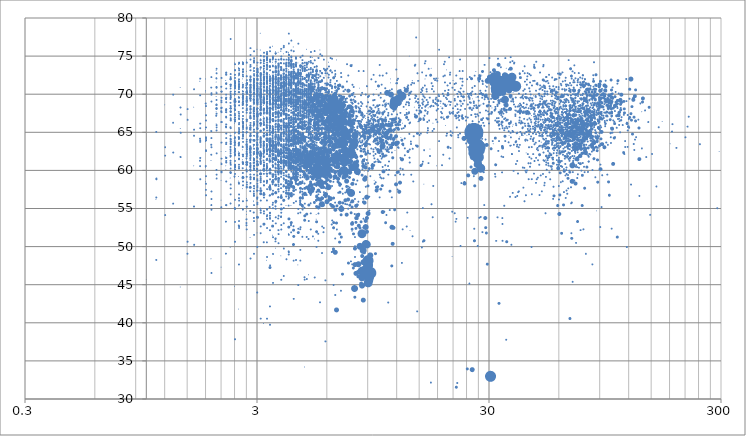
| Category | Series 0 |
|---|---|
| 32.8 | 71.7 |
| 34.4 | 70.9 |
| 37.3 | 71.2 |
| 32.4 | 70.5 |
| 38.9 | 71.1 |
| 34.9 | 71.7 |
| 36.9 | 71.7 |
| 31.8 | 71.5 |
| 35.6 | 71 |
| 34.1 | 71.4 |
| 36.6 | 71.7 |
| 32.5 | 71.6 |
| 31.3 | 71.7 |
| 31.3 | 72.2 |
| 35.1 | 72 |
| 37.5 | 72.3 |
| 34.3 | 70.3 |
| 31.7 | 70.8 |
| 35.1 | 69.3 |
| 37.8 | 71.3 |
| 36.3 | 71.3 |
| 35.1 | 71.8 |
| 38.5 | 71.3 |
| 32.3 | 71.9 |
| 35.2 | 72 |
| 31.8 | 69.8 |
| 32.5 | 71.5 |
| 35.6 | 72.2 |
| 36.0 | 71 |
| 37.6 | 71.1 |
| 35.6 | 72 |
| 32.8 | 71.4 |
| 37.9 | 71.5 |
| 36.7 | 70.9 |
| 38.2 | 71.1 |
| 31.2 | 71.5 |
| 35.8 | 71.8 |
| 35.6 | 72.1 |
| 33.5 | 71.8 |
| 32.3 | 71.7 |
| 35.1 | 72.5 |
| 31.3 | 72.5 |
| 36.6 | 70.5 |
| 31.4 | 71.5 |
| 35.9 | 71.5 |
| 32.5 | 72.2 |
| 29.5 | 71.8 |
| 32.6 | 72.7 |
| 31.4 | 70.5 |
| 32.1 | 71.6 |
| 36.0 | 71.7 |
| 35.5 | 71 |
| 31.4 | 71.6 |
| 34.3 | 71.5 |
| 35.5 | 68.6 |
| 36.9 | 71.2 |
| 31.7 | 72.4 |
| 35.8 | 71.4 |
| 30.0 | 72.3 |
| 36.8 | 71.4 |
| 33.2 | 70.8 |
| 37.3 | 71.1 |
| 37.1 | 69.8 |
| 34.1 | 71.7 |
| 33.7 | 67.7 |
| 30.8 | 72.4 |
| 32.9 | 73.9 |
| 31.4 | 73.2 |
| 32.8 | 71.8 |
| 37.1 | 73.4 |
| 27.1 | 72.1 |
| 34.0 | 72.1 |
| 34.1 | 71 |
| 33.2 | 71.9 |
| 23.2 | 69.7 |
| 28.1 | 70 |
| 27.2 | 72.5 |
| 25.1 | 72.1 |
| 46.9 | 73.5 |
| 26.0 | 71.1 |
| 27.7 | 70.2 |
| 23.4 | 69.2 |
| 49.1 | 68.4 |
| 32.9 | 67.7 |
| 45.2 | 66.7 |
| 47.2 | 66 |
| 37.9 | 65.8 |
| 5.6 | 58.4 |
| 5.8 | 61.5 |
| 5.8 | 59.6 |
| 6.0 | 60.7 |
| 5.7 | 61.2 |
| 6.1 | 57.8 |
| 5.8 | 59.9 |
| 5.3 | 61.4 |
| 5.9 | 60.5 |
| 6.0 | 61.5 |
| 5.4 | 60.5 |
| 5.2 | 60.2 |
| 6.9 | 55 |
| 7.3 | 58.6 |
| 6.0 | 59.7 |
| 5.5 | 59.2 |
| 5.1 | 62.3 |
| 5.5 | 61.1 |
| 5.7 | 57.9 |
| 5.5 | 61.8 |
| 6.0 | 55.9 |
| 6.0 | 60.4 |
| 4.4 | 59 |
| 8.9 | 56.5 |
| 5.2 | 57.6 |
| 5.5 | 59.5 |
| 6.2 | 61.4 |
| 5.4 | 61.4 |
| 6.0 | 60.3 |
| 6.2 | 60.2 |
| 5.8 | 61.6 |
| 6.5 | 59.2 |
| 5.4 | 59.8 |
| 5.8 | 62.5 |
| 5.6 | 62.3 |
| 9.0 | 54.4 |
| 4.9 | 61.3 |
| 5.7 | 60 |
| 6.1 | 59.5 |
| 5.1 | 58.1 |
| 8.7 | 58.9 |
| 5.2 | 61.6 |
| 4.1 | 61.8 |
| 5.5 | 60.9 |
| 5.9 | 56.9 |
| 7.9 | 47.7 |
| 5.8 | 60.8 |
| 5.8 | 61.7 |
| 5.2 | 59.8 |
| 12.4 | 58.4 |
| 5.9 | 58.4 |
| 5.0 | 57.6 |
| 5.2 | 62 |
| 12.3 | 57.2 |
| 5.9 | 59.4 |
| 5.5 | 61.6 |
| 5.7 | 60.3 |
| 6.1 | 61.1 |
| 4.8 | 62.9 |
| 4.8 | 62.5 |
| 5.5 | 59.5 |
| 5.8 | 60.2 |
| 5.8 | 60.9 |
| 6.5 | 59.8 |
| 5.8 | 59.3 |
| 5.2 | 60.2 |
| 5.4 | 61 |
| 5.1 | 57.2 |
| 5.6 | 61.3 |
| 4.8 | 59.5 |
| 5.3 | 61.3 |
| 5.5 | 56.3 |
| 5.5 | 60 |
| 11.9 | 58.2 |
| 10.5 | 59.9 |
| 4.9 | 62.5 |
| 5.1 | 61.8 |
| 4.5 | 62.7 |
| 6.1 | 59.8 |
| 8.8 | 53.4 |
| 5.2 | 62.1 |
| 6.2 | 62.4 |
| 6.2 | 59.3 |
| 5.4 | 62.2 |
| 5.3 | 60 |
| 5.6 | 62.9 |
| 5.6 | 60.5 |
| 6.2 | 59.2 |
| 5.5 | 59.1 |
| 5.5 | 60.2 |
| 8.7 | 55.8 |
| 9.8 | 57.4 |
| 5.4 | 60.8 |
| 5.7 | 61.8 |
| 4.5 | 62.2 |
| 5.1 | 60.8 |
| 6.0 | 58.8 |
| 5.5 | 57.4 |
| 8.9 | 53.8 |
| 5.6 | 56.2 |
| 5.1 | 61.9 |
| 5.0 | 60.8 |
| 5.9 | 61.2 |
| 5.5 | 62.1 |
| 5.3 | 59.5 |
| 5.4 | 62.2 |
| 5.7 | 56.4 |
| 5.8 | 62.3 |
| 6.0 | 61.7 |
| 5.3 | 60.7 |
| 4.3 | 61.2 |
| 5.6 | 59.3 |
| 4.5 | 62.2 |
| 7.7 | 56 |
| 5.8 | 60.9 |
| 4.8 | 60.7 |
| 4.9 | 61.8 |
| 7.9 | 49.8 |
| 5.4 | 61.9 |
| 9.4 | 60.7 |
| 6.1 | 62.7 |
| 5.4 | 62 |
| 5.4 | 62 |
| 5.2 | 61.9 |
| 5.6 | 59.7 |
| 5.2 | 59.9 |
| 5.2 | 63.1 |
| 4.7 | 64.5 |
| 4.6 | 61.9 |
| 4.6 | 62.2 |
| 6.0 | 62.1 |
| 8.1 | 54.1 |
| 7.2 | 60.9 |
| 4.8 | 57 |
| 8.2 | 52.8 |
| 8.1 | 54.2 |
| 5.1 | 61.3 |
| 4.4 | 61.3 |
| 6.4 | 62.1 |
| 7.0 | 62 |
| 5.5 | 55.2 |
| 5.1 | 61.7 |
| 10.4 | 54.6 |
| 4.6 | 61.9 |
| 5.0 | 60.5 |
| 6.2 | 59.2 |
| 10.4 | 58 |
| 5.8 | 61.3 |
| 12.2 | 59.8 |
| 5.7 | 59.4 |
| 5.1 | 57.2 |
| 8.0 | 53.7 |
| 5.7 | 58.6 |
| 5.2 | 62.3 |
| 5.4 | 61.4 |
| 5.0 | 60 |
| 4.9 | 60.5 |
| 5.3 | 55.8 |
| 5.2 | 62.5 |
| 4.6 | 61.4 |
| 4.7 | 61.8 |
| 5.9 | 59.5 |
| 4.0 | 58.7 |
| 5.9 | 60.8 |
| 5.6 | 61.7 |
| 4.4 | 61.6 |
| 5.4 | 58.1 |
| 5.0 | 61.1 |
| 5.0 | 57.8 |
| 6.7 | 58.5 |
| 5.1 | 61.3 |
| 5.7 | 61.5 |
| 4.9 | 57.8 |
| 8.0 | 53.2 |
| 5.7 | 62.5 |
| 5.2 | 59.5 |
| 4.4 | 61.7 |
| 4.7 | 60.6 |
| 5.3 | 58.2 |
| 5.0 | 61.8 |
| 4.9 | 60.4 |
| 4.6 | 60.3 |
| 5.4 | 56.1 |
| 4.5 | 60.2 |
| 5.1 | 59.2 |
| 5.7 | 61.6 |
| 5.1 | 59.7 |
| 4.9 | 61.8 |
| 4.9 | 61.3 |
| 9.8 | 57.8 |
| 4.6 | 56.4 |
| 4.9 | 61.2 |
| 7.7 | 52.3 |
| 4.5 | 61.4 |
| 8.1 | 55.5 |
| 5.3 | 61.4 |
| 4.5 | 63.8 |
| 4.8 | 60.5 |
| 3.2 | 60.1 |
| 4.5 | 61.1 |
| 5.6 | 61.2 |
| 5.5 | 61.3 |
| 5.2 | 60.1 |
| 5.0 | 62.1 |
| 5.2 | 61.2 |
| 5.9 | 63.7 |
| 5.2 | 57.5 |
| 5.1 | 59.8 |
| 4.3 | 50.3 |
| 5.1 | 60.1 |
| 2.8 | 57.8 |
| 5.5 | 61.9 |
| 4.8 | 59.5 |
| 11.2 | 57.3 |
| 5.0 | 60.8 |
| 7.8 | 51.7 |
| 5.8 | 59.4 |
| 5.5 | 61.5 |
| 6.2 | 58.6 |
| 5.4 | 58.8 |
| 5.0 | 60.8 |
| 4.5 | 61.8 |
| 5.1 | 62 |
| 6.8 | 59.3 |
| 5.8 | 57.8 |
| 5.2 | 60.3 |
| 4.3 | 61.2 |
| 5.2 | 59.2 |
| 4.5 | 58.2 |
| 5.5 | 60.3 |
| 6.4 | 60.7 |
| 4.2 | 62.2 |
| 4.3 | 61.9 |
| 9.0 | 58 |
| 5.0 | 60.9 |
| 5.3 | 61.2 |
| 4.9 | 61.2 |
| 4.9 | 62 |
| 4.8 | 60.4 |
| 4.8 | 61.1 |
| 5.8 | 61.2 |
| 5.1 | 60 |
| 5.7 | 59.7 |
| 5.8 | 62.1 |
| 4.3 | 52.2 |
| 4.7 | 61 |
| 3.9 | 62.4 |
| 6.2 | 62.7 |
| 5.9 | 60.5 |
| 3.9 | 56.1 |
| 4.6 | 60.9 |
| 8.6 | 55.9 |
| 4.5 | 64.2 |
| 6.1 | 61.9 |
| 3.5 | 58.5 |
| 5.2 | 59.8 |
| 5.1 | 63.1 |
| 5.7 | 63 |
| 7.7 | 53.2 |
| 6.4 | 55.3 |
| 5.2 | 61.6 |
| 5.1 | 57.5 |
| 5.6 | 55.6 |
| 7.4 | 62.8 |
| 5.2 | 61.1 |
| 4.4 | 62.1 |
| 5.4 | 55.3 |
| 6.0 | 60.1 |
| 4.8 | 61.7 |
| 4.7 | 62.3 |
| 5.0 | 55.5 |
| 5.7 | 61.7 |
| 2.6 | 59.1 |
| 6.4 | 53.2 |
| 4.8 | 60.5 |
| 6.5 | 61.2 |
| 5.9 | 61.4 |
| 4.2 | 53.2 |
| 4.0 | 63 |
| 9.9 | 57.9 |
| 5.9 | 59.1 |
| 4.8 | 61.3 |
| 4.6 | 60 |
| 3.7 | 62 |
| 3.4 | 60.1 |
| 4.2 | 62.3 |
| 4.2 | 56.7 |
| 4.5 | 62.4 |
| 4.7 | 59.9 |
| 4.1 | 61.6 |
| 4.9 | 61.2 |
| 3.6 | 61.7 |
| 6.0 | 61.8 |
| 4.7 | 62.1 |
| 4.9 | 61.8 |
| 4.4 | 62.3 |
| 4.3 | 61.8 |
| 6.5 | 60.5 |
| 5.4 | 62.1 |
| 5.1 | 61.2 |
| 4.9 | 60.8 |
| 5.5 | 62.4 |
| 4.6 | 57.7 |
| 4.8 | 62.7 |
| 4.3 | 60.2 |
| 4.7 | 61.1 |
| 5.3 | 59.2 |
| 3.5 | 61.6 |
| 4.6 | 60.1 |
| 6.0 | 60.9 |
| 6.1 | 61.5 |
| 3.6 | 56 |
| 5.3 | 60.5 |
| 4.1 | 61.1 |
| 3.2 | 53 |
| 5.0 | 61.3 |
| 4.6 | 60 |
| 4.8 | 54.1 |
| 8.3 | 52.5 |
| 3.2 | 56.9 |
| 5.9 | 63.7 |
| 6.6 | 55.4 |
| 4.1 | 60.8 |
| 6.2 | 60.8 |
| 4.5 | 51.9 |
| 5.4 | 62.2 |
| 4.0 | 57.9 |
| 4.4 | 60 |
| 5.5 | 64.1 |
| 10.2 | 57.6 |
| 3.7 | 60.3 |
| 5.1 | 61.3 |
| 4.7 | 61.4 |
| 9.1 | 60.3 |
| 3.5 | 59.5 |
| 5.2 | 61.5 |
| 4.1 | 61.6 |
| 5.7 | 60.2 |
| 5.5 | 59.4 |
| 5.5 | 61.8 |
| 6.2 | 60.1 |
| 4.1 | 53.7 |
| 5.2 | 63.3 |
| 11.7 | 54.9 |
| 7.0 | 55.8 |
| 4.3 | 51.4 |
| 5.6 | 60.1 |
| 3.8 | 62.4 |
| 7.2 | 62.9 |
| 5.0 | 61.3 |
| 4.7 | 57.2 |
| 5.1 | 62.1 |
| 5.0 | 61.4 |
| 4.8 | 61.5 |
| 4.6 | 57.1 |
| 4.7 | 61.2 |
| 4.1 | 61.4 |
| 5.0 | 58.9 |
| 4.9 | 61.7 |
| 5.2 | 58.1 |
| 9.6 | 60.7 |
| 3.6 | 51 |
| 5.6 | 59.8 |
| 3.6 | 60.9 |
| 6.4 | 58.5 |
| 6.5 | 61 |
| 5.0 | 58 |
| 4.3 | 57.9 |
| 4.0 | 59.9 |
| 3.7 | 53.7 |
| 4.6 | 55.8 |
| 16.7 | 61.9 |
| 3.3 | 60.2 |
| 2.7 | 53.1 |
| 6.1 | 62.5 |
| 11.2 | 54.8 |
| 5.0 | 59.1 |
| 5.0 | 51 |
| 4.8 | 60.7 |
| 5.1 | 62.4 |
| 4.3 | 59.6 |
| 3.9 | 60.2 |
| 3.6 | 59.9 |
| 4.7 | 62.5 |
| 6.0 | 60.2 |
| 8.2 | 55.9 |
| 7.5 | 59.7 |
| 7.2 | 57.1 |
| 6.7 | 59 |
| 3.6 | 55.3 |
| 7.2 | 55.6 |
| 3.7 | 61.1 |
| 4.9 | 59 |
| 3.7 | 62.4 |
| 5.3 | 60.2 |
| 2.6 | 61.1 |
| 4.3 | 59.3 |
| 5.1 | 60.9 |
| 3.5 | 58.2 |
| 8.6 | 52.5 |
| 4.7 | 55.3 |
| 4.8 | 58.3 |
| 18.8 | 60.7 |
| 3.5 | 55.5 |
| 4.6 | 52.3 |
| 3.6 | 50.7 |
| 4.6 | 60.8 |
| 5.0 | 61.4 |
| 4.5 | 61.6 |
| 7.6 | 55.8 |
| 5.6 | 60.2 |
| 5.1 | 55.7 |
| 4.8 | 62.1 |
| 7.4 | 57.9 |
| 2.8 | 54.7 |
| 2.7 | 53.6 |
| 5.5 | 61.6 |
| 4.0 | 61.2 |
| 4.2 | 62 |
| 4.6 | 59.9 |
| 5.7 | 57.9 |
| 4.9 | 59.9 |
| 4.8 | 46 |
| 5.0 | 61.6 |
| 4.3 | 59.1 |
| 6.9 | 58.2 |
| 2.5 | 52.8 |
| 2.8 | 57.3 |
| 3.8 | 58.2 |
| 9.6 | 61.1 |
| 3.0 | 62.6 |
| 3.0 | 56.3 |
| 2.2 | 53.3 |
| 4.8 | 61.9 |
| 4.8 | 61.1 |
| 3.7 | 63.4 |
| 4.7 | 58.6 |
| 6.1 | 56.2 |
| 5.7 | 59.9 |
| 7.9 | 54.3 |
| 4.0 | 60.8 |
| 3.5 | 61.7 |
| 3.6 | 51.1 |
| 3.9 | 60.5 |
| 8.6 | 56.3 |
| 5.5 | 50.8 |
| 7.7 | 47.7 |
| 4.2 | 53 |
| 4.1 | 59.2 |
| 11.1 | 60.1 |
| 4.6 | 49.6 |
| 6.7 | 57.1 |
| 12.7 | 52.3 |
| 4.9 | 51.3 |
| 3.7 | 58.2 |
| 3.6 | 55.8 |
| 3.9 | 58.1 |
| 4.7 | 62.3 |
| 4.5 | 54.4 |
| 4.9 | 57.8 |
| 2.9 | 57.3 |
| 17.2 | 58 |
| 3.8 | 56.6 |
| 4.4 | 59.4 |
| 3.5 | 53.4 |
| 8.1 | 58.7 |
| 5.1 | 54.4 |
| 2.6 | 59.2 |
| 4.0 | 57 |
| 1.9 | 62.1 |
| 4.1 | 57.4 |
| 5.4 | 50 |
| 3.3 | 58.4 |
| 4.3 | 59.8 |
| 4.5 | 59.5 |
| 3.0 | 56.5 |
| 3.0 | 60.2 |
| 6.1 | 56 |
| 4.2 | 60.5 |
| 8.6 | 53.7 |
| 3.3 | 50.6 |
| 3.8 | 54 |
| 11.4 | 56.5 |
| 4.5 | 61.7 |
| 3.7 | 52.2 |
| 3.3 | 56.1 |
| 2.9 | 53.8 |
| 2.7 | 52.3 |
| 3.0 | 50 |
| 4.6 | 59.4 |
| 12.7 | 60.2 |
| 17.1 | 53.9 |
| 4.6 | 56.5 |
| 16.9 | 55.6 |
| 3.4 | 60.2 |
| 10.1 | 56.5 |
| 5.0 | 53.4 |
| 2.5 | 47.7 |
| 2.6 | 56 |
| 4.7 | 54.9 |
| 16.4 | 61 |
| 3.6 | 57.2 |
| 5.1 | 52.3 |
| 2.8 | 59.5 |
| 5.5 | 56.9 |
| 3.4 | 52.2 |
| 15.7 | 62.7 |
| 3.7 | 58.5 |
| 3.2 | 58.6 |
| 3.1 | 58.8 |
| 5.5 | 54.4 |
| 5.7 | 49.2 |
| 3.3 | 58.7 |
| 10.8 | 54.2 |
| 8.8 | 47.1 |
| 3.3 | 55 |
| 2.6 | 54.9 |
| 2.8 | 60.2 |
| 7.9 | 56.3 |
| 4.1 | 49.3 |
| 2.3 | 56.9 |
| 8.8 | 57.9 |
| 3.4 | 61.2 |
| 9.1 | 56.6 |
| 3.6 | 60.3 |
| 5.9 | 57.7 |
| 7.9 | 51.3 |
| 2.3 | 58.2 |
| 6.6 | 52.3 |
| 3.2 | 58.6 |
| 2.9 | 55.5 |
| 9.9 | 57.6 |
| 4.4 | 62.7 |
| 4.5 | 52.4 |
| 2.4 | 55 |
| 3.2 | 56.5 |
| 2.4 | 53.3 |
| 2.2 | 55.5 |
| 3.3 | 53.7 |
| 1.9 | 57.3 |
| 2.5 | 55.5 |
| 9.1 | 54.8 |
| 5.5 | 58.8 |
| 3.8 | 48.8 |
| 6.9 | 59.1 |
| 2.7 | 56.3 |
| 7.6 | 62.1 |
| 7.6 | 57.1 |
| 7.7 | 60.5 |
| 8.1 | 59.9 |
| 7.3 | 62.2 |
| 7.2 | 62 |
| 7.2 | 62.8 |
| 6.3 | 61.5 |
| 6.6 | 61.2 |
| 7.2 | 62.5 |
| 6.9 | 61.6 |
| 7.0 | 60.2 |
| 7.3 | 61.5 |
| 7.6 | 61.2 |
| 7.4 | 59.9 |
| 6.2 | 56.3 |
| 7.1 | 62.8 |
| 7.7 | 61.9 |
| 7.5 | 61.1 |
| 7.2 | 60.2 |
| 6.9 | 60 |
| 7.1 | 61.1 |
| 7.1 | 62.5 |
| 6.8 | 59.6 |
| 68.3 | 58.6 |
| 7.8 | 62 |
| 7.4 | 57.3 |
| 7.1 | 60.8 |
| 7.1 | 59.2 |
| 6.9 | 61.5 |
| 4.2 | 60.5 |
| 6.5 | 49.3 |
| 7.5 | 59.8 |
| 7.2 | 61 |
| 77.8 | 62.4 |
| 7.2 | 59.6 |
| 8.0 | 60.5 |
| 7.2 | 61.1 |
| 7.2 | 61.2 |
| 7.0 | 61.6 |
| 83.5 | 63.1 |
| 6.0 | 59.5 |
| 7.0 | 59.9 |
| 5.0 | 60.6 |
| 8.8 | 59.1 |
| 7.4 | 61.3 |
| 7.9 | 60.8 |
| 40.8 | 67.8 |
| 5.9 | 63.5 |
| 6.5 | 61.6 |
| 6.4 | 61.2 |
| 7.4 | 62.2 |
| 7.2 | 59.8 |
| 7.3 | 59.3 |
| 6.7 | 60.9 |
| 6.6 | 64 |
| 6.7 | 58.9 |
| 5.7 | 59.7 |
| 7.0 | 61.6 |
| 7.7 | 60.2 |
| 8.6 | 60.6 |
| 7.1 | 59.6 |
| 133.2 | 61.5 |
| 5.8 | 62 |
| 60.2 | 54.3 |
| 4.9 | 61.1 |
| 7.2 | 62.4 |
| 70.7 | 58.3 |
| 7.2 | 56.1 |
| 8.8 | 60.4 |
| 7.4 | 56.2 |
| 7.2 | 59.5 |
| 7.6 | 61.8 |
| 4.2 | 58.4 |
| 4.4 | 60.4 |
| 59.5 | 60.3 |
| 7.0 | 60.9 |
| 7.4 | 60 |
| 7.0 | 60.1 |
| 6.4 | 62.8 |
| 6.8 | 55.8 |
| 8.1 | 60.7 |
| 7.7 | 62.5 |
| 6.0 | 59.8 |
| 6.8 | 61.9 |
| 6.6 | 60.5 |
| 4.1 | 62.7 |
| 6.9 | 61.4 |
| 4.6 | 58.4 |
| 8.1 | 59.7 |
| 6.9 | 61.4 |
| 102.5 | 60.9 |
| 7.5 | 57.4 |
| 4.2 | 61.7 |
| 5.1 | 60.4 |
| 28.8 | 53.8 |
| 4.9 | 59.3 |
| 8.0 | 60.8 |
| 28.9 | 69.8 |
| 4.4 | 62.8 |
| 6.7 | 61.5 |
| 5.3 | 59.9 |
| 6.7 | 60.5 |
| 6.0 | 62.7 |
| 7.9 | 63.3 |
| 137.6 | 69.5 |
| 4.4 | 59.6 |
| 7.9 | 61.1 |
| 8.0 | 61.8 |
| 4.1 | 58.2 |
| 60.0 | 61.2 |
| 5.2 | 59 |
| 7.4 | 61.1 |
| 5.1 | 61.4 |
| 6.3 | 55.4 |
| 6.5 | 54.9 |
| 6.6 | 61.3 |
| 7.4 | 64.3 |
| 7.7 | 58.3 |
| 3.5 | 65 |
| 5.0 | 61.5 |
| 7.3 | 61.7 |
| 5.3 | 67.2 |
| 4.2 | 60.2 |
| 29.5 | 47.7 |
| 5.3 | 63.3 |
| 6.7 | 60.7 |
| 6.1 | 61.4 |
| 4.7 | 55.4 |
| 3.5 | 56.9 |
| 7.0 | 67.5 |
| 7.3 | 57.9 |
| 4.3 | 59 |
| 4.2 | 61 |
| 5.1 | 57 |
| 3.6 | 61.4 |
| 5.1 | 62.5 |
| 7.4 | 62.4 |
| 6.5 | 61.9 |
| 75.6 | 55.4 |
| 6.2 | 69.3 |
| 72.2 | 53.3 |
| 6.5 | 64.4 |
| 4.3 | 62.8 |
| 98.2 | 58.5 |
| 6.8 | 62.6 |
| 3.5 | 52.7 |
| 5.2 | 72.2 |
| 7.7 | 55.2 |
| 6.8 | 58.3 |
| 4.0 | 61.2 |
| 6.7 | 64.5 |
| 8.0 | 62 |
| 6.9 | 60.9 |
| 4.6 | 60.5 |
| 8.1 | 60.8 |
| 29.0 | 52.5 |
| 6.0 | 68.1 |
| 6.8 | 50.6 |
| 6.6 | 65 |
| 7.7 | 66.5 |
| 6.4 | 49.7 |
| 4.5 | 60.1 |
| 5.1 | 58.5 |
| 67.9 | 72.4 |
| 29.2 | 51.8 |
| 28.1 | 73 |
| 3.8 | 59.9 |
| 5.8 | 59.3 |
| 7.0 | 46.4 |
| 5.1 | 60.9 |
| 5.5 | 70.8 |
| 6.2 | 69.4 |
| 6.8 | 61.7 |
| 4.0 | 67.4 |
| 74.2 | 60.9 |
| 6.4 | 49.4 |
| 4.4 | 61 |
| 146.8 | 68.3 |
| 65.9 | 63.9 |
| 68.1 | 51.1 |
| 7.8 | 64 |
| 5.3 | 62.8 |
| 5.2 | 69.2 |
| 5.1 | 62.3 |
| 6.7 | 61.7 |
| 8.1 | 61.3 |
| 89.3 | 65.5 |
| 5.1 | 66.5 |
| 8.1 | 46.7 |
| 35.1 | 64.5 |
| 7.5 | 59.1 |
| 3.7 | 59.8 |
| 60.5 | 56.8 |
| 4.1 | 69.4 |
| 4.5 | 65.1 |
| 6.4 | 63.2 |
| 7.7 | 63.9 |
| 6.5 | 68.7 |
| 8.5 | 59.4 |
| 4.4 | 62 |
| 4.2 | 58.5 |
| 51.3 | 71.9 |
| 63.2 | 59.9 |
| 4.7 | 66.4 |
| 4.6 | 62.1 |
| 6.7 | 67.1 |
| 6.0 | 60.3 |
| 6.1 | 61 |
| 137.4 | 69 |
| 87.9 | 61.4 |
| 7.4 | 64.9 |
| 4.5 | 60.7 |
| 15.7 | 50.8 |
| 60.7 | 59.7 |
| 6.2 | 60.3 |
| 4.7 | 61.5 |
| 59.2 | 55.4 |
| 9.4 | 67.7 |
| 3.4 | 62.8 |
| 6.2 | 63.4 |
| 6.4 | 56.4 |
| 6.9 | 54.2 |
| 4.7 | 65.5 |
| 3.7 | 62.2 |
| 4.4 | 65.2 |
| 4.3 | 67.6 |
| 4.3 | 57.9 |
| 6.8 | 62.3 |
| 6.7 | 62.1 |
| 6.7 | 68.7 |
| 4.5 | 71.6 |
| 3.8 | 64.2 |
| 4.4 | 60 |
| 4.0 | 67.3 |
| 7.8 | 58.8 |
| 62.7 | 55.5 |
| 3.6 | 58.1 |
| 4.1 | 64.4 |
| 7.3 | 63.8 |
| 3.4 | 61.9 |
| 6.6 | 69.6 |
| 4.7 | 56.4 |
| 6.5 | 63.4 |
| 4.4 | 61.4 |
| 6.9 | 63.4 |
| 5.1 | 64.3 |
| 6.8 | 64.2 |
| 26.5 | 65.8 |
| 5.6 | 67.5 |
| 25.9 | 50.8 |
| 3.5 | 58.6 |
| 4.1 | 57 |
| 5.7 | 69.1 |
| 7.8 | 62.1 |
| 4.9 | 63.4 |
| 4.2 | 58.9 |
| 4.0 | 58.4 |
| 4.4 | 67.3 |
| 4.7 | 71.4 |
| 3.9 | 61.3 |
| 4.5 | 64.8 |
| 3.6 | 58.9 |
| 6.2 | 71.2 |
| 5.5 | 69.2 |
| 100.5 | 71.9 |
| 4.3 | 64.3 |
| 4.6 | 70.2 |
| 8.4 | 61.9 |
| 95.5 | 71.1 |
| 4.9 | 54.3 |
| 3.7 | 63.6 |
| 5.4 | 66.2 |
| 5.2 | 57.3 |
| 5.3 | 62.5 |
| 4.1 | 62.2 |
| 53.6 | 61.7 |
| 7.9 | 43.4 |
| 4.0 | 61 |
| 77.3 | 57.7 |
| 7.5 | 64.3 |
| 4.0 | 70.4 |
| 6.9 | 67.9 |
| 3.3 | 64.7 |
| 66.8 | 40.6 |
| 5.2 | 69.2 |
| 7.5 | 69.8 |
| 5.2 | 70.6 |
| 4.1 | 56.9 |
| 6.1 | 56.6 |
| 3.1 | 62 |
| 3.5 | 66.7 |
| 4.5 | 63.9 |
| 6.9 | 62.5 |
| 7.6 | 60.3 |
| 8.0 | 64.3 |
| 3.6 | 62.5 |
| 4.2 | 74.4 |
| 6.6 | 60.8 |
| 6.2 | 62.8 |
| 6.0 | 59.1 |
| 3.9 | 63.1 |
| 4.1 | 64 |
| 4.1 | 62.3 |
| 4.3 | 64.1 |
| 5.3 | 66 |
| 5.3 | 63 |
| 5.0 | 68.8 |
| 5.4 | 71.9 |
| 26.7 | 65.8 |
| 7.0 | 61.1 |
| 4.8 | 53.5 |
| 7.7 | 70 |
| 5.5 | 68.9 |
| 6.7 | 60.6 |
| 57.0 | 56.7 |
| 8.4 | 62.6 |
| 4.3 | 62.2 |
| 6.8 | 51.7 |
| 4.9 | 61.6 |
| 4.8 | 68 |
| 4.1 | 60.6 |
| 5.4 | 63 |
| 5.1 | 69.7 |
| 6.0 | 71.4 |
| 4.8 | 61 |
| 3.7 | 65.4 |
| 4.5 | 61.4 |
| 6.4 | 61 |
| 3.8 | 63.4 |
| 65.5 | 59 |
| 5.7 | 69 |
| 4.8 | 60.7 |
| 6.3 | 59.9 |
| 5.1 | 69.4 |
| 8.1 | 59.9 |
| 4.4 | 69.1 |
| 4.7 | 68.2 |
| 6.4 | 72.2 |
| 2.8 | 62.9 |
| 82.0 | 67.2 |
| 49.4 | 62.1 |
| 4.1 | 52.6 |
| 3.5 | 62.6 |
| 88.0 | 58.5 |
| 6.1 | 63.3 |
| 8.6 | 61.4 |
| 4.9 | 60.2 |
| 4.3 | 70.6 |
| 6.7 | 60.7 |
| 6.8 | 66 |
| 4.2 | 61.6 |
| 4.4 | 69.8 |
| 4.8 | 68.8 |
| 4.6 | 64.3 |
| 7.9 | 62.3 |
| 5.0 | 68.7 |
| 3.8 | 68.6 |
| 5.3 | 64.3 |
| 7.5 | 61.3 |
| 5.4 | 73.1 |
| 4.6 | 72.8 |
| 6.7 | 63.1 |
| 3.4 | 61.3 |
| 3.6 | 62.9 |
| 5.1 | 70.2 |
| 6.3 | 62 |
| 5.2 | 63.8 |
| 4.4 | 58.7 |
| 4.0 | 69.2 |
| 3.6 | 61.6 |
| 3.7 | 67.6 |
| 5.5 | 62.9 |
| 6.5 | 69.4 |
| 3.5 | 63.3 |
| 5.1 | 70.4 |
| 3.4 | 64.1 |
| 3.7 | 62.6 |
| 5.4 | 59.3 |
| 6.8 | 61.9 |
| 5.4 | 61.1 |
| 4.2 | 64 |
| 7.6 | 62.1 |
| 103.6 | 64.3 |
| 7.0 | 71 |
| 4.6 | 61.5 |
| 10.0 | 61.2 |
| 4.7 | 64.7 |
| 6.3 | 65.6 |
| 4.7 | 64.7 |
| 5.9 | 56.6 |
| 6.8 | 64.3 |
| 4.4 | 63.6 |
| 5.9 | 62.8 |
| 4.2 | 63.4 |
| 79.9 | 70.6 |
| 5.2 | 70.5 |
| 3.8 | 61.1 |
| 6.9 | 55.3 |
| 5.6 | 71.7 |
| 75.6 | 71.2 |
| 4.3 | 57.4 |
| 5.8 | 63.1 |
| 3.6 | 57.1 |
| 81.3 | 69.9 |
| 120.8 | 70.7 |
| 4.3 | 62.6 |
| 89.1 | 68.2 |
| 6.1 | 59.5 |
| 4.5 | 62.5 |
| 5.1 | 61.9 |
| 4.2 | 61.5 |
| 4.3 | 64.6 |
| 4.9 | 62.6 |
| 3.6 | 69.2 |
| 4.1 | 64.6 |
| 5.8 | 70.8 |
| 3.6 | 63 |
| 4.1 | 57.8 |
| 106.8 | 51.3 |
| 4.3 | 63.5 |
| 3.4 | 47.3 |
| 75.5 | 59.4 |
| 4.7 | 63 |
| 125.3 | 69.5 |
| 4.2 | 56.8 |
| 5.1 | 57.1 |
| 3.4 | 64.2 |
| 4.8 | 62 |
| 6.5 | 61.5 |
| 3.4 | 62.7 |
| 3.9 | 69 |
| 3.3 | 64.2 |
| 5.0 | 59.7 |
| 4.8 | 62.4 |
| 75.9 | 68.8 |
| 4.2 | 73.9 |
| 3.9 | 61.8 |
| 5.6 | 67.2 |
| 4.3 | 61.2 |
| 5.4 | 70.1 |
| 4.0 | 62.9 |
| 4.1 | 57.7 |
| 25.3 | 64.3 |
| 3.4 | 70.1 |
| 6.0 | 69.3 |
| 5.0 | 72.5 |
| 5.9 | 73.2 |
| 4.8 | 69 |
| 3.5 | 72.1 |
| 3.7 | 68.3 |
| 6.5 | 61.4 |
| 3.3 | 70.5 |
| 6.1 | 68.6 |
| 5.1 | 59.9 |
| 5.6 | 69.1 |
| 5.0 | 69.6 |
| 4.8 | 70.1 |
| 3.6 | 69.3 |
| 4.6 | 63.9 |
| 3.7 | 69.7 |
| 6.0 | 59.5 |
| 5.4 | 62.9 |
| 3.4 | 68.2 |
| 6.1 | 59.8 |
| 3.0 | 62.9 |
| 3.4 | 63.7 |
| 4.2 | 69.1 |
| 33.3 | 71.1 |
| 3.3 | 67.6 |
| 3.1 | 59.6 |
| 5.4 | 61.6 |
| 6.7 | 68.3 |
| 6.5 | 71 |
| 5.8 | 61.3 |
| 4.4 | 64.3 |
| 6.0 | 68.2 |
| 7.6 | 73.8 |
| 2.7 | 61.1 |
| 4.8 | 63.1 |
| 5.2 | 62.8 |
| 6.2 | 61.4 |
| 4.8 | 59.6 |
| 4.3 | 59.6 |
| 7.1 | 59.8 |
| 4.4 | 58.8 |
| 7.1 | 68.7 |
| 5.3 | 59.3 |
| 8.0 | 64 |
| 4.3 | 57.8 |
| 4.3 | 59.2 |
| 4.3 | 72.2 |
| 6.9 | 51.3 |
| 5.8 | 62.4 |
| 3.7 | 62.4 |
| 4.3 | 64 |
| 4.3 | 63.7 |
| 4.9 | 61.7 |
| 4.1 | 62.8 |
| 4.4 | 72.2 |
| 5.1 | 61.8 |
| 3.8 | 71 |
| 4.4 | 63.6 |
| 95.3 | 71 |
| 4.3 | 72.4 |
| 3.9 | 71.5 |
| 4.2 | 57 |
| 3.7 | 65.8 |
| 6.7 | 71.2 |
| 4.8 | 57.7 |
| 4.8 | 62 |
| 4.3 | 70 |
| 6.5 | 63.5 |
| 4.2 | 69.4 |
| 82.9 | 69.8 |
| 34.0 | 66.4 |
| 2.4 | 69.1 |
| 5.3 | 67.8 |
| 5.6 | 69.2 |
| 5.7 | 63.9 |
| 4.4 | 65.3 |
| 3.8 | 56.5 |
| 4.1 | 61.8 |
| 75.9 | 71.6 |
| 3.5 | 68.8 |
| 4.8 | 66 |
| 3.1 | 62.2 |
| 4.1 | 60.4 |
| 3.9 | 61.1 |
| 3.7 | 63.7 |
| 71.7 | 62.8 |
| 3.0 | 53.9 |
| 80.2 | 70.7 |
| 3.9 | 61.9 |
| 5.1 | 57.2 |
| 4.1 | 69 |
| 4.2 | 58 |
| 5.2 | 70.8 |
| 3.8 | 62.4 |
| 5.3 | 70 |
| 67.1 | 73.4 |
| 3.4 | 59.7 |
| 59.3 | 69.6 |
| 86.1 | 70.7 |
| 5.6 | 70 |
| 4.6 | 61.3 |
| 4.3 | 66.8 |
| 7.5 | 63.2 |
| 61.4 | 51.8 |
| 3.7 | 64.2 |
| 5.1 | 67.9 |
| 3.0 | 62.4 |
| 5.4 | 67.1 |
| 5.1 | 63.5 |
| 5.1 | 61.6 |
| 98.6 | 56.8 |
| 4.6 | 55.6 |
| 7.5 | 55.5 |
| 4.3 | 65.3 |
| 91.7 | 66.8 |
| 3.1 | 57.4 |
| 4.5 | 69.5 |
| 4.4 | 64.4 |
| 3.5 | 62.2 |
| 6.2 | 55.6 |
| 34.1 | 63.2 |
| 5.4 | 56.7 |
| 6.6 | 60.5 |
| 4.4 | 62.6 |
| 35.6 | 50.7 |
| 4.2 | 63.4 |
| 19.9 | 63.1 |
| 5.6 | 66.6 |
| 3.7 | 61.2 |
| 3.7 | 59 |
| 4.1 | 58.2 |
| 5.0 | 71 |
| 6.8 | 69.2 |
| 4.5 | 63.7 |
| 4.3 | 61.9 |
| 4.9 | 65.6 |
| 3.6 | 63.3 |
| 6.9 | 61.2 |
| 3.9 | 65 |
| 4.3 | 73 |
| 56.5 | 61 |
| 4.6 | 73.8 |
| 5.8 | 62.3 |
| 5.0 | 69.4 |
| 5.4 | 62.1 |
| 7.2 | 67.5 |
| 6.8 | 69.3 |
| 5.6 | 62.9 |
| 3.9 | 67.9 |
| 5.7 | 67.8 |
| 4.0 | 57.1 |
| 4.1 | 64.1 |
| 4.5 | 69.2 |
| 6.7 | 70.8 |
| 4.6 | 61.6 |
| 5.4 | 64.3 |
| 74.7 | 66.9 |
| 3.1 | 57 |
| 3.4 | 63.4 |
| 5.0 | 68 |
| 4.1 | 70.3 |
| 4.4 | 58.8 |
| 4.1 | 62.3 |
| 4.1 | 59.2 |
| 3.0 | 60.8 |
| 3.1 | 69.7 |
| 4.5 | 67.6 |
| 4.1 | 65.2 |
| 3.1 | 66.2 |
| 3.8 | 55 |
| 3.4 | 57.6 |
| 5.9 | 69.8 |
| 4.5 | 69.4 |
| 4.3 | 70 |
| 5.0 | 68.9 |
| 6.8 | 57.2 |
| 3.9 | 71.1 |
| 4.3 | 64.9 |
| 10.7 | 68.7 |
| 4.4 | 68.7 |
| 3.6 | 73 |
| 5.8 | 59.5 |
| 2.9 | 64 |
| 5.3 | 72.5 |
| 6.6 | 61.1 |
| 4.8 | 64.4 |
| 31.9 | 60.8 |
| 4.4 | 71.2 |
| 4.6 | 62.1 |
| 8.6 | 61.3 |
| 5.6 | 64.5 |
| 9.5 | 69.2 |
| 3.7 | 57.5 |
| 6.9 | 44.2 |
| 5.1 | 63.9 |
| 72.0 | 59 |
| 4.8 | 68.7 |
| 4.7 | 71.4 |
| 6.4 | 70 |
| 3.8 | 74.1 |
| 2.9 | 64 |
| 4.0 | 61.7 |
| 7.3 | 66.4 |
| 4.3 | 60.5 |
| 5.9 | 71.4 |
| 3.5 | 62.5 |
| 184.5 | 65.1 |
| 3.4 | 62.8 |
| 4.1 | 58.6 |
| 2.7 | 70.3 |
| 4.4 | 63.2 |
| 3.0 | 60.2 |
| 4.0 | 69 |
| 4.4 | 67.9 |
| 4.9 | 60.7 |
| 3.8 | 69.2 |
| 4.2 | 66.6 |
| 39.0 | 56.5 |
| 7.4 | 61.5 |
| 65.7 | 59.4 |
| 5.1 | 64.1 |
| 3.9 | 67.7 |
| 4.5 | 68.3 |
| 3.7 | 67.6 |
| 4.6 | 62.3 |
| 6.1 | 67 |
| 86.2 | 59.1 |
| 4.2 | 60.8 |
| 3.9 | 68.7 |
| 4.0 | 68.1 |
| 3.6 | 69.5 |
| 3.9 | 64.8 |
| 4.2 | 58.6 |
| 4.7 | 64.3 |
| 5.6 | 70.1 |
| 4.9 | 61 |
| 5.0 | 69.6 |
| 6.8 | 54.9 |
| 6.3 | 52.9 |
| 83.9 | 68.9 |
| 5.4 | 69.4 |
| 4.8 | 59.8 |
| 5.6 | 67.8 |
| 100.6 | 63.6 |
| 3.5 | 70.5 |
| 3.2 | 68.9 |
| 3.9 | 68.7 |
| 5.3 | 69.9 |
| 3.1 | 62.5 |
| 5.9 | 66.5 |
| 6.3 | 64.6 |
| 3.8 | 64.7 |
| 4.5 | 59.2 |
| 4.0 | 69.3 |
| 7.2 | 70.6 |
| 11.9 | 69.3 |
| 4.3 | 63.8 |
| 4.8 | 69.9 |
| 3.8 | 69 |
| 84.5 | 72 |
| 39.1 | 63.7 |
| 3.2 | 62.2 |
| 3.4 | 67.4 |
| 105.4 | 70.3 |
| 7.1 | 62.3 |
| 5.0 | 70.3 |
| 5.0 | 69.9 |
| 4.0 | 70.5 |
| 6.7 | 68.3 |
| 4.2 | 52.8 |
| 2.4 | 59.2 |
| 34.9 | 70 |
| 4.7 | 62.3 |
| 4.3 | 62 |
| 4.8 | 62.8 |
| 5.3 | 69.6 |
| 5.4 | 59.1 |
| 5.5 | 70.1 |
| 5.4 | 69.6 |
| 4.0 | 67.3 |
| 28.1 | 51.9 |
| 70.2 | 67.2 |
| 4.9 | 70 |
| 2.8 | 60.5 |
| 7.3 | 61.3 |
| 5.2 | 70.6 |
| 76.5 | 65.2 |
| 4.5 | 68.7 |
| 4.0 | 71.8 |
| 3.5 | 63.4 |
| 3.4 | 70.8 |
| 3.5 | 68.1 |
| 4.6 | 67.2 |
| 4.8 | 66.2 |
| 2.8 | 65.4 |
| 60.4 | 72.6 |
| 3.2 | 69.2 |
| 4.5 | 69.3 |
| 6.2 | 65.4 |
| 4.4 | 59.3 |
| 5.0 | 71.8 |
| 3.8 | 62.8 |
| 4.4 | 68.3 |
| 3.1 | 61.5 |
| 5.2 | 62.2 |
| 3.4 | 66.7 |
| 5.2 | 60.9 |
| 4.5 | 65.7 |
| 3.5 | 64.6 |
| 3.4 | 65.3 |
| 4.7 | 64.2 |
| 52.4 | 70.8 |
| 6.1 | 67.9 |
| 5.1 | 65.6 |
| 2.7 | 63.4 |
| 7.0 | 61.7 |
| 14.7 | 41.5 |
| 4.2 | 62.6 |
| 3.6 | 63.3 |
| 5.3 | 62.4 |
| 3.4 | 56.7 |
| 4.8 | 64.1 |
| 3.5 | 69.4 |
| 4.2 | 58.2 |
| 40.0 | 59.6 |
| 68.7 | 73 |
| 3.1 | 59.5 |
| 3.7 | 67.3 |
| 4.8 | 67.5 |
| 4.6 | 71.5 |
| 4.9 | 71.8 |
| 3.5 | 62.8 |
| 4.3 | 73.6 |
| 4.6 | 72.6 |
| 4.3 | 68.4 |
| 4.8 | 68.7 |
| 3.3 | 59.6 |
| 3.6 | 70.5 |
| 3.3 | 70.4 |
| 4.3 | 61.3 |
| 32.3 | 71.3 |
| 102.2 | 70.9 |
| 3.4 | 61.9 |
| 5.1 | 59.7 |
| 5.1 | 58.3 |
| 4.6 | 64.9 |
| 4.7 | 73.4 |
| 3.9 | 63 |
| 4.0 | 61.6 |
| 2.7 | 52.8 |
| 14.0 | 71.5 |
| 10.6 | 66.7 |
| 4.0 | 69.4 |
| 2.7 | 60.1 |
| 37.0 | 74.2 |
| 73.6 | 70.5 |
| 3.5 | 61.2 |
| 3.7 | 66.4 |
| 4.9 | 68.8 |
| 5.7 | 62.8 |
| 4.0 | 69.9 |
| 3.5 | 63.9 |
| 3.9 | 62.3 |
| 4.3 | 66.7 |
| 5.2 | 72.5 |
| 4.0 | 69.2 |
| 4.0 | 63.4 |
| 3.5 | 62.2 |
| 84.4 | 72.5 |
| 6.8 | 58.1 |
| 5.0 | 69.7 |
| 5.7 | 61.2 |
| 2.5 | 63.5 |
| 96.5 | 69 |
| 8.5 | 67.6 |
| 5.4 | 65.3 |
| 117.1 | 72 |
| 3.6 | 64.3 |
| 76.2 | 72.5 |
| 6.8 | 65.7 |
| 5.5 | 64.4 |
| 3.8 | 60.5 |
| 4.8 | 61.7 |
| 5.2 | 67 |
| 102.3 | 70.1 |
| 82.2 | 71.1 |
| 3.9 | 62.6 |
| 6.1 | 72.2 |
| 3.1 | 70.8 |
| 3.9 | 71.1 |
| 6.1 | 70.2 |
| 6.4 | 67.7 |
| 6.4 | 66.7 |
| 5.9 | 61 |
| 88.8 | 67.4 |
| 4.5 | 72.5 |
| 3.9 | 67.8 |
| 7.1 | 70.4 |
| 4.0 | 61.1 |
| 117.3 | 69.1 |
| 3.6 | 70.5 |
| 8.9 | 68.4 |
| 3.1 | 60 |
| 43.7 | 60 |
| 6.2 | 61.3 |
| 4.8 | 67.5 |
| 4.8 | 55.1 |
| 4.7 | 71 |
| 92.0 | 70.7 |
| 5.6 | 70.1 |
| 27.6 | 53.9 |
| 6.1 | 67.7 |
| 5.2 | 63.8 |
| 4.1 | 69.1 |
| 4.0 | 70.1 |
| 3.6 | 63.8 |
| 51.9 | 70.9 |
| 5.0 | 69.1 |
| 85.0 | 74.2 |
| 3.6 | 63.7 |
| 4.1 | 64 |
| 157.9 | 57.9 |
| 3.4 | 55.2 |
| 3.6 | 62.7 |
| 6.0 | 71.2 |
| 97.2 | 68.6 |
| 5.4 | 56.5 |
| 69.6 | 65.6 |
| 4.9 | 71.8 |
| 3.4 | 61.5 |
| 3.7 | 60.3 |
| 3.4 | 67.8 |
| 5.4 | 62.1 |
| 56.1 | 72.2 |
| 5.4 | 60.4 |
| 3.2 | 61.3 |
| 3.7 | 70.2 |
| 6.0 | 69.5 |
| 90.2 | 65.3 |
| 6.1 | 64.6 |
| 3.7 | 68.2 |
| 33.0 | 65.9 |
| 4.2 | 70.2 |
| 4.9 | 70.7 |
| 4.1 | 63.1 |
| 4.5 | 59.7 |
| 74.0 | 71.3 |
| 2.6 | 60.3 |
| 68.2 | 55.8 |
| 3.9 | 69.5 |
| 3.9 | 73.1 |
| 4.5 | 72.1 |
| 81.9 | 67.5 |
| 88.6 | 67.9 |
| 4.2 | 68.4 |
| 64.2 | 56.4 |
| 4.1 | 72 |
| 4.9 | 68.1 |
| 15.4 | 49.9 |
| 5.4 | 72.2 |
| 2.9 | 67.8 |
| 2.9 | 65.9 |
| 4.0 | 71.1 |
| 68.5 | 69 |
| 4.3 | 62.6 |
| 13.0 | 62.9 |
| 84.6 | 71 |
| 3.3 | 64 |
| 4.7 | 70.6 |
| 3.3 | 61.4 |
| 74.1 | 72.2 |
| 5.8 | 64.4 |
| 6.7 | 70.8 |
| 5.7 | 70.7 |
| 2.0 | 67.2 |
| 3.0 | 61.8 |
| 3.9 | 57.9 |
| 4.2 | 65.7 |
| 3.0 | 68 |
| 71.1 | 50.5 |
| 4.9 | 63.6 |
| 3.9 | 57.2 |
| 4.2 | 70.1 |
| 12.1 | 57.5 |
| 399.4 | 67.2 |
| 67.4 | 64.8 |
| 7.4 | 65.1 |
| 44.7 | 70.8 |
| 91.6 | 55.2 |
| 6.1 | 69.3 |
| 5.4 | 61.1 |
| 4.6 | 59.9 |
| 4.1 | 70.7 |
| 4.2 | 61.3 |
| 5.4 | 70.5 |
| 4.5 | 64.4 |
| 42.9 | 64 |
| 4.8 | 61.9 |
| 6.4 | 62 |
| 30.6 | 69.4 |
| 106.9 | 68.4 |
| 83.6 | 68.2 |
| 79.2 | 67.6 |
| 4.9 | 65.6 |
| 2.7 | 71.2 |
| 3.8 | 69.7 |
| 4.3 | 63.4 |
| 4.7 | 68.4 |
| 4.3 | 68.8 |
| 5.3 | 72.4 |
| 71.9 | 65.3 |
| 5.8 | 69.7 |
| 85.1 | 70.6 |
| 5.4 | 60.7 |
| 80.5 | 71.4 |
| 56.0 | 66.3 |
| 64.5 | 70.6 |
| 4.4 | 68.1 |
| 70.7 | 72.1 |
| 4.3 | 62.3 |
| 4.1 | 60.7 |
| 32.7 | 72.5 |
| 6.3 | 70.3 |
| 3.2 | 63.5 |
| 4.7 | 65.8 |
| 26.6 | 62.7 |
| 3.6 | 62 |
| 4.5 | 70.1 |
| 78.2 | 70.2 |
| 4.0 | 64.8 |
| 36.0 | 72 |
| 5.2 | 61.8 |
| 4.3 | 60.4 |
| 5.9 | 63.3 |
| 3.7 | 63.9 |
| 4.1 | 56.3 |
| 4.4 | 72.2 |
| 4.6 | 56.1 |
| 3.6 | 64.4 |
| 3.3 | 72.3 |
| 3.7 | 65.7 |
| 69.0 | 66.1 |
| 3.4 | 73.7 |
| 2.5 | 64.4 |
| 107.2 | 71.4 |
| 5.2 | 68.4 |
| 3.6 | 61.5 |
| 5.7 | 68.7 |
| 5.3 | 70 |
| 3.8 | 69.1 |
| 3.9 | 62.7 |
| 134.6 | 68.8 |
| 5.4 | 65 |
| 4.8 | 72 |
| 4.3 | 64.5 |
| 4.4 | 64 |
| 4.9 | 65.1 |
| 10.0 | 66.3 |
| 4.7 | 61.8 |
| 4.8 | 67.9 |
| 3.7 | 64.7 |
| 4.5 | 64 |
| 5.4 | 62.8 |
| 3.9 | 64 |
| 5.0 | 68.5 |
| 4.9 | 68.9 |
| 67.6 | 57.8 |
| 4.9 | 70.4 |
| 3.7 | 70.1 |
| 3.1 | 69.9 |
| 5.6 | 42.7 |
| 3.1 | 59.6 |
| 7.0 | 66.4 |
| 5.2 | 63.4 |
| 69.7 | 68.7 |
| 3.8 | 72 |
| 3.4 | 68.8 |
| 69.9 | 73.8 |
| 3.6 | 65.4 |
| 3.4 | 62.1 |
| 5.3 | 62.5 |
| 6.1 | 71.3 |
| 4.9 | 68.3 |
| 5.7 | 72.8 |
| 4.8 | 69.7 |
| 83.4 | 67.8 |
| 2.7 | 65 |
| 3.4 | 63.7 |
| 3.1 | 67.4 |
| 71.6 | 66.4 |
| 4.5 | 72.3 |
| 2.9 | 61 |
| 4.0 | 70.1 |
| 3.6 | 60.4 |
| 30.4 | 72.9 |
| 3.3 | 65.7 |
| 92.5 | 68.4 |
| 5.1 | 70.7 |
| 4.7 | 70 |
| 70.1 | 72.8 |
| 60.0 | 56.2 |
| 4.8 | 68.7 |
| 26.8 | 50.1 |
| 6.5 | 61.1 |
| 3.0 | 68 |
| 82.6 | 69.4 |
| 72.9 | 70.2 |
| 67.6 | 66.4 |
| 3.4 | 66.3 |
| 5.8 | 69.5 |
| 3.9 | 71.5 |
| 5.8 | 69.8 |
| 74.4 | 66.1 |
| 5.2 | 62.9 |
| 5.7 | 68 |
| 4.4 | 62.1 |
| 2.6 | 68.7 |
| 7.1 | 66.4 |
| 5.7 | 62.1 |
| 22.6 | 50.1 |
| 3.8 | 67.2 |
| 4.7 | 69.2 |
| 3.8 | 72 |
| 4.7 | 51.3 |
| 89.5 | 69.5 |
| 6.7 | 60.5 |
| 4.8 | 61.8 |
| 5.1 | 71.7 |
| 3.4 | 63.9 |
| 14.2 | 64.5 |
| 4.6 | 68.6 |
| 4.6 | 60.9 |
| 2.7 | 70.8 |
| 6.8 | 71.3 |
| 79.1 | 67.9 |
| 4.5 | 62.7 |
| 74.5 | 69.9 |
| 4.2 | 61.9 |
| 4.0 | 60.7 |
| 4.2 | 72.3 |
| 3.4 | 65.9 |
| 3.7 | 61.4 |
| 5.6 | 67.7 |
| 5.9 | 69.9 |
| 5.1 | 61.9 |
| 84.8 | 67.7 |
| 3.8 | 53.9 |
| 5.9 | 69.6 |
| 5.4 | 64.4 |
| 4.6 | 69.2 |
| 4.2 | 58.2 |
| 4.3 | 66.1 |
| 5.5 | 51.7 |
| 6.2 | 59.1 |
| 5.5 | 70.1 |
| 81.7 | 70.7 |
| 4.2 | 66.2 |
| 5.5 | 66.6 |
| 2.8 | 63.9 |
| 3.1 | 66.6 |
| 3.6 | 69.6 |
| 4.1 | 65.6 |
| 10.6 | 64.4 |
| 84.9 | 68 |
| 3.7 | 67.1 |
| 4.4 | 61 |
| 4.0 | 62.6 |
| 4.8 | 68.7 |
| 3.3 | 72.7 |
| 3.8 | 70.9 |
| 2.6 | 64.2 |
| 2.4 | 68.6 |
| 4.7 | 71.4 |
| 4.1 | 71.2 |
| 3.9 | 70.9 |
| 4.2 | 71.1 |
| 4.1 | 64.1 |
| 4.8 | 59.7 |
| 3.1 | 70.2 |
| 3.4 | 63.8 |
| 3.5 | 65.7 |
| 4.8 | 60.3 |
| 5.7 | 68 |
| 3.6 | 63.3 |
| 4.6 | 62.7 |
| 45.0 | 60.5 |
| 3.7 | 70 |
| 3.4 | 70.3 |
| 76.8 | 69.1 |
| 3.8 | 72.4 |
| 4.5 | 72 |
| 4.3 | 72.7 |
| 6.2 | 69.7 |
| 89.7 | 69.1 |
| 4.2 | 70.3 |
| 5.9 | 61.8 |
| 6.1 | 68 |
| 6.6 | 69.2 |
| 31.9 | 59.2 |
| 4.5 | 70.5 |
| 4.1 | 69.8 |
| 58.7 | 62.3 |
| 3.0 | 65.6 |
| 3.8 | 67.4 |
| 4.4 | 69.2 |
| 58.7 | 66.9 |
| 54.2 | 66 |
| 5.4 | 70.2 |
| 4.5 | 68.7 |
| 74.5 | 67.8 |
| 3.7 | 62.2 |
| 4.0 | 66.8 |
| 5.1 | 67.7 |
| 4.0 | 71.1 |
| 3.7 | 62.8 |
| 70.0 | 71.6 |
| 7.2 | 69.4 |
| 72.6 | 72 |
| 3.5 | 67.4 |
| 5.9 | 69.8 |
| 2.5 | 67.7 |
| 4.1 | 60.2 |
| 77.1 | 69.2 |
| 5.6 | 66.4 |
| 111.7 | 67 |
| 4.4 | 64.1 |
| 4.3 | 73 |
| 3.1 | 62.3 |
| 3.0 | 61.2 |
| 5.5 | 70.4 |
| 5.0 | 57.6 |
| 2.4 | 70 |
| 8.3 | 68.1 |
| 4.2 | 71.3 |
| 5.2 | 68 |
| 3.1 | 67.5 |
| 13.5 | 67.5 |
| 3.5 | 63.9 |
| 61.1 | 69.2 |
| 3.2 | 63.1 |
| 3.5 | 63.6 |
| 4.9 | 62.5 |
| 4.3 | 69.7 |
| 5.9 | 68.2 |
| 3.5 | 59.2 |
| 4.4 | 71.1 |
| 3.7 | 61.1 |
| 4.4 | 62 |
| 3.7 | 71.4 |
| 4.1 | 63.7 |
| 56.5 | 61.7 |
| 4.6 | 70.1 |
| 3.7 | 68.6 |
| 4.6 | 70.4 |
| 3.4 | 70.5 |
| 13.6 | 66.2 |
| 3.7 | 69.1 |
| 6.1 | 67 |
| 4.0 | 61.2 |
| 4.1 | 55.4 |
| 4.8 | 68.9 |
| 3.0 | 63.4 |
| 5.0 | 66.3 |
| 4.3 | 68.1 |
| 6.8 | 64.1 |
| 4.5 | 72.8 |
| 4.1 | 56.6 |
| 76.9 | 71.7 |
| 6.1 | 63 |
| 5.4 | 63.3 |
| 101.4 | 69.1 |
| 4.2 | 70.9 |
| 25.0 | 68.9 |
| 2.9 | 69.3 |
| 62.7 | 65.2 |
| 2.9 | 68 |
| 3.7 | 70.4 |
| 10.7 | 70.8 |
| 7.0 | 61.4 |
| 69.6 | 66.2 |
| 2.8 | 63.2 |
| 5.1 | 64.4 |
| 52.5 | 54.4 |
| 5.7 | 60.2 |
| 8.0 | 58.2 |
| 5.3 | 68.3 |
| 5.2 | 69.5 |
| 87.3 | 71.1 |
| 4.0 | 60.9 |
| 3.4 | 63.7 |
| 3.7 | 65.1 |
| 5.1 | 74.9 |
| 6.9 | 72.8 |
| 76.2 | 68.1 |
| 81.9 | 70.8 |
| 5.0 | 65.7 |
| 4.1 | 68.9 |
| 3.9 | 72.7 |
| 2.7 | 70.9 |
| 4.3 | 65.1 |
| 3.6 | 66.5 |
| 7.3 | 66 |
| 4.2 | 71.5 |
| 3.9 | 71.9 |
| 4.3 | 59.8 |
| 4.1 | 49.4 |
| 3.7 | 64.3 |
| 8.3 | 68.1 |
| 8.5 | 61.9 |
| 4.0 | 56.6 |
| 3.4 | 62.9 |
| 8.5 | 70.2 |
| 4.3 | 66.4 |
| 3.7 | 72.5 |
| 7.3 | 66.6 |
| 3.9 | 71 |
| 4.0 | 71.5 |
| 1.8 | 68.8 |
| 4.0 | 65.1 |
| 5.4 | 69 |
| 4.2 | 71.8 |
| 4.6 | 71.6 |
| 65.2 | 65.7 |
| 2.8 | 62.3 |
| 3.8 | 72.5 |
| 5.0 | 64.6 |
| 4.4 | 68.9 |
| 5.1 | 68.1 |
| 3.1 | 66.2 |
| 3.7 | 67.5 |
| 5.2 | 62.3 |
| 4.8 | 67 |
| 5.8 | 66.8 |
| 9.2 | 68.3 |
| 4.2 | 69.2 |
| 4.7 | 66 |
| 3.5 | 71.8 |
| 4.2 | 62.3 |
| 55.3 | 70.3 |
| 2.7 | 70.9 |
| 83.6 | 63.5 |
| 5.5 | 64.3 |
| 3.0 | 63.7 |
| 68.7 | 45.4 |
| 6.6 | 66.3 |
| 5.7 | 68.1 |
| 4.7 | 61.7 |
| 69.4 | 69.4 |
| 5.2 | 72.4 |
| 4.5 | 62.3 |
| 5.6 | 70 |
| 4.9 | 74.1 |
| 60.3 | 68.1 |
| 5.4 | 67.3 |
| 4.0 | 72.2 |
| 4.1 | 58.6 |
| 4.1 | 61.3 |
| 78.1 | 69.5 |
| 3.8 | 61.6 |
| 2.9 | 69.3 |
| 3.6 | 64.1 |
| 4.4 | 70.2 |
| 4.6 | 72.7 |
| 7.2 | 68 |
| 75.7 | 69.9 |
| 28.0 | 71.8 |
| 4.4 | 61.7 |
| 3.0 | 69.2 |
| 3.6 | 65.7 |
| 3.5 | 63.8 |
| 5.1 | 56.8 |
| 5.5 | 68.8 |
| 4.4 | 58.4 |
| 5.1 | 64.3 |
| 4.3 | 74 |
| 4.6 | 56 |
| 78.0 | 67.9 |
| 5.9 | 66.2 |
| 4.1 | 70.9 |
| 2.8 | 60.1 |
| 41.5 | 69.6 |
| 3.6 | 59.8 |
| 4.1 | 69.1 |
| 5.7 | 68.6 |
| 6.0 | 69.2 |
| 3.9 | 71.1 |
| 78.3 | 67.4 |
| 3.5 | 68.6 |
| 4.6 | 62.5 |
| 5.6 | 68.6 |
| 5.0 | 69.9 |
| 4.4 | 71.4 |
| 2.8 | 63.7 |
| 3.2 | 64.6 |
| 3.1 | 70.6 |
| 5.3 | 70 |
| 5.0 | 69.2 |
| 2.7 | 69.1 |
| 24.1 | 72 |
| 2.8 | 69.9 |
| 4.3 | 61.8 |
| 2.9 | 54.5 |
| 3.0 | 71.2 |
| 5.1 | 62.4 |
| 37.8 | 65.2 |
| 2.5 | 64.9 |
| 5.3 | 69.4 |
| 4.4 | 70.1 |
| 74.1 | 68.6 |
| 3.1 | 64.1 |
| 3.5 | 61.1 |
| 3.6 | 68.5 |
| 46.8 | 59.6 |
| 64.0 | 68.4 |
| 7.8 | 69.3 |
| 3.0 | 44 |
| 5.3 | 68.4 |
| 3.2 | 69 |
| 5.1 | 68.9 |
| 6.6 | 69.7 |
| 3.0 | 69.8 |
| 57.5 | 68.8 |
| 3.0 | 72 |
| 4.1 | 58.6 |
| 4.3 | 61.8 |
| 2.8 | 71.9 |
| 5.0 | 65.6 |
| 13.0 | 67.3 |
| 3.8 | 65.6 |
| 4.3 | 61.4 |
| 57.9 | 72 |
| 5.0 | 60.8 |
| 6.2 | 71.6 |
| 7.0 | 69.3 |
| 4.3 | 52.7 |
| 5.0 | 68.3 |
| 3.7 | 64.1 |
| 6.5 | 55.8 |
| 2.5 | 70.3 |
| 63.4 | 66.9 |
| 3.0 | 62.8 |
| 7.9 | 69.7 |
| 4.1 | 63.8 |
| 4.3 | 66.9 |
| 4.9 | 68.3 |
| 5.4 | 72.7 |
| 5.1 | 67.1 |
| 58.4 | 69.7 |
| 4.2 | 62.4 |
| 2.2 | 49.1 |
| 3.4 | 69.8 |
| 6.3 | 70.8 |
| 4.3 | 63.2 |
| 5.0 | 71 |
| 71.8 | 71.2 |
| 4.3 | 69 |
| 4.0 | 72.6 |
| 4.4 | 66.8 |
| 9.0 | 62.6 |
| 3.3 | 66 |
| 77.5 | 70.4 |
| 62.3 | 71.7 |
| 3.9 | 68 |
| 5.1 | 65.8 |
| 4.9 | 72.4 |
| 3.0 | 57.4 |
| 4.3 | 74 |
| 3.4 | 68.1 |
| 41.9 | 60.4 |
| 4.8 | 71.3 |
| 6.5 | 73.1 |
| 3.8 | 69.4 |
| 4.6 | 71.4 |
| 3.7 | 56.5 |
| 3.5 | 64.2 |
| 14.8 | 68.9 |
| 13.4 | 70.8 |
| 65.0 | 65.9 |
| 77.9 | 66.6 |
| 3.1 | 69.5 |
| 3.8 | 64.4 |
| 6.0 | 67.8 |
| 4.0 | 71.3 |
| 4.5 | 69 |
| 6.4 | 68.2 |
| 3.1 | 70.8 |
| 4.6 | 68.5 |
| 4.6 | 67.8 |
| 6.2 | 73.1 |
| 5.0 | 72 |
| 6.4 | 66.8 |
| 3.9 | 71.5 |
| 2.6 | 69.6 |
| 4.0 | 64.4 |
| 3.6 | 70.3 |
| 2.8 | 64 |
| 2.8 | 62.7 |
| 4.6 | 68.5 |
| 92.1 | 70 |
| 3.2 | 62.9 |
| 5.3 | 66.7 |
| 3.8 | 64.8 |
| 5.0 | 68.7 |
| 2.6 | 70.9 |
| 40.3 | 70.1 |
| 4.4 | 61.4 |
| 4.7 | 63.6 |
| 4.5 | 72.5 |
| 5.1 | 70.3 |
| 61.4 | 71.2 |
| 21.5 | 53.3 |
| 3.2 | 61.9 |
| 5.1 | 68.2 |
| 5.4 | 73 |
| 4.2 | 72.5 |
| 3.7 | 70.3 |
| 58.7 | 66.8 |
| 69.0 | 68.6 |
| 83.3 | 70.6 |
| 3.9 | 67.5 |
| 8.5 | 66.7 |
| 2.6 | 68.9 |
| 3.7 | 60.6 |
| 5.1 | 71.3 |
| 76.8 | 69.6 |
| 3.6 | 67.6 |
| 3.2 | 69 |
| 4.0 | 63.5 |
| 79.0 | 69.4 |
| 67.7 | 55.7 |
| 2.4 | 63.7 |
| 3.0 | 70.6 |
| 65.0 | 61.7 |
| 4.0 | 57.7 |
| 5.4 | 58.4 |
| 3.5 | 71.3 |
| 95.3 | 71.8 |
| 4.4 | 70.7 |
| 4.0 | 68.4 |
| 4.4 | 70.3 |
| 3.6 | 67.6 |
| 3.8 | 68.3 |
| 4.7 | 66.1 |
| 3.7 | 60.8 |
| 5.3 | 68.4 |
| 3.9 | 69.2 |
| 3.9 | 62.7 |
| 4.0 | 68.1 |
| 3.7 | 56.5 |
| 6.5 | 71.4 |
| 55.9 | 68.7 |
| 6.1 | 64.2 |
| 60.9 | 63.2 |
| 4.1 | 74.5 |
| 4.3 | 69.3 |
| 10.1 | 68.6 |
| 6.0 | 71.4 |
| 3.3 | 65.9 |
| 16.3 | 67.7 |
| 6.3 | 62.7 |
| 4.6 | 62.1 |
| 3.1 | 69.8 |
| 4.7 | 66.3 |
| 3.1 | 71.4 |
| 3.9 | 69.5 |
| 4.1 | 71.3 |
| 4.6 | 68.3 |
| 3.3 | 62.7 |
| 20.5 | 69 |
| 4.4 | 72.5 |
| 5.1 | 66.6 |
| 40.4 | 66.3 |
| 2.5 | 62.2 |
| 5.0 | 70.6 |
| 3.6 | 65.1 |
| 5.4 | 58 |
| 8.1 | 65.6 |
| 5.1 | 65.7 |
| 5.1 | 71.1 |
| 5.2 | 69 |
| 3.9 | 72.7 |
| 3.5 | 65.2 |
| 5.0 | 69.2 |
| 3.7 | 69.7 |
| 4.8 | 62.1 |
| 46.5 | 68.8 |
| 66.0 | 71.2 |
| 3.4 | 71.8 |
| 3.4 | 73.6 |
| 4.9 | 65.3 |
| 103.8 | 66.4 |
| 3.4 | 69.8 |
| 63.5 | 70 |
| 3.9 | 62.9 |
| 5.7 | 71.7 |
| 38.0 | 69.3 |
| 5.1 | 65.1 |
| 4.7 | 65.9 |
| 3.2 | 63.8 |
| 5.3 | 61.5 |
| 52.4 | 63.5 |
| 2.6 | 68.6 |
| 2.7 | 60.8 |
| 2.6 | 63.1 |
| 45.3 | 72.5 |
| 2.8 | 65.6 |
| 3.0 | 59.9 |
| 3.8 | 61.6 |
| 3.1 | 65.2 |
| 3.8 | 69.2 |
| 5.2 | 63.7 |
| 4.0 | 62.3 |
| 3.5 | 63.8 |
| 73.0 | 72.8 |
| 3.7 | 71.9 |
| 6.0 | 59.4 |
| 4.6 | 62.8 |
| 3.9 | 71.1 |
| 4.3 | 70 |
| 140.9 | 67.9 |
| 3.5 | 65.5 |
| 7.5 | 64.8 |
| 57.2 | 64.6 |
| 4.4 | 60.3 |
| 6.3 | 68 |
| 3.8 | 64.1 |
| 3.4 | 70.1 |
| 72.6 | 66.3 |
| 97.2 | 68.3 |
| 4.7 | 74.5 |
| 45.0 | 65.1 |
| 3.4 | 62.8 |
| 73.2 | 70.4 |
| 4.4 | 68.5 |
| 3.1 | 55 |
| 76.0 | 66.6 |
| 3.1 | 63.7 |
| 5.6 | 64.8 |
| 3.9 | 64.1 |
| 7.4 | 55 |
| 3.2 | 68.1 |
| 70.1 | 67.7 |
| 3.7 | 65.5 |
| 2.5 | 58.4 |
| 6.5 | 72.4 |
| 3.5 | 71 |
| 4.9 | 64.4 |
| 29.3 | 71 |
| 6.0 | 70.3 |
| 4.5 | 71.6 |
| 98.8 | 69 |
| 7.8 | 70.2 |
| 1.7 | 61.3 |
| 3.9 | 59 |
| 4.6 | 64.9 |
| 3.9 | 72.2 |
| 27.1 | 68.5 |
| 4.3 | 66.3 |
| 4.7 | 72.3 |
| 54.8 | 66.5 |
| 4.1 | 61.1 |
| 70.2 | 63.7 |
| 5.6 | 65.9 |
| 5.6 | 67.6 |
| 5.8 | 55.4 |
| 5.7 | 66.4 |
| 2.5 | 69.6 |
| 2.9 | 67.5 |
| 4.2 | 51.9 |
| 52.9 | 72.3 |
| 44.9 | 70.4 |
| 66.0 | 74.5 |
| 70.9 | 68.4 |
| 3.9 | 70.7 |
| 62.2 | 58.6 |
| 4.2 | 68.8 |
| 45.8 | 56.9 |
| 7.2 | 60.8 |
| 4.3 | 66 |
| 3.6 | 59.5 |
| 5.4 | 66.9 |
| 4.3 | 68.9 |
| 3.8 | 69.5 |
| 24.2 | 53.8 |
| 4.5 | 68.9 |
| 6.0 | 70.3 |
| 3.3 | 63 |
| 8.3 | 64.2 |
| 61.1 | 72.7 |
| 3.8 | 73.6 |
| 34.2 | 53 |
| 69.4 | 70.9 |
| 4.0 | 69.8 |
| 4.2 | 71.5 |
| 5.6 | 62.2 |
| 59.4 | 69.7 |
| 61.8 | 67.7 |
| 3.7 | 71.9 |
| 6.5 | 69.9 |
| 4.7 | 66.1 |
| 2.7 | 67.9 |
| 4.7 | 56.9 |
| 3.6 | 70.4 |
| 3.5 | 65.8 |
| 37.3 | 69.1 |
| 6.6 | 70.3 |
| 3.3 | 68.9 |
| 2.6 | 66.4 |
| 5.4 | 59 |
| 3.3 | 66.6 |
| 4.9 | 63.5 |
| 64.7 | 67.5 |
| 3.1 | 61.9 |
| 3.7 | 59.9 |
| 5.3 | 70.3 |
| 4.2 | 70.3 |
| 83.1 | 62.5 |
| 3.4 | 69.1 |
| 2.3 | 68.9 |
| 5.0 | 57.2 |
| 2.3 | 65.7 |
| 88.8 | 67.6 |
| 64.3 | 71.3 |
| 3.9 | 67.8 |
| 3.8 | 61.8 |
| 4.7 | 66.7 |
| 6.0 | 67.6 |
| 4.5 | 70.1 |
| 3.9 | 69.3 |
| 3.6 | 63.8 |
| 3.8 | 65.9 |
| 4.7 | 70.2 |
| 4.4 | 70.8 |
| 3.1 | 61.1 |
| 72.2 | 71.6 |
| 184.9 | 66.1 |
| 57.9 | 67.6 |
| 6.1 | 63.4 |
| 2.6 | 61 |
| 3.4 | 69.4 |
| 3.8 | 67.4 |
| 4.7 | 66.4 |
| 3.5 | 74.6 |
| 4.1 | 70 |
| 4.4 | 69.2 |
| 8.5 | 61 |
| 85.3 | 68 |
| 3.5 | 70.6 |
| 3.4 | 65.7 |
| 4.9 | 60.3 |
| 2.9 | 62.3 |
| 3.5 | 69.6 |
| 2.4 | 69.2 |
| 8.4 | 69 |
| 3.9 | 65.4 |
| 5.4 | 67 |
| 5.7 | 70.9 |
| 75.6 | 72.1 |
| 3.7 | 60.7 |
| 3.2 | 71.4 |
| 4.8 | 66.5 |
| 4.7 | 64.7 |
| 17.7 | 66.7 |
| 4.1 | 67.8 |
| 5.0 | 67.4 |
| 5.6 | 61.2 |
| 5.9 | 73.2 |
| 3.4 | 69.1 |
| 3.3 | 61.4 |
| 3.0 | 64.8 |
| 4.9 | 62.9 |
| 77.1 | 68.1 |
| 3.4 | 69.6 |
| 10.0 | 67.9 |
| 4.1 | 62.4 |
| 2.9 | 68.2 |
| 54.5 | 66.4 |
| 2.9 | 70.1 |
| 4.0 | 67 |
| 2.3 | 61 |
| 4.9 | 63.4 |
| 3.3 | 62.8 |
| 9.1 | 67.8 |
| 3.5 | 71.8 |
| 5.4 | 72.2 |
| 5.3 | 69.1 |
| 5.5 | 69.8 |
| 4.8 | 68.5 |
| 4.3 | 72.4 |
| 52.7 | 71.7 |
| 4.1 | 61 |
| 67.7 | 71.2 |
| 4.1 | 59.5 |
| 6.3 | 69.8 |
| 2.3 | 61.3 |
| 5.5 | 69.7 |
| 69.1 | 71.6 |
| 3.6 | 71.7 |
| 4.9 | 71.2 |
| 70.3 | 66.7 |
| 4.1 | 71.3 |
| 4.0 | 62.3 |
| 2.3 | 69.4 |
| 4.0 | 73.4 |
| 25.1 | 67.3 |
| 4.0 | 74 |
| 4.6 | 64.7 |
| 3.8 | 69.4 |
| 9.9 | 67 |
| 4.6 | 71.6 |
| 5.5 | 62 |
| 66.9 | 71.5 |
| 3.6 | 68.8 |
| 78.2 | 64.3 |
| 4.7 | 70.1 |
| 2.2 | 65.8 |
| 76.4 | 52.3 |
| 66.4 | 60 |
| 8.0 | 65 |
| 6.1 | 68.3 |
| 6.4 | 67 |
| 6.9 | 66.9 |
| 62.3 | 68 |
| 2.9 | 70 |
| 3.7 | 71.3 |
| 2.3 | 62.8 |
| 4.3 | 65.6 |
| 3.2 | 63.3 |
| 4.2 | 71.3 |
| 13.8 | 63.5 |
| 4.7 | 70.9 |
| 4.3 | 71.4 |
| 4.1 | 66.5 |
| 2.1 | 71 |
| 3.8 | 71.4 |
| 17.2 | 69 |
| 3.9 | 71.2 |
| 4.5 | 73 |
| 3.2 | 69.1 |
| 6.1 | 67.1 |
| 6.7 | 65.9 |
| 4.6 | 69.5 |
| 3.9 | 71.2 |
| 2.8 | 70.5 |
| 45.3 | 70 |
| 4.7 | 68.7 |
| 4.5 | 62.3 |
| 1.7 | 64.2 |
| 3.0 | 69.4 |
| 4.0 | 70.4 |
| 63.3 | 69.3 |
| 5.0 | 62.1 |
| 4.8 | 70.6 |
| 3.9 | 66.1 |
| 60.6 | 66.1 |
| 2.4 | 68.1 |
| 62.0 | 66.3 |
| 4.7 | 68.7 |
| 4.5 | 70.6 |
| 45.8 | 68.7 |
| 4.2 | 64.9 |
| 5.3 | 60.8 |
| 3.8 | 67.2 |
| 4.0 | 57.4 |
| 4.2 | 63.5 |
| 2.7 | 69.5 |
| 6.1 | 64.3 |
| 5.1 | 63.1 |
| 2.9 | 71.2 |
| 118.6 | 67.3 |
| 3.9 | 64.5 |
| 102.7 | 66.6 |
| 5.6 | 69 |
| 5.3 | 69.3 |
| 3.1 | 63.9 |
| 2.6 | 59.7 |
| 4.6 | 70 |
| 4.9 | 69.7 |
| 13.3 | 54.5 |
| 4.9 | 56.8 |
| 68.2 | 66.4 |
| 117.7 | 66.3 |
| 85.7 | 66.8 |
| 2.4 | 62.4 |
| 5.1 | 74.4 |
| 4.2 | 73.7 |
| 21.3 | 69.2 |
| 4.7 | 65.5 |
| 4.7 | 68.4 |
| 4.0 | 70.2 |
| 64.9 | 70 |
| 61.0 | 60.6 |
| 3.3 | 63.9 |
| 3.6 | 71 |
| 3.5 | 62.9 |
| 4.2 | 63.5 |
| 4.1 | 61.2 |
| 148.1 | 54.2 |
| 4.4 | 64.6 |
| 2.3 | 63.1 |
| 3.7 | 64.3 |
| 80.2 | 66.9 |
| 3.7 | 68.7 |
| 3.7 | 69.1 |
| 10.6 | 69.2 |
| 2.9 | 63.4 |
| 69.8 | 68.5 |
| 4.9 | 67 |
| 6.7 | 68 |
| 64.5 | 71.1 |
| 4.6 | 69.5 |
| 4.9 | 71.7 |
| 47.8 | 67 |
| 5.5 | 70 |
| 3.4 | 64.7 |
| 64.9 | 66.2 |
| 3.7 | 60.8 |
| 78.3 | 70.4 |
| 1.9 | 63.4 |
| 3.8 | 68.6 |
| 3.0 | 63 |
| 83.6 | 67 |
| 63.9 | 67.7 |
| 3.7 | 69.6 |
| 3.3 | 60 |
| 25.1 | 69.9 |
| 5.6 | 59.5 |
| 5.0 | 70.7 |
| 5.8 | 66.5 |
| 3.8 | 70.4 |
| 3.8 | 72.1 |
| 3.8 | 69.4 |
| 7.2 | 69 |
| 4.3 | 61.4 |
| 5.5 | 71.5 |
| 2.8 | 64.5 |
| 4.7 | 69.5 |
| 4.4 | 72.6 |
| 4.2 | 62 |
| 4.6 | 71.5 |
| 108.9 | 66 |
| 1.8 | 60.6 |
| 3.0 | 61.2 |
| 3.9 | 72.2 |
| 5.3 | 73.6 |
| 18.6 | 67.7 |
| 64.5 | 64.8 |
| 4.2 | 69.5 |
| 1.5 | 49.1 |
| 59.2 | 70.3 |
| 3.9 | 66.3 |
| 3.8 | 62.6 |
| 7.8 | 64.5 |
| 64.4 | 68.5 |
| 4.2 | 71.9 |
| 3.7 | 69.6 |
| 5.7 | 66.2 |
| 4.1 | 65.2 |
| 4.4 | 65.8 |
| 4.4 | 72.6 |
| 3.9 | 63.3 |
| 5.0 | 70.8 |
| 66.3 | 67.7 |
| 4.0 | 69.9 |
| 4.0 | 62.3 |
| 3.8 | 64 |
| 3.2 | 50.6 |
| 3.6 | 73.7 |
| 77.5 | 72 |
| 4.5 | 71.5 |
| 3.9 | 71.6 |
| 5.0 | 71 |
| 5.4 | 60.1 |
| 11.9 | 66.4 |
| 1.9 | 70.9 |
| 4.7 | 63.2 |
| 62.9 | 60.2 |
| 5.2 | 70.4 |
| 3.7 | 63.5 |
| 2.9 | 69.4 |
| 19.1 | 69.8 |
| 58.7 | 64.9 |
| 4.4 | 68.2 |
| 70.4 | 67.3 |
| 2.9 | 71.2 |
| 2.8 | 67.5 |
| 2.8 | 68.4 |
| 3.1 | 72.4 |
| 2.3 | 72 |
| 32.9 | 66.9 |
| 3.6 | 69.1 |
| 3.6 | 69.7 |
| 4.4 | 70.3 |
| 4.9 | 59.2 |
| 4.9 | 67.7 |
| 3.5 | 71.4 |
| 2.9 | 67.8 |
| 8.7 | 65.8 |
| 3.1 | 71 |
| 61.9 | 66.6 |
| 2.8 | 61 |
| 6.2 | 69.4 |
| 3.2 | 69.3 |
| 7.5 | 70.5 |
| 2.4 | 63.3 |
| 40.8 | 68.2 |
| 5.5 | 67 |
| 5.3 | 71 |
| 3.5 | 72.2 |
| 3.7 | 71.6 |
| 32.7 | 71.2 |
| 5.5 | 62.6 |
| 4.9 | 67.1 |
| 3.7 | 59.9 |
| 4.6 | 69.7 |
| 83.5 | 47.7 |
| 4.0 | 65.3 |
| 109.3 | 66.5 |
| 69.4 | 69.1 |
| 19.4 | 68.6 |
| 7.3 | 67.4 |
| 4.2 | 67.1 |
| 4.0 | 72.5 |
| 4.9 | 60.2 |
| 6.1 | 66.6 |
| 5.7 | 70 |
| 4.3 | 57.9 |
| 3.9 | 72.3 |
| 4.5 | 70.8 |
| 6.1 | 65.3 |
| 38.7 | 71 |
| 4.4 | 68 |
| 3.0 | 63.4 |
| 2.7 | 67.6 |
| 3.5 | 65.5 |
| 52.7 | 64.2 |
| 47.7 | 58.4 |
| 5.1 | 68.5 |
| 65.2 | 66.7 |
| 4.2 | 68.9 |
| 8.4 | 69.9 |
| 14.4 | 73.9 |
| 10.8 | 60.1 |
| 34.8 | 55.4 |
| 4.8 | 63.2 |
| 4.5 | 73.2 |
| 3.7 | 67.8 |
| 63.4 | 64.2 |
| 79.1 | 70 |
| 4.9 | 71.6 |
| 2.6 | 68.2 |
| 5.2 | 68.2 |
| 3.6 | 68.7 |
| 5.3 | 69.6 |
| 39.4 | 64.9 |
| 6.0 | 70 |
| 5.3 | 66.7 |
| 5.1 | 69 |
| 3.4 | 65.6 |
| 3.8 | 69.9 |
| 6.0 | 65.5 |
| 3.1 | 68 |
| 25.6 | 68.2 |
| 62.9 | 68.5 |
| 4.6 | 54.5 |
| 2.0 | 72.1 |
| 3.0 | 72.6 |
| 3.1 | 69.4 |
| 5.7 | 64 |
| 3.0 | 68.9 |
| 49.4 | 56.8 |
| 22.7 | 68.5 |
| 4.7 | 69.6 |
| 4.5 | 69.7 |
| 72.1 | 68.9 |
| 2.1 | 68.2 |
| 4.3 | 70.7 |
| 3.8 | 67.4 |
| 3.2 | 67.9 |
| 4.6 | 69.2 |
| 47.2 | 67.8 |
| 56.4 | 64.8 |
| 76.7 | 69.4 |
| 6.5 | 51.1 |
| 2.9 | 69 |
| 3.6 | 60.8 |
| 89.6 | 64.9 |
| 3.9 | 68.7 |
| 3.5 | 63.7 |
| 2.1 | 67.8 |
| 3.9 | 71.6 |
| 3.4 | 66.3 |
| 4.8 | 69.2 |
| 5.7 | 68.7 |
| 3.7 | 66.1 |
| 4.0 | 62.7 |
| 8.6 | 60.4 |
| 19.3 | 74.3 |
| 62.4 | 69 |
| 2.9 | 71.5 |
| 6.4 | 45 |
| 4.2 | 67.9 |
| 3.4 | 57.9 |
| 4.4 | 63.8 |
| 4.2 | 72 |
| 5.3 | 67.6 |
| 66.6 | 67.5 |
| 8.2 | 66.2 |
| 3.0 | 61.7 |
| 2.4 | 64.2 |
| 5.0 | 61.3 |
| 4.5 | 68.8 |
| 2.7 | 70.2 |
| 5.0 | 70.5 |
| 71.3 | 65.3 |
| 4.4 | 70.4 |
| 4.2 | 71.5 |
| 2.4 | 68.9 |
| 5.9 | 45.6 |
| 2.4 | 69.3 |
| 4.2 | 66.6 |
| 3.7 | 58.7 |
| 3.9 | 72.2 |
| 5.3 | 75.7 |
| 3.6 | 69.1 |
| 43.8 | 66.7 |
| 22.0 | 69.7 |
| 32.9 | 68.9 |
| 3.4 | 71.8 |
| 90.2 | 52.6 |
| 3.8 | 61.4 |
| 57.7 | 69.5 |
| 4.6 | 68.1 |
| 4.0 | 66.9 |
| 65.4 | 67.2 |
| 2.8 | 70.8 |
| 3.4 | 63.5 |
| 5.4 | 72.7 |
| 72.0 | 70.1 |
| 86.8 | 63.9 |
| 4.7 | 70.4 |
| 18.5 | 69.1 |
| 3.6 | 64.5 |
| 4.2 | 74.1 |
| 26.6 | 67.4 |
| 4.3 | 69.6 |
| 4.1 | 65.7 |
| 3.8 | 61.1 |
| 3.8 | 74.1 |
| 5.5 | 67.2 |
| 3.7 | 69.6 |
| 3.4 | 63.1 |
| 3.5 | 60.7 |
| 7.5 | 67.6 |
| 4.4 | 59.6 |
| 4.8 | 45.7 |
| 2.5 | 71.1 |
| 43.9 | 72.8 |
| 3.8 | 66.5 |
| 6.0 | 70.8 |
| 5.2 | 69.6 |
| 2.9 | 67.2 |
| 4.4 | 74.9 |
| 161.2 | 65.7 |
| 29.9 | 66.2 |
| 37.1 | 74.9 |
| 3.3 | 54 |
| 4.1 | 72.9 |
| 34.8 | 65.3 |
| 3.7 | 69.2 |
| 4.4 | 69.2 |
| 2.1 | 55.2 |
| 11.8 | 59.4 |
| 4.5 | 58.8 |
| 4.0 | 70.7 |
| 4.2 | 60.3 |
| 3.5 | 64 |
| 14.8 | 69.4 |
| 64.0 | 68.6 |
| 3.6 | 55 |
| 58.5 | 72 |
| 47.5 | 69.8 |
| 7.6 | 65.9 |
| 19.9 | 70.2 |
| 3.2 | 68.8 |
| 48.3 | 68.6 |
| 3.5 | 66.6 |
| 4.2 | 69.2 |
| 7.1 | 65.3 |
| 3.7 | 69.5 |
| 59.0 | 66.7 |
| 3.4 | 70.1 |
| 128.8 | 64.4 |
| 3.7 | 59.5 |
| 4.6 | 73.2 |
| 5.0 | 71.3 |
| 4.6 | 72.4 |
| 3.8 | 71.1 |
| 3.3 | 66.4 |
| 5.3 | 71.1 |
| 33.8 | 67.3 |
| 3.8 | 71.2 |
| 3.7 | 68.2 |
| 5.1 | 62.2 |
| 5.2 | 70.6 |
| 42.6 | 73.7 |
| 2.3 | 68.2 |
| 8.0 | 68.2 |
| 10.1 | 67.5 |
| 20.3 | 72.6 |
| 3.2 | 69.3 |
| 4.3 | 71.6 |
| 17.9 | 71.8 |
| 62.0 | 72.9 |
| 5.8 | 62.9 |
| 3.3 | 70.8 |
| 2.5 | 70.7 |
| 2.0 | 68.6 |
| 3.8 | 68.5 |
| 4.7 | 63.1 |
| 5.0 | 72.5 |
| 73.9 | 71.6 |
| 6.8 | 65.8 |
| 4.6 | 69.1 |
| 4.9 | 70.7 |
| 3.8 | 73.2 |
| 10.6 | 65.4 |
| 2.4 | 63.9 |
| 10.4 | 65.1 |
| 3.6 | 71.9 |
| 7.0 | 63.4 |
| 3.6 | 57.1 |
| 2.6 | 65.8 |
| 2.4 | 68.6 |
| 3.1 | 64.4 |
| 5.5 | 65.5 |
| 4.4 | 70.6 |
| 3.6 | 75.4 |
| 5.8 | 64.1 |
| 4.5 | 65.2 |
| 5.1 | 68.6 |
| 3.3 | 60.7 |
| 6.5 | 59.6 |
| 2.8 | 61.6 |
| 70.5 | 68.3 |
| 3.8 | 70.9 |
| 44.4 | 65.2 |
| 3.2 | 62.5 |
| 3.9 | 70.3 |
| 2.5 | 69 |
| 3.1 | 63.7 |
| 6.5 | 69.7 |
| 5.0 | 68 |
| 3.4 | 54.4 |
| 3.6 | 64.3 |
| 5.0 | 67.1 |
| 9.7 | 64 |
| 3.4 | 66.8 |
| 3.9 | 67.7 |
| 3.7 | 73.5 |
| 3.6 | 63.4 |
| 3.5 | 71.4 |
| 4.9 | 72.6 |
| 58.2 | 70.4 |
| 2.8 | 62.5 |
| 8.2 | 59.5 |
| 12.1 | 66.2 |
| 64.6 | 57.4 |
| 52.4 | 62.9 |
| 75.7 | 65.2 |
| 65.5 | 66.3 |
| 76.6 | 66.5 |
| 6.1 | 69.5 |
| 3.2 | 74.5 |
| 60.4 | 67.1 |
| 33.4 | 69.9 |
| 3.2 | 72.6 |
| 5.3 | 59.5 |
| 31.6 | 69.5 |
| 5.2 | 64.3 |
| 3.8 | 59.2 |
| 3.1 | 58.7 |
| 4.8 | 68.6 |
| 3.5 | 72 |
| 5.0 | 72.8 |
| 6.8 | 69.1 |
| 4.5 | 64.7 |
| 74.2 | 52.2 |
| 3.3 | 60.4 |
| 7.6 | 48.1 |
| 72.4 | 69.8 |
| 4.5 | 65.6 |
| 64.1 | 66.3 |
| 4.3 | 69.3 |
| 5.8 | 69.8 |
| 88.6 | 67.9 |
| 40.7 | 68.8 |
| 101.5 | 67.2 |
| 3.8 | 64.5 |
| 8.6 | 64.5 |
| 4.0 | 71.3 |
| 60.1 | 67.1 |
| 4.4 | 65.2 |
| 4.7 | 67 |
| 5.3 | 70.7 |
| 2.6 | 71.1 |
| 9.3 | 65.4 |
| 5.4 | 57.2 |
| 4.1 | 74.6 |
| 32.7 | 74.7 |
| 56.8 | 67 |
| 3.7 | 69.8 |
| 78.5 | 63.4 |
| 4.5 | 68.4 |
| 5.1 | 68.3 |
| 3.8 | 72.3 |
| 3.2 | 71.4 |
| 15.8 | 69.6 |
| 53.5 | 70 |
| 5.3 | 66.9 |
| 3.8 | 62.8 |
| 51.6 | 63.4 |
| 3.4 | 67.8 |
| 2.0 | 60.1 |
| 4.1 | 74.8 |
| 4.1 | 65.1 |
| 63.7 | 71.8 |
| 9.3 | 65 |
| 16.1 | 70.7 |
| 125.8 | 63.5 |
| 3.9 | 71.2 |
| 4.6 | 48.2 |
| 3.8 | 69.7 |
| 3.7 | 69.4 |
| 6.8 | 67.2 |
| 9.1 | 65.7 |
| 4.8 | 72.1 |
| 80.0 | 66.5 |
| 4.8 | 63.3 |
| 3.6 | 67.4 |
| 2.5 | 64.3 |
| 5.0 | 66.3 |
| 3.1 | 70.4 |
| 6.2 | 64 |
| 2.5 | 65 |
| 3.0 | 69.7 |
| 4.6 | 63.3 |
| 3.3 | 70.9 |
| 4.9 | 69.6 |
| 6.3 | 74.7 |
| 5.9 | 37.6 |
| 5.5 | 60.8 |
| 4.6 | 72.4 |
| 4.7 | 70.6 |
| 3.9 | 69.8 |
| 6.1 | 68.3 |
| 5.3 | 72 |
| 4.4 | 72.8 |
| 5.4 | 67.3 |
| 64.2 | 69 |
| 2.7 | 62.2 |
| 7.3 | 69 |
| 17.3 | 70.4 |
| 6.6 | 68.6 |
| 3.9 | 71.5 |
| 4.1 | 63.5 |
| 82.8 | 68.6 |
| 64.9 | 71.3 |
| 83.0 | 67.2 |
| 5.7 | 68.7 |
| 4.4 | 66.5 |
| 51.7 | 71.1 |
| 7.5 | 67.3 |
| 66.3 | 70.5 |
| 2.6 | 67.7 |
| 2.6 | 69.8 |
| 59.7 | 69.4 |
| 3.7 | 69.3 |
| 4.3 | 69.2 |
| 3.7 | 71.7 |
| 4.4 | 71.3 |
| 7.3 | 71.7 |
| 13.0 | 65.8 |
| 69.3 | 65.7 |
| 3.3 | 67 |
| 4.2 | 71.2 |
| 4.1 | 70 |
| 3.2 | 64.5 |
| 4.8 | 59.3 |
| 73.6 | 67.1 |
| 5.6 | 70.1 |
| 3.0 | 60.9 |
| 3.8 | 69.9 |
| 3.1 | 71.6 |
| 1.4 | 68.3 |
| 1.7 | 60.6 |
| 21.3 | 70.6 |
| 57.5 | 69.9 |
| 5.5 | 71 |
| 3.1 | 70.2 |
| 68.7 | 66.6 |
| 4.1 | 65.6 |
| 3.0 | 64.6 |
| 2.9 | 57 |
| 5.9 | 69.7 |
| 59.8 | 68 |
| 9.3 | 67.2 |
| 4.6 | 63.9 |
| 2.6 | 70.1 |
| 4.3 | 70.4 |
| 3.2 | 65.5 |
| 8.4 | 65.6 |
| 3.9 | 59.7 |
| 3.4 | 71.1 |
| 3.7 | 71.2 |
| 59.1 | 66.5 |
| 2.8 | 67.6 |
| 67.4 | 61.8 |
| 4.1 | 69.1 |
| 131.7 | 66.7 |
| 2.9 | 56.8 |
| 15.4 | 72.9 |
| 22.6 | 70.8 |
| 5.0 | 68.3 |
| 39.0 | 69.6 |
| 3.1 | 67.5 |
| 5.6 | 68.3 |
| 11.9 | 66.8 |
| 18.0 | 68.1 |
| 4.3 | 68.7 |
| 2.8 | 67.2 |
| 4.1 | 69.5 |
| 3.0 | 67.1 |
| 3.7 | 74 |
| 3.6 | 69.9 |
| 2.4 | 55.1 |
| 4.7 | 75.1 |
| 61.0 | 71.4 |
| 4.5 | 69 |
| 3.9 | 65 |
| 3.7 | 70.5 |
| 16.8 | 32.2 |
| 3.7 | 71.7 |
| 38.9 | 68.4 |
| 4.9 | 68.5 |
| 56.8 | 68.2 |
| 3.3 | 74.8 |
| 47.7 | 66.8 |
| 4.3 | 62.6 |
| 5.7 | 72.8 |
| 4.1 | 60.3 |
| 4.0 | 72 |
| 4.4 | 69.3 |
| 11.0 | 42.7 |
| 4.2 | 74 |
| 3.9 | 71.6 |
| 4.2 | 62.6 |
| 11.4 | 67.4 |
| 5.0 | 66.2 |
| 5.0 | 65 |
| 6.3 | 58 |
| 4.4 | 72.5 |
| 3.1 | 73.5 |
| 27.1 | 71.7 |
| 4.6 | 69.7 |
| 96.5 | 66.6 |
| 5.5 | 66.2 |
| 4.3 | 68.7 |
| 3.9 | 70.6 |
| 2.8 | 62.6 |
| 3.2 | 69.4 |
| 4.6 | 67.7 |
| 5.0 | 71.4 |
| 3.8 | 62.1 |
| 57.1 | 66.9 |
| 3.9 | 73.2 |
| 4.8 | 70 |
| 4.1 | 68 |
| 5.7 | 70.1 |
| 3.1 | 57.7 |
| 3.6 | 68.7 |
| 11.9 | 67 |
| 66.9 | 68 |
| 4.8 | 66.4 |
| 4.5 | 69.6 |
| 4.5 | 71.8 |
| 3.0 | 72.5 |
| 47.7 | 70.5 |
| 5.1 | 59.2 |
| 4.6 | 70.3 |
| 3.6 | 72 |
| 56.5 | 56.3 |
| 3.6 | 71 |
| 5.0 | 65.6 |
| 3.6 | 73.6 |
| 3.3 | 64.9 |
| 5.5 | 65.7 |
| 2.6 | 72.6 |
| 5.2 | 71.4 |
| 5.1 | 69.9 |
| 3.9 | 67.5 |
| 3.4 | 53.8 |
| 7.5 | 57.8 |
| 4.5 | 65 |
| 2.4 | 69.4 |
| 6.2 | 65.7 |
| 13.5 | 69.9 |
| 4.5 | 68.2 |
| 1.6 | 55.3 |
| 3.9 | 71.5 |
| 78.3 | 68.5 |
| 61.6 | 70 |
| 3.5 | 68.4 |
| 12.6 | 47.9 |
| 3.5 | 70.7 |
| 64.0 | 72.2 |
| 44.8 | 69.2 |
| 76.0 | 70.1 |
| 52.6 | 63.8 |
| 64.9 | 65.3 |
| 3.1 | 69.9 |
| 34.5 | 67.5 |
| 5.1 | 71.2 |
| 75.6 | 66 |
| 4.3 | 61.9 |
| 61.9 | 63.4 |
| 2.2 | 69.5 |
| 63.9 | 66.6 |
| 6.1 | 58.8 |
| 4.0 | 69.4 |
| 3.2 | 66.9 |
| 46.8 | 67.1 |
| 49.2 | 70.1 |
| 4.2 | 69.3 |
| 2.1 | 69.2 |
| 4.3 | 71.4 |
| 29.8 | 68.6 |
| 8.9 | 63.6 |
| 4.5 | 63.7 |
| 5.0 | 61.3 |
| 5.4 | 67.8 |
| 26.9 | 67.2 |
| 5.7 | 62.6 |
| 2.4 | 67.3 |
| 4.1 | 61.4 |
| 3.3 | 62.6 |
| 3.2 | 68 |
| 9.5 | 68.6 |
| 53.3 | 66.7 |
| 3.9 | 67.8 |
| 4.8 | 73.1 |
| 4.0 | 73.9 |
| 3.3 | 67.8 |
| 3.0 | 70.8 |
| 5.3 | 71 |
| 2.9 | 66.1 |
| 56.9 | 68.3 |
| 64.6 | 66.7 |
| 4.1 | 74.2 |
| 6.0 | 65.5 |
| 4.0 | 71.5 |
| 5.0 | 72.6 |
| 5.5 | 60.6 |
| 2.5 | 62.3 |
| 3.6 | 75.4 |
| 4.3 | 72.5 |
| 55.1 | 67.1 |
| 69.3 | 70.7 |
| 3.9 | 66.3 |
| 3.3 | 71 |
| 11.6 | 67.8 |
| 2.4 | 71.7 |
| 3.6 | 62.7 |
| 3.0 | 67.2 |
| 3.0 | 62.8 |
| 3.7 | 72.7 |
| 3.6 | 70 |
| 4.3 | 61.1 |
| 2.7 | 60.8 |
| 56.2 | 66.9 |
| 4.6 | 62.7 |
| 58.3 | 69.8 |
| 48.3 | 71.5 |
| 100.2 | 64.4 |
| 7.0 | 69.3 |
| 2.7 | 59.2 |
| 3.7 | 66.1 |
| 7.4 | 72.5 |
| 8.6 | 67 |
| 49.6 | 67.9 |
| 3.1 | 69 |
| 4.3 | 65 |
| 3.7 | 68.3 |
| 3.9 | 68.8 |
| 4.0 | 60 |
| 5.7 | 68.6 |
| 3.5 | 69.3 |
| 3.8 | 71.6 |
| 35.0 | 71.3 |
| 68.7 | 64.7 |
| 5.8 | 56.8 |
| 5.3 | 59.5 |
| 5.4 | 68.9 |
| 5.5 | 62.5 |
| 70.3 | 66.8 |
| 20.8 | 70.9 |
| 56.7 | 57.9 |
| 4.7 | 62.1 |
| 4.2 | 71.7 |
| 2.4 | 62.8 |
| 55.3 | 66.6 |
| 67.2 | 66.6 |
| 53.3 | 67.4 |
| 2.9 | 70.9 |
| 2.7 | 65.5 |
| 4.6 | 57.3 |
| 70.0 | 70 |
| 3.5 | 63.6 |
| 4.7 | 69.8 |
| 50.9 | 66 |
| 2.5 | 56.4 |
| 3.9 | 76.2 |
| 4.8 | 65.5 |
| 68.5 | 68.5 |
| 5.4 | 69.4 |
| 3.8 | 72.1 |
| 51.2 | 67.3 |
| 7.4 | 64.7 |
| 4.4 | 72.7 |
| 5.0 | 68.4 |
| 3.0 | 64.9 |
| 4.2 | 64.4 |
| 5.0 | 66.8 |
| 2.4 | 71.8 |
| 3.4 | 70 |
| 3.9 | 64.7 |
| 10.6 | 67.8 |
| 5.0 | 71.1 |
| 3.0 | 58.9 |
| 4.1 | 60.5 |
| 9.1 | 67.4 |
| 4.7 | 70 |
| 4.3 | 70.5 |
| 83.4 | 69.3 |
| 5.9 | 63.6 |
| 5.4 | 72.6 |
| 4.0 | 68.6 |
| 5.8 | 62.9 |
| 3.8 | 68.7 |
| 46.8 | 73.9 |
| 48.4 | 71.3 |
| 2.5 | 61.5 |
| 4.8 | 70.6 |
| 59.5 | 64.6 |
| 3.3 | 70.5 |
| 47.8 | 74.3 |
| 67.3 | 66.1 |
| 3.2 | 63.8 |
| 5.8 | 63.3 |
| 2.5 | 60.5 |
| 6.1 | 70.4 |
| 3.9 | 69 |
| 51.0 | 65.7 |
| 22.1 | 67.7 |
| 69.5 | 68.8 |
| 68.7 | 66.4 |
| 4.0 | 68.8 |
| 3.3 | 63.9 |
| 74.9 | 69.5 |
| 3.9 | 62.9 |
| 7.3 | 69.5 |
| 34.2 | 50.8 |
| 3.1 | 51.8 |
| 6.1 | 65.9 |
| 5.3 | 62 |
| 4.7 | 68.4 |
| 3.4 | 67.7 |
| 2.0 | 68.2 |
| 3.9 | 67.5 |
| 5.4 | 63.3 |
| 5.6 | 68.7 |
| 2.8 | 70.3 |
| 8.4 | 66.4 |
| 78.2 | 49.1 |
| 5.5 | 71.7 |
| 4.0 | 72.4 |
| 52.1 | 65.7 |
| 77.5 | 72 |
| 7.7 | 69.9 |
| 3.8 | 69.3 |
| 3.4 | 72.4 |
| 4.2 | 74.3 |
| 3.2 | 72.2 |
| 8.5 | 67.2 |
| 8.5 | 64.6 |
| 59.0 | 66.9 |
| 4.6 | 64.1 |
| 19.3 | 72.5 |
| 55.9 | 63.4 |
| 3.3 | 68.4 |
| 3.5 | 60.5 |
| 6.0 | 62.2 |
| 17.1 | 71.1 |
| 4.1 | 49 |
| 4.7 | 57.6 |
| 3.2 | 60.1 |
| 5.1 | 72.9 |
| 40.6 | 72.7 |
| 3.5 | 64.9 |
| 65.6 | 69.9 |
| 8.5 | 68.8 |
| 3.7 | 66 |
| 3.1 | 67.9 |
| 4.3 | 70.4 |
| 5.1 | 64.7 |
| 3.7 | 72.1 |
| 19.7 | 69.4 |
| 3.9 | 68.5 |
| 2.7 | 63.3 |
| 63.5 | 70.5 |
| 9.0 | 69.7 |
| 4.9 | 72.5 |
| 2.3 | 71.3 |
| 5.1 | 69.7 |
| 2.2 | 67.1 |
| 2.5 | 58.3 |
| 2.3 | 55.7 |
| 52.6 | 66 |
| 2.4 | 68.5 |
| 70.3 | 67.4 |
| 3.5 | 61.6 |
| 5.5 | 72.2 |
| 7.7 | 66.4 |
| 3.0 | 69.1 |
| 4.6 | 62.7 |
| 3.3 | 60.5 |
| 4.7 | 73.5 |
| 4.9 | 69.6 |
| 5.3 | 68.1 |
| 52.7 | 63.9 |
| 84.7 | 67.7 |
| 2.4 | 62 |
| 3.6 | 61.9 |
| 3.5 | 61.6 |
| 4.8 | 56.8 |
| 3.9 | 72 |
| 49.7 | 71.2 |
| 51.0 | 63.2 |
| 2.8 | 70.7 |
| 3.1 | 66.7 |
| 3.2 | 71.9 |
| 3.5 | 66.8 |
| 3.9 | 53.1 |
| 3.5 | 74.8 |
| 18.9 | 70.1 |
| 4.8 | 73.4 |
| 5.2 | 72.2 |
| 5.1 | 71.6 |
| 3.1 | 65.9 |
| 53.7 | 67.9 |
| 4.6 | 60.9 |
| 3.8 | 68.3 |
| 3.4 | 54.1 |
| 4.2 | 69.8 |
| 3.4 | 58.1 |
| 3.2 | 68.1 |
| 4.3 | 67.6 |
| 4.2 | 73.8 |
| 3.5 | 71.8 |
| 57.2 | 64.2 |
| 3.1 | 69.3 |
| 3.2 | 61.8 |
| 5.8 | 69 |
| 3.1 | 72.8 |
| 4.1 | 70.5 |
| 5.2 | 69.6 |
| 3.5 | 73 |
| 4.0 | 73 |
| 42.3 | 67.6 |
| 4.2 | 67 |
| 3.2 | 71 |
| 3.5 | 62.1 |
| 4.1 | 71.5 |
| 3.6 | 68.4 |
| 29.5 | 69.6 |
| 4.6 | 70.6 |
| 2.5 | 66.9 |
| 3.5 | 61.6 |
| 3.3 | 63.3 |
| 3.8 | 65.6 |
| 10.0 | 63.6 |
| 57.4 | 67.8 |
| 4.0 | 58.5 |
| 3.2 | 60.3 |
| 29.4 | 72 |
| 4.9 | 62.9 |
| 2.8 | 66 |
| 65.7 | 69.2 |
| 3.7 | 60.6 |
| 49.1 | 63.2 |
| 3.1 | 70.4 |
| 3.9 | 69.3 |
| 3.5 | 73.8 |
| 3.0 | 70.1 |
| 28.1 | 71.7 |
| 2.4 | 71.2 |
| 5.4 | 64.7 |
| 2.3 | 64.2 |
| 2.5 | 69.1 |
| 66.0 | 69 |
| 4.0 | 69.1 |
| 3.3 | 74.5 |
| 10.2 | 70.2 |
| 9.2 | 67.5 |
| 5.4 | 70.2 |
| 2.8 | 65.6 |
| 3.3 | 60.9 |
| 3.7 | 73.2 |
| 3.6 | 70.1 |
| 4.3 | 72.8 |
| 3.8 | 67.6 |
| 45.4 | 68.7 |
| 53.3 | 68.4 |
| 4.7 | 69.9 |
| 4.3 | 72.3 |
| 4.5 | 61.6 |
| 4.2 | 69.4 |
| 4.6 | 63.8 |
| 5.3 | 71.9 |
| 29.2 | 66.9 |
| 4.4 | 74 |
| 5.2 | 61.5 |
| 4.6 | 68.5 |
| 4.5 | 70.5 |
| 4.3 | 66.1 |
| 6.9 | 72.3 |
| 3.7 | 65.9 |
| 4.0 | 61.7 |
| 3.4 | 61.3 |
| 3.3 | 63.5 |
| 5.1 | 63.5 |
| 3.1 | 61.3 |
| 3.4 | 70.3 |
| 3.5 | 73.7 |
| 67.4 | 63.9 |
| 56.9 | 65.9 |
| 7.1 | 69.7 |
| 3.7 | 67 |
| 4.5 | 62 |
| 6.9 | 68.4 |
| 3.8 | 72.1 |
| 3.5 | 64.9 |
| 69.3 | 68.9 |
| 3.2 | 69.6 |
| 3.1 | 71.3 |
| 4.6 | 63.2 |
| 5.9 | 70.3 |
| 112.7 | 66 |
| 3.8 | 68.5 |
| 4.3 | 71.6 |
| 2.7 | 69 |
| 5.6 | 67.3 |
| 3.6 | 72.3 |
| 4.1 | 71.5 |
| 3.3 | 67.5 |
| 10.8 | 64.3 |
| 2.6 | 65.8 |
| 4.8 | 68.7 |
| 2.9 | 66.4 |
| 3.3 | 73.3 |
| 9.0 | 69.7 |
| 62.8 | 65.4 |
| 4.7 | 74.1 |
| 8.1 | 65.8 |
| 70.9 | 67.4 |
| 59.9 | 60.8 |
| 3.0 | 73.4 |
| 4.2 | 72.9 |
| 42.6 | 70.7 |
| 41.8 | 69.9 |
| 5.2 | 73 |
| 3.7 | 70.7 |
| 43.3 | 67.6 |
| 61.7 | 67.7 |
| 4.4 | 73.9 |
| 88.1 | 63 |
| 6.3 | 72.9 |
| 2.4 | 71.2 |
| 46.3 | 65.5 |
| 10.3 | 71.3 |
| 3.0 | 67.1 |
| 60.1 | 72.2 |
| 44.3 | 68.2 |
| 4.1 | 73.7 |
| 3.6 | 69.1 |
| 5.4 | 73.7 |
| 4.0 | 74.1 |
| 101.0 | 52.4 |
| 3.6 | 72.9 |
| 3.0 | 59.4 |
| 53.1 | 65 |
| 59.2 | 67.5 |
| 31.3 | 69.8 |
| 4.9 | 67.7 |
| 6.3 | 71 |
| 2.4 | 71.4 |
| 51.3 | 67.4 |
| 3.7 | 70.9 |
| 4.6 | 64.4 |
| 63.8 | 69.1 |
| 3.8 | 60.3 |
| 4.4 | 70.6 |
| 4.7 | 68.6 |
| 14.0 | 51.4 |
| 5.7 | 71.8 |
| 9.9 | 66.5 |
| 3.2 | 58.1 |
| 3.7 | 64.4 |
| 5.5 | 71.2 |
| 49.9 | 70.8 |
| 5.9 | 68.1 |
| 4.2 | 72.4 |
| 14.9 | 66.5 |
| 4.7 | 74.1 |
| 16.7 | 68.4 |
| 2.2 | 65.7 |
| 1.3 | 66.3 |
| 17.7 | 72.1 |
| 2.3 | 64.6 |
| 192.1 | 63 |
| 2.5 | 65.6 |
| 3.7 | 68.6 |
| 5.0 | 66.1 |
| 2.9 | 61.4 |
| 2.2 | 67.9 |
| 4.1 | 63.2 |
| 2.4 | 67.5 |
| 3.5 | 70.9 |
| 91.0 | 65.7 |
| 1.9 | 65.2 |
| 9.3 | 72 |
| 2.6 | 69.3 |
| 3.5 | 60.6 |
| 2.4 | 60.6 |
| 6.1 | 69.4 |
| 4.1 | 70.6 |
| 25.1 | 72.1 |
| 4.5 | 45 |
| 4.7 | 69.1 |
| 4.0 | 72.3 |
| 5.1 | 73.3 |
| 3.6 | 70.9 |
| 2.7 | 60.8 |
| 3.3 | 68.8 |
| 2.6 | 69.6 |
| 4.3 | 48.2 |
| 47.0 | 71.8 |
| 46.5 | 68.3 |
| 5.0 | 64.8 |
| 3.2 | 66.8 |
| 2.7 | 57.9 |
| 45.4 | 64.5 |
| 3.3 | 72.2 |
| 12.2 | 70.3 |
| 3.1 | 70.1 |
| 3.6 | 70.3 |
| 3.6 | 70.7 |
| 2.7 | 72.4 |
| 68.6 | 63.5 |
| 4.5 | 70.8 |
| 56.6 | 67 |
| 2.9 | 65.4 |
| 6.6 | 67.4 |
| 47.1 | 73.5 |
| 2.9 | 49.1 |
| 3.3 | 73.9 |
| 10.7 | 62 |
| 4.6 | 72.4 |
| 5.0 | 73.3 |
| 6.1 | 69.2 |
| 3.0 | 58.3 |
| 3.4 | 42.2 |
| 4.3 | 67.4 |
| 5.8 | 69.3 |
| 5.4 | 67 |
| 53.3 | 70.4 |
| 28.9 | 64.1 |
| 74.3 | 66.4 |
| 5.2 | 69 |
| 42.6 | 72.8 |
| 13.2 | 67 |
| 35.0 | 72.1 |
| 2.4 | 60.7 |
| 3.5 | 65.5 |
| 59.6 | 67.3 |
| 8.7 | 64.1 |
| 37.0 | 69.6 |
| 74.1 | 68.2 |
| 2.5 | 60.8 |
| 2.8 | 72 |
| 11.0 | 68.8 |
| 84.6 | 67.5 |
| 3.4 | 70.6 |
| 67.7 | 51.8 |
| 4.2 | 57.9 |
| 3.3 | 72.3 |
| 3.5 | 69.2 |
| 2.9 | 56.7 |
| 4.6 | 71.9 |
| 33.0 | 66.1 |
| 28.5 | 65.9 |
| 3.6 | 63.5 |
| 4.7 | 73.3 |
| 3.1 | 67.3 |
| 2.0 | 68.1 |
| 4.5 | 64.9 |
| 66.8 | 68.2 |
| 2.9 | 60.3 |
| 4.1 | 68.9 |
| 3.3 | 71.6 |
| 5.3 | 46 |
| 3.6 | 67 |
| 45.8 | 71.2 |
| 2.7 | 69.2 |
| 8.9 | 71.1 |
| 3.1 | 59.2 |
| 5.4 | 60 |
| 4.0 | 61.8 |
| 3.8 | 72 |
| 4.2 | 68.4 |
| 6.2 | 71.9 |
| 5.3 | 74.5 |
| 5.2 | 71.1 |
| 59.0 | 64.6 |
| 8.4 | 67.6 |
| 48.0 | 66.8 |
| 43.5 | 68.7 |
| 41.6 | 69.7 |
| 3.2 | 72 |
| 27.0 | 69.2 |
| 3.9 | 68.2 |
| 4.2 | 69 |
| 3.2 | 71 |
| 10.8 | 62 |
| 5.6 | 72.4 |
| 3.6 | 68.9 |
| 4.2 | 72.8 |
| 16.3 | 65.3 |
| 95.0 | 67.6 |
| 3.2 | 63.5 |
| 3.0 | 72.9 |
| 8.6 | 60.6 |
| 95.3 | 66.2 |
| 3.0 | 71.5 |
| 2.5 | 72 |
| 65.7 | 66.6 |
| 3.2 | 69.7 |
| 3.6 | 70.1 |
| 2.8 | 68 |
| 9.3 | 68.2 |
| 60.7 | 72.6 |
| 4.7 | 72 |
| 4.0 | 73.7 |
| 20.1 | 69.1 |
| 3.6 | 72 |
| 13.5 | 68.6 |
| 33.9 | 68.1 |
| 65.0 | 67.4 |
| 59.1 | 55.5 |
| 4.4 | 73.8 |
| 2.9 | 71.6 |
| 3.2 | 73.4 |
| 6.8 | 65.7 |
| 55.3 | 66 |
| 6.3 | 71.1 |
| 5.1 | 70.1 |
| 100.3 | 65 |
| 2.4 | 70.1 |
| 4.2 | 68.7 |
| 75.7 | 66.2 |
| 4.2 | 72.7 |
| 4.2 | 71.6 |
| 4.2 | 62.3 |
| 15.5 | 55.1 |
| 5.0 | 64.9 |
| 4.2 | 66.3 |
| 56.1 | 68.9 |
| 32.1 | 50.8 |
| 2.3 | 59.7 |
| 50.1 | 65.3 |
| 67.9 | 72.1 |
| 3.7 | 60.8 |
| 9.5 | 70 |
| 63.2 | 68.9 |
| 5.1 | 66.1 |
| 101.8 | 65 |
| 47.4 | 68.6 |
| 25.4 | 66.5 |
| 3.0 | 64.1 |
| 3.3 | 71.7 |
| 2.8 | 70.4 |
| 4.4 | 71.1 |
| 4.3 | 64.2 |
| 3.6 | 74.3 |
| 3.1 | 61.8 |
| 2.7 | 69.2 |
| 2.8 | 66.9 |
| 70.6 | 65.1 |
| 3.3 | 74.9 |
| 6.3 | 67.6 |
| 56.7 | 66 |
| 80.9 | 63.3 |
| 55.8 | 65.5 |
| 6.1 | 69.7 |
| 3.7 | 70.8 |
| 4.1 | 70.3 |
| 50.3 | 69.8 |
| 58.9 | 66 |
| 11.4 | 70.7 |
| 3.0 | 57.8 |
| 2.7 | 62.5 |
| 71.3 | 66.6 |
| 40.9 | 69.6 |
| 3.0 | 55.6 |
| 3.4 | 53.7 |
| 2.9 | 67.2 |
| 4.0 | 72.3 |
| 2.5 | 70.9 |
| 39.1 | 71.1 |
| 64.8 | 67.3 |
| 3.7 | 64.6 |
| 3.1 | 68 |
| 2.5 | 71.7 |
| 6.8 | 68.1 |
| 5.3 | 64.9 |
| 3.0 | 63.3 |
| 50.8 | 69.7 |
| 4.3 | 71.4 |
| 83.1 | 66.6 |
| 68.0 | 62.6 |
| 3.1 | 68.1 |
| 6.1 | 72.6 |
| 58.2 | 64.3 |
| 53.9 | 71.5 |
| 19.5 | 68.5 |
| 3.0 | 69.9 |
| 15.7 | 66.7 |
| 49.1 | 67.3 |
| 216.9 | 67.1 |
| 3.8 | 71.2 |
| 4.9 | 68.7 |
| 3.8 | 54.5 |
| 6.1 | 65.5 |
| 3.2 | 57.1 |
| 4.3 | 71.5 |
| 3.9 | 72.3 |
| 5.5 | 65.3 |
| 16.2 | 65 |
| 41.1 | 68.6 |
| 45.7 | 58.9 |
| 60.4 | 68.3 |
| 67.7 | 69.3 |
| 4.9 | 62.5 |
| 60.9 | 69.2 |
| 57.2 | 70.5 |
| 64.8 | 67.2 |
| 1.9 | 55.5 |
| 5.3 | 67.1 |
| 5.6 | 69.2 |
| 32.8 | 69.6 |
| 4.0 | 64.7 |
| 2.8 | 60.9 |
| 3.7 | 72.6 |
| 3.6 | 71.4 |
| 3.0 | 68.9 |
| 4.1 | 66.6 |
| 64.1 | 67.7 |
| 3.4 | 67.5 |
| 1.1 | 48.3 |
| 27.2 | 70.1 |
| 27.4 | 70.5 |
| 4.2 | 71.1 |
| 4.5 | 66.2 |
| 6.3 | 69.7 |
| 3.8 | 68 |
| 3.2 | 75 |
| 4.1 | 78 |
| 4.4 | 74.8 |
| 2.5 | 63.7 |
| 4.1 | 65.4 |
| 16.5 | 66.6 |
| 8.4 | 67.3 |
| 64.9 | 67.3 |
| 3.0 | 69.5 |
| 83.9 | 68.3 |
| 28.9 | 70.5 |
| 57.4 | 64.7 |
| 3.2 | 67.5 |
| 76.9 | 63.1 |
| 5.1 | 70.6 |
| 59.4 | 65.4 |
| 10.0 | 69.9 |
| 4.9 | 74 |
| 4.3 | 65.7 |
| 2.9 | 70.2 |
| 61.0 | 66.8 |
| 4.1 | 70.3 |
| 87.3 | 68.4 |
| 28.5 | 55.5 |
| 4.0 | 71.4 |
| 41.2 | 67.8 |
| 4.7 | 58.4 |
| 3.6 | 69.6 |
| 4.4 | 70.1 |
| 6.4 | 61.1 |
| 54.2 | 68.4 |
| 63.7 | 65.7 |
| 4.5 | 71.3 |
| 62.8 | 65.7 |
| 50.5 | 57.3 |
| 4.2 | 70 |
| 4.8 | 73.5 |
| 2.2 | 69.4 |
| 13.1 | 68.7 |
| 3.6 | 70.6 |
| 3.3 | 65.6 |
| 64.8 | 68 |
| 67.4 | 69.9 |
| 4.2 | 65.8 |
| 3.5 | 71.8 |
| 5.1 | 71.4 |
| 4.0 | 72.1 |
| 4.3 | 69 |
| 57.9 | 69 |
| 42.7 | 71.7 |
| 2.3 | 61.9 |
| 3.7 | 50.5 |
| 4.0 | 73.2 |
| 4.7 | 73.1 |
| 2.5 | 66.1 |
| 15.4 | 70.5 |
| 13.4 | 71.2 |
| 3.4 | 62.5 |
| 5.7 | 62.5 |
| 8.6 | 65.5 |
| 3.2 | 70.5 |
| 3.1 | 63.9 |
| 3.3 | 69.4 |
| 4.8 | 70.1 |
| 3.1 | 70.3 |
| 4.2 | 69 |
| 61.3 | 67 |
| 4.8 | 70.5 |
| 53.8 | 61 |
| 10.1 | 72.5 |
| 3.1 | 58.5 |
| 32.8 | 71.2 |
| 3.1 | 63.1 |
| 3.7 | 60.5 |
| 4.1 | 51.6 |
| 5.4 | 66.5 |
| 3.9 | 59.4 |
| 3.0 | 69.3 |
| 74.1 | 67.1 |
| 4.0 | 68.2 |
| 4.4 | 68.8 |
| 4.2 | 72.4 |
| 73.8 | 69.5 |
| 3.9 | 46.2 |
| 2.3 | 70.8 |
| 67.7 | 65.4 |
| 3.3 | 68.2 |
| 36.2 | 70.6 |
| 5.8 | 52.5 |
| 5.6 | 68.5 |
| 2.8 | 69.5 |
| 17.6 | 68.8 |
| 5.9 | 68 |
| 3.4 | 62.4 |
| 2.4 | 68.4 |
| 5.9 | 72.8 |
| 46.0 | 69.2 |
| 4.8 | 70.1 |
| 41.8 | 65.7 |
| 4.6 | 70.6 |
| 3.4 | 68.9 |
| 2.3 | 71.1 |
| 3.8 | 76 |
| 19.0 | 68.8 |
| 2.1 | 63.7 |
| 3.5 | 67.2 |
| 2.9 | 58 |
| 4.0 | 63 |
| 40.6 | 63.4 |
| 6.6 | 60.4 |
| 3.6 | 70.2 |
| 3.6 | 67.6 |
| 4.0 | 60.7 |
| 5.6 | 69.6 |
| 60.1 | 66.3 |
| 4.3 | 59.6 |
| 3.9 | 61.3 |
| 3.3 | 74.7 |
| 4.6 | 72.6 |
| 3.7 | 67.5 |
| 14.8 | 71.8 |
| 3.9 | 67.4 |
| 2.7 | 63.1 |
| 5.2 | 71.4 |
| 16.6 | 69.6 |
| 87.4 | 70.1 |
| 68.6 | 69.5 |
| 6.1 | 70.6 |
| 2.4 | 68 |
| 2.3 | 69.6 |
| 24.2 | 70.1 |
| 2.9 | 62.2 |
| 2.4 | 69.4 |
| 35.4 | 72.1 |
| 23.0 | 71.7 |
| 38.3 | 68.7 |
| 4.3 | 72.2 |
| 115.4 | 63.9 |
| 69.8 | 69 |
| 17.5 | 71.9 |
| 2.9 | 61.5 |
| 4.2 | 62.1 |
| 4.9 | 65.5 |
| 4.8 | 67.5 |
| 4.2 | 73 |
| 3.8 | 68.6 |
| 2.4 | 70.8 |
| 5.3 | 71.4 |
| 4.5 | 68.9 |
| 1.8 | 57.5 |
| 77.9 | 67.1 |
| 11.3 | 70.2 |
| 4.3 | 66.4 |
| 4.6 | 69 |
| 5.4 | 67.8 |
| 3.6 | 69.9 |
| 63.4 | 67.7 |
| 51.7 | 71.8 |
| 15.5 | 70.9 |
| 3.2 | 59.6 |
| 3.9 | 70.7 |
| 2.4 | 63.5 |
| 5.6 | 69 |
| 2.5 | 61.6 |
| 33.9 | 72.1 |
| 4.1 | 65.7 |
| 3.9 | 66.3 |
| 4.1 | 62.3 |
| 20.0 | 70.6 |
| 2.9 | 65.4 |
| 52.1 | 70.1 |
| 3.6 | 67.1 |
| 3.4 | 74.4 |
| 3.8 | 71.5 |
| 5.2 | 64 |
| 2.5 | 70.3 |
| 8.8 | 65.8 |
| 28.6 | 73.9 |
| 3.5 | 69 |
| 6.5 | 43.7 |
| 2.8 | 71.2 |
| 3.8 | 69.9 |
| 5.6 | 57.2 |
| 15.0 | 67.9 |
| 59.9 | 67.1 |
| 65.1 | 66.8 |
| 90.4 | 66.9 |
| 5.6 | 70.1 |
| 10.6 | 64.8 |
| 4.2 | 63.3 |
| 3.5 | 72.3 |
| 3.3 | 69.8 |
| 5.0 | 61.7 |
| 86.7 | 66.1 |
| 30.6 | 67.7 |
| 4.3 | 71.6 |
| 12.8 | 65.6 |
| 2.8 | 67 |
| 72.3 | 62.8 |
| 5.0 | 65.1 |
| 3.6 | 70.4 |
| 2.9 | 70.8 |
| 61.8 | 70.7 |
| 2.1 | 69 |
| 3.0 | 67.5 |
| 50.2 | 66.1 |
| 4.7 | 65.4 |
| 5.1 | 73.5 |
| 4.1 | 71.8 |
| 3.2 | 71.4 |
| 47.7 | 61.7 |
| 3.7 | 70.2 |
| 2.9 | 68.3 |
| 5.8 | 68.6 |
| 4.1 | 76.7 |
| 3.4 | 72.1 |
| 19.7 | 64.9 |
| 2.9 | 66.2 |
| 33.0 | 66.5 |
| 13.8 | 71.3 |
| 44.9 | 71.6 |
| 3.9 | 71.7 |
| 2.5 | 64.9 |
| 7.8 | 71 |
| 9.6 | 64.9 |
| 3.1 | 70.1 |
| 96.7 | 59.5 |
| 3.0 | 73.4 |
| 7.8 | 67.5 |
| 4.8 | 71.2 |
| 4.7 | 70.4 |
| 17.7 | 69.6 |
| 3.5 | 71.2 |
| 3.8 | 65.9 |
| 2.2 | 63.5 |
| 5.4 | 73 |
| 46.3 | 68.2 |
| 3.8 | 59.6 |
| 3.7 | 69.6 |
| 58.8 | 64.9 |
| 3.5 | 55.8 |
| 3.9 | 67.5 |
| 3.9 | 72.4 |
| 39.0 | 67.9 |
| 2.3 | 62.6 |
| 2.8 | 70.3 |
| 2.7 | 63.8 |
| 68.7 | 65.6 |
| 4.2 | 70.5 |
| 51.8 | 70.9 |
| 2.3 | 70.1 |
| 4.5 | 69.4 |
| 3.9 | 60.7 |
| 53.4 | 71.8 |
| 3.5 | 69.3 |
| 2.9 | 73.1 |
| 3.4 | 63.8 |
| 4.1 | 61.5 |
| 4.8 | 71.2 |
| 7.8 | 65.7 |
| 11.4 | 62.4 |
| 1.8 | 62.7 |
| 3.9 | 65.8 |
| 57.5 | 72 |
| 57.0 | 62.7 |
| 3.9 | 63.5 |
| 4.1 | 67.3 |
| 55.0 | 60.6 |
| 2.5 | 63.5 |
| 7.2 | 64.2 |
| 2.5 | 53.4 |
| 3.1 | 71.4 |
| 4.1 | 66.3 |
| 3.3 | 70.3 |
| 66.0 | 67.3 |
| 3.7 | 71.4 |
| 9.1 | 65.4 |
| 3.2 | 71.8 |
| 51.8 | 69.8 |
| 51.2 | 73.7 |
| 80.7 | 67.8 |
| 65.8 | 65 |
| 45.6 | 50 |
| 3.1 | 70.7 |
| 15.6 | 66.9 |
| 3.9 | 56.2 |
| 3.5 | 69.6 |
| 4.7 | 67.7 |
| 2.0 | 71 |
| 5.0 | 74.3 |
| 3.0 | 66.1 |
| 3.1 | 72.7 |
| 2.2 | 68.1 |
| 2.8 | 70.6 |
| 3.0 | 62.1 |
| 3.2 | 70 |
| 5.8 | 72.2 |
| 2.7 | 65.7 |
| 3.4 | 68.7 |
| 3.9 | 69.7 |
| 6.6 | 62.3 |
| 1.6 | 64.6 |
| 16.2 | 66.4 |
| 4.1 | 71.3 |
| 4.5 | 64.4 |
| 3.8 | 67.3 |
| 65.5 | 66.5 |
| 96.4 | 69.1 |
| 43.5 | 71.3 |
| 3.2 | 63.3 |
| 4.1 | 72 |
| 4.7 | 67.3 |
| 29.0 | 67.9 |
| 3.0 | 65.5 |
| 3.6 | 63.5 |
| 2.7 | 61.9 |
| 1.7 | 69.9 |
| 5.4 | 73.3 |
| 26.8 | 69.7 |
| 3.1 | 70.2 |
| 13.2 | 69 |
| 16.3 | 69 |
| 3.1 | 40.6 |
| 3.7 | 64.4 |
| 3.0 | 71.1 |
| 72.3 | 68.2 |
| 53.3 | 65.9 |
| 2.6 | 65.1 |
| 72.4 | 66.1 |
| 5.2 | 70.8 |
| 3.1 | 67.5 |
| 7.3 | 62.2 |
| 3.6 | 68.3 |
| 4.9 | 73.6 |
| 3.9 | 70.5 |
| 2.7 | 66.7 |
| 3.1 | 59 |
| 3.8 | 72.2 |
| 21.6 | 72.5 |
| 8.3 | 65.9 |
| 27.6 | 70.1 |
| 2.9 | 69.3 |
| 4.0 | 59.3 |
| 4.1 | 71.7 |
| 4.2 | 71.4 |
| 5.1 | 69.5 |
| 4.1 | 72.6 |
| 5.4 | 68.3 |
| 3.3 | 54.9 |
| 5.5 | 70.6 |
| 74.3 | 67.9 |
| 19.8 | 71.2 |
| 70.6 | 70 |
| 3.7 | 70.4 |
| 4.6 | 70.6 |
| 3.7 | 71.5 |
| 14.4 | 69.9 |
| 3.4 | 56.8 |
| 56.0 | 63.9 |
| 3.0 | 70.5 |
| 2.7 | 66.7 |
| 4.5 | 66.9 |
| 9.0 | 69 |
| 4.8 | 73.8 |
| 3.0 | 62.2 |
| 4.5 | 69.7 |
| 3.8 | 71.1 |
| 17.9 | 66.4 |
| 70.5 | 66.2 |
| 3.9 | 70.1 |
| 80.3 | 61.2 |
| 9.7 | 61.2 |
| 19.4 | 68.5 |
| 18.2 | 69.8 |
| 55.6 | 64.1 |
| 3.4 | 54.5 |
| 2.8 | 62 |
| 5.4 | 70.3 |
| 3.9 | 71.7 |
| 2.9 | 72 |
| 2.4 | 67.3 |
| 4.6 | 72.7 |
| 2.9 | 71 |
| 11.2 | 66.8 |
| 59.2 | 64.4 |
| 49.8 | 69.5 |
| 79.4 | 69 |
| 7.2 | 65.4 |
| 4.6 | 67.2 |
| 4.6 | 64.3 |
| 2.8 | 72.4 |
| 19.3 | 71.6 |
| 43.1 | 68.3 |
| 56.4 | 65.7 |
| 119.7 | 66.8 |
| 4.3 | 71.8 |
| 4.6 | 72.4 |
| 3.2 | 63.8 |
| 3.5 | 69.9 |
| 20.3 | 67.5 |
| 3.7 | 72.2 |
| 6.1 | 62.2 |
| 67.3 | 68.2 |
| 4.4 | 68.4 |
| 3.0 | 66.5 |
| 42.5 | 56 |
| 15.2 | 64.9 |
| 1011.1 | 56.3 |
| 4.8 | 70.5 |
| 3.1 | 68.2 |
| 4.5 | 72.2 |
| 4.3 | 67.3 |
| 3.7 | 66.6 |
| 2.7 | 71.4 |
| 3.9 | 70.6 |
| 41.7 | 67.6 |
| 55.7 | 68 |
| 3.7 | 70.7 |
| 4.6 | 73.6 |
| 15.3 | 70.7 |
| 73.7 | 68.5 |
| 55.8 | 64.5 |
| 2.8 | 64.7 |
| 3.6 | 65.8 |
| 34.1 | 65.9 |
| 55.3 | 66.6 |
| 8.2 | 67.8 |
| 57.3 | 71.9 |
| 11.0 | 59.5 |
| 3.2 | 68.9 |
| 3.5 | 69.3 |
| 5.4 | 66.8 |
| 3.9 | 61 |
| 3.0 | 58 |
| 4.4 | 70.4 |
| 5.6 | 70.9 |
| 2.7 | 57.8 |
| 4.9 | 61.1 |
| 40.9 | 68.6 |
| 3.7 | 66 |
| 3.2 | 64.5 |
| 3.7 | 69.3 |
| 35.1 | 69.7 |
| 2.8 | 58.4 |
| 4.0 | 72.2 |
| 114.5 | 62.2 |
| 4.5 | 69.2 |
| 3.6 | 64.7 |
| 37.6 | 70.8 |
| 2.3 | 62.3 |
| 2.8 | 65.9 |
| 3.5 | 70.7 |
| 49.4 | 67.8 |
| 33.2 | 65.5 |
| 38.0 | 69.1 |
| 3.1 | 74.5 |
| 3.3 | 66.3 |
| 9.2 | 67.8 |
| 46.9 | 65.1 |
| 3.5 | 69.8 |
| 5.2 | 61.8 |
| 58.8 | 62.7 |
| 4.4 | 67.4 |
| 3.4 | 71.9 |
| 3.7 | 59.8 |
| 4.1 | 71.6 |
| 50.0 | 66.1 |
| 2.5 | 62 |
| 3.6 | 71 |
| 48.6 | 68.6 |
| 3.2 | 66 |
| 3.8 | 73.6 |
| 55.1 | 67.6 |
| 3.0 | 69.7 |
| 2.7 | 60.8 |
| 5.1 | 67.7 |
| 3.2 | 74.1 |
| 4.2 | 73.5 |
| 52.6 | 66.6 |
| 3.5 | 61.7 |
| 4.1 | 75.2 |
| 5.4 | 67.1 |
| 2.9 | 68.1 |
| 1.8 | 66.6 |
| 3.8 | 62.7 |
| 4.8 | 65.8 |
| 3.0 | 55.8 |
| 3.3 | 58.7 |
| 3.3 | 64.7 |
| 15.5 | 61.2 |
| 4.6 | 63.9 |
| 2.4 | 66.5 |
| 4.0 | 68.2 |
| 3.4 | 75.7 |
| 3.9 | 76.4 |
| 3.1 | 60.9 |
| 5.2 | 60.9 |
| 2.6 | 68.8 |
| 4.3 | 72 |
| 68.6 | 66.5 |
| 9.6 | 65.4 |
| 4.2 | 59.1 |
| 3.8 | 68.3 |
| 5.6 | 73.1 |
| 25.7 | 68.9 |
| 3.6 | 63.5 |
| 3.0 | 67.4 |
| 3.4 | 71.9 |
| 3.5 | 72.5 |
| 21.8 | 68.7 |
| 16.1 | 69.3 |
| 44.3 | 69.5 |
| 15.6 | 66.7 |
| 63.2 | 70.7 |
| 3.0 | 68.7 |
| 23.4 | 64.1 |
| 52.5 | 65.7 |
| 55.2 | 69.2 |
| 3.6 | 61.4 |
| 1.1 | 56.5 |
| 3.5 | 58.7 |
| 2.9 | 72.1 |
| 16.1 | 70.4 |
| 3.3 | 69.1 |
| 5.6 | 70.7 |
| 2.0 | 68.7 |
| 2.9 | 69.7 |
| 2.9 | 74.3 |
| 3.3 | 75.4 |
| 28.1 | 71.4 |
| 11.3 | 65.9 |
| 4.2 | 68.9 |
| 4.1 | 61.5 |
| 5.1 | 69 |
| 14.5 | 77.5 |
| 4.4 | 74.7 |
| 71.0 | 65 |
| 4.8 | 70.8 |
| 4.4 | 72.5 |
| 3.0 | 63.5 |
| 3.4 | 65.6 |
| 3.4 | 57.9 |
| 3.6 | 53.1 |
| 24.7 | 72.3 |
| 2.3 | 60.3 |
| 7.7 | 68.4 |
| 3.8 | 61.4 |
| 2.5 | 71.3 |
| 56.0 | 66.4 |
| 4.7 | 71.5 |
| 25.7 | 69.1 |
| 24.8 | 65.5 |
| 65.0 | 66.1 |
| 3.4 | 65.8 |
| 5.2 | 67.9 |
| 47.0 | 68.2 |
| 12.2 | 66.9 |
| 5.8 | 69.7 |
| 76.7 | 64.3 |
| 3.9 | 66 |
| 4.9 | 72.5 |
| 15.6 | 69.1 |
| 37.5 | 62.2 |
| 22.7 | 69.8 |
| 9.6 | 69.3 |
| 19.5 | 69.6 |
| 14.7 | 72.8 |
| 3.7 | 69.2 |
| 5.7 | 75.1 |
| 3.7 | 72.6 |
| 3.1 | 72.8 |
| 39.0 | 66.2 |
| 5.8 | 70.9 |
| 15.9 | 67.9 |
| 21.2 | 71.4 |
| 15.5 | 50.7 |
| 3.6 | 72.1 |
| 68.2 | 69.4 |
| 53.5 | 63.9 |
| 3.7 | 70.5 |
| 87.8 | 68.1 |
| 48.9 | 70.1 |
| 7.0 | 64.9 |
| 3.2 | 72 |
| 4.3 | 72.2 |
| 4.7 | 68.9 |
| 85.1 | 67 |
| 46.3 | 71.8 |
| 3.2 | 71.5 |
| 2.4 | 73.2 |
| 3.8 | 67.4 |
| 80.1 | 68.1 |
| 3.7 | 73.8 |
| 2.5 | 67.2 |
| 2.6 | 69.5 |
| 5.6 | 70.4 |
| 3.7 | 68.5 |
| 3.4 | 72.3 |
| 2.5 | 71.4 |
| 3.4 | 68.3 |
| 3.8 | 56.8 |
| 2.8 | 61.8 |
| 57.0 | 66.5 |
| 4.3 | 57.7 |
| 19.0 | 72.4 |
| 53.3 | 64.6 |
| 4.5 | 72.1 |
| 4.4 | 72.1 |
| 3.6 | 71.1 |
| 62.5 | 65.1 |
| 4.1 | 64.8 |
| 3.7 | 72.8 |
| 13.6 | 69.4 |
| 2.8 | 71.3 |
| 37.8 | 57.1 |
| 6.9 | 65.6 |
| 2.0 | 70.2 |
| 12.3 | 69.3 |
| 2.9 | 66.8 |
| 9.6 | 65.3 |
| 4.0 | 66.2 |
| 3.7 | 73 |
| 44.6 | 66.9 |
| 9.5 | 65.2 |
| 73.8 | 67.7 |
| 3.6 | 71.6 |
| 4.2 | 72.7 |
| 42.1 | 67.8 |
| 4.3 | 73.3 |
| 3.1 | 66.2 |
| 3.2 | 71.5 |
| 8.0 | 60 |
| 4.6 | 69.7 |
| 3.5 | 69.4 |
| 6.5 | 67.4 |
| 10.8 | 72.8 |
| 2.4 | 62.1 |
| 3.4 | 73.7 |
| 53.1 | 67.5 |
| 67.6 | 66.6 |
| 3.5 | 72.3 |
| 2.8 | 70.9 |
| 6.4 | 60.8 |
| 4.4 | 69.6 |
| 51.6 | 67.8 |
| 4.1 | 62.3 |
| 1.7 | 64 |
| 3.1 | 64.3 |
| 2.0 | 68.2 |
| 56.1 | 63.7 |
| 5.2 | 70.8 |
| 2.9 | 71.8 |
| 4.6 | 72.7 |
| 55.5 | 65 |
| 22.5 | 68 |
| 3.6 | 73.2 |
| 3.0 | 64.1 |
| 9.2 | 66.6 |
| 4.6 | 67.5 |
| 88.4 | 68.5 |
| 43.1 | 56.8 |
| 3.2 | 60.8 |
| 2.0 | 70.9 |
| 4.2 | 75 |
| 2.7 | 68.7 |
| 3.9 | 72 |
| 3.6 | 68.1 |
| 3.2 | 72.3 |
| 3.7 | 70.8 |
| 4.5 | 55 |
| 56.2 | 69.2 |
| 6.1 | 66.3 |
| 23.8 | 66.6 |
| 45.5 | 61.6 |
| 3.4 | 61.3 |
| 31.5 | 72 |
| 69.6 | 66.4 |
| 46.8 | 73.7 |
| 3.3 | 72.8 |
| 4.4 | 65.4 |
| 2.3 | 72.7 |
| 2.5 | 60.3 |
| 63.8 | 66 |
| 60.3 | 64 |
| 2.6 | 70.4 |
| 4.1 | 73 |
| 3.4 | 63.7 |
| 2.1 | 61.6 |
| 4.4 | 69.3 |
| 42.0 | 70.5 |
| 2.3 | 77.3 |
| 10.5 | 66.1 |
| 5.2 | 72.2 |
| 7.0 | 66.9 |
| 83.9 | 67.3 |
| 47.1 | 65.4 |
| 5.6 | 62.8 |
| 63.0 | 66.7 |
| 3.0 | 71.5 |
| 3.8 | 74.7 |
| 20.6 | 64.6 |
| 3.3 | 65.7 |
| 62.8 | 66.5 |
| 3.1 | 52.7 |
| 4.6 | 63.7 |
| 4.1 | 72.3 |
| 2.7 | 55.3 |
| 2.8 | 69.5 |
| 3.8 | 68.9 |
| 31.0 | 63.9 |
| 4.7 | 70.1 |
| 3.6 | 64.5 |
| 2.2 | 70 |
| 2.8 | 71.7 |
| 2.8 | 76.1 |
| 3.4 | 64.1 |
| 8.6 | 63.5 |
| 132.9 | 56.7 |
| 1.6 | 65.4 |
| 2.1 | 70.4 |
| 3.4 | 72 |
| 5.0 | 72.2 |
| 3.1 | 71.1 |
| 18.2 | 63.9 |
| 32.5 | 68.5 |
| 12.4 | 67.6 |
| 82.6 | 65.4 |
| 12.6 | 69.2 |
| 3.6 | 70.1 |
| 49.8 | 67.6 |
| 37.7 | 74.4 |
| 4.2 | 65.3 |
| 61.4 | 67.4 |
| 1.5 | 68.1 |
| 4.9 | 70.1 |
| 50.6 | 71 |
| 1.6 | 70.7 |
| 2.9 | 67.5 |
| 3.9 | 71.3 |
| 145.2 | 66.4 |
| 7.9 | 65 |
| 5.8 | 65.6 |
| 3.0 | 66.5 |
| 3.4 | 67.3 |
| 3.5 | 74.8 |
| 4.1 | 71.5 |
| 3.2 | 72.9 |
| 10.2 | 69.6 |
| 35.1 | 63.9 |
| 77.8 | 71.5 |
| 44.6 | 72.7 |
| 5.6 | 59 |
| 4.0 | 62.4 |
| 3.3 | 61.5 |
| 18.7 | 67 |
| 4.9 | 45.8 |
| 57.1 | 68.6 |
| 3.4 | 68.7 |
| 58.8 | 64 |
| 16.9 | 71.5 |
| 5.2 | 69.6 |
| 2.5 | 73.4 |
| 3.7 | 73.7 |
| 4.5 | 71.7 |
| 33.0 | 63.9 |
| 54.1 | 63.9 |
| 3.1 | 69.8 |
| 4.3 | 67.5 |
| 57.1 | 63.3 |
| 2.3 | 69.9 |
| 3.6 | 70.6 |
| 2.3 | 72.3 |
| 7.5 | 67.8 |
| 2.7 | 62.3 |
| 3.9 | 49.8 |
| 3.1 | 62 |
| 6.0 | 73.4 |
| 4.1 | 71.2 |
| 4.4 | 64.7 |
| 4.5 | 72.6 |
| 69.3 | 71.9 |
| 2.2 | 67 |
| 3.4 | 39.8 |
| 1.8 | 58.3 |
| 58.8 | 69.4 |
| 28.6 | 69.4 |
| 51.0 | 67.6 |
| 65.6 | 66.5 |
| 19.8 | 69.9 |
| 50.8 | 70.6 |
| 1.3 | 55.7 |
| 4.1 | 67.3 |
| 3.7 | 74.1 |
| 8.4 | 65.7 |
| 6.0 | 67.9 |
| 59.8 | 65.4 |
| 3.8 | 63.2 |
| 3.1 | 69.1 |
| 4.7 | 67.3 |
| 4.2 | 70.2 |
| 13.2 | 52.7 |
| 3.7 | 70.9 |
| 3.8 | 69.1 |
| 8.8 | 61 |
| 40.5 | 67.7 |
| 4.9 | 69.9 |
| 6.2 | 67.9 |
| 2.6 | 58.6 |
| 2.5 | 71.7 |
| 34.6 | 70 |
| 7.1 | 65.6 |
| 3.0 | 67.5 |
| 4.2 | 73.9 |
| 3.3 | 74.6 |
| 6.2 | 74.8 |
| 20.9 | 67.5 |
| 70.3 | 68.8 |
| 47.5 | 66.2 |
| 2.3 | 72 |
| 2.1 | 59.9 |
| 3.6 | 66.6 |
| 4.1 | 69 |
| 3.0 | 70 |
| 5.5 | 71.3 |
| 4.1 | 72.7 |
| 66.1 | 65.6 |
| 3.1 | 54.8 |
| 3.6 | 71.1 |
| 4.0 | 72.2 |
| 5.7 | 65.7 |
| 4.5 | 65 |
| 3.8 | 71 |
| 3.5 | 63.5 |
| 54.0 | 63.6 |
| 8.1 | 65.2 |
| 2.4 | 66.5 |
| 32.3 | 66.9 |
| 4.3 | 65.8 |
| 60.3 | 62.6 |
| 2.9 | 59.5 |
| 4.0 | 71.7 |
| 55.3 | 67.1 |
| 55.7 | 69.8 |
| 3.3 | 59.3 |
| 4.4 | 71 |
| 4.3 | 62.6 |
| 2.8 | 69.2 |
| 3.9 | 62.5 |
| 12.0 | 71.5 |
| 118.4 | 65.3 |
| 4.3 | 64.7 |
| 3.1 | 70 |
| 62.5 | 67.1 |
| 33.7 | 70.2 |
| 7.3 | 65.4 |
| 3.2 | 73.8 |
| 3.4 | 62.4 |
| 2.7 | 68.6 |
| 31.8 | 66.6 |
| 3.4 | 66.7 |
| 4.0 | 67.9 |
| 5.4 | 67.6 |
| 58.3 | 66.9 |
| 3.5 | 69.4 |
| 2.8 | 69.4 |
| 3.3 | 71.9 |
| 88.5 | 66.6 |
| 4.0 | 69.8 |
| 3.4 | 69.3 |
| 5.1 | 70 |
| 3.3 | 69.5 |
| 107.4 | 66.8 |
| 2.9 | 67.8 |
| 3.6 | 59.3 |
| 50.0 | 67.8 |
| 1.5 | 50.7 |
| 4.1 | 70.3 |
| 3.2 | 68.9 |
| 49.7 | 67.8 |
| 2.0 | 67.5 |
| 3.9 | 65.2 |
| 2.8 | 69.7 |
| 4.1 | 69.1 |
| 4.3 | 56.9 |
| 4.2 | 75.8 |
| 3.4 | 74.6 |
| 64.1 | 68.5 |
| 3.2 | 72.2 |
| 3.7 | 67.3 |
| 4.5 | 70.8 |
| 20.9 | 68.2 |
| 5.5 | 72.6 |
| 4.5 | 72.8 |
| 4.2 | 70.9 |
| 9.4 | 60.9 |
| 214.3 | 65.8 |
| 2.1 | 66.4 |
| 58.6 | 65.2 |
| 46.2 | 65.8 |
| 4.6 | 66.5 |
| 2.9 | 58.9 |
| 2.3 | 67.7 |
| 3.0 | 68.2 |
| 73.7 | 67.7 |
| 2.5 | 69.1 |
| 4.5 | 68.3 |
| 57.7 | 66.1 |
| 7.9 | 50.1 |
| 4.9 | 72.3 |
| 3.8 | 70.8 |
| 2.9 | 53.4 |
| 3.0 | 70.8 |
| 24.2 | 68.7 |
| 37.3 | 50.3 |
| 5.0 | 65.4 |
| 1.8 | 65.7 |
| 4.1 | 74.1 |
| 51.4 | 71.2 |
| 5.2 | 73.2 |
| 4.5 | 71.2 |
| 5.2 | 66.7 |
| 72.3 | 70.1 |
| 6.7 | 64.1 |
| 8.0 | 67.8 |
| 10.7 | 67 |
| 49.6 | 72.9 |
| 2.7 | 56.1 |
| 2.0 | 66 |
| 1.9 | 63.1 |
| 2.5 | 71.1 |
| 3.5 | 70.5 |
| 4.6 | 72.7 |
| 4.6 | 61.1 |
| 3.9 | 63.2 |
| 4.0 | 61.3 |
| 66.3 | 59.8 |
| 7.8 | 67.7 |
| 34.1 | 53.8 |
| 4.9 | 69.4 |
| 2.9 | 60.7 |
| 45.7 | 68.5 |
| 7.2 | 69.3 |
| 58.7 | 68.1 |
| 4.0 | 70.9 |
| 4.1 | 72 |
| 3.2 | 71.4 |
| 2.0 | 65.3 |
| 15.0 | 64.7 |
| 3.0 | 71.4 |
| 3.3 | 66.8 |
| 7.3 | 68.1 |
| 83.4 | 60.1 |
| 3.1 | 66.2 |
| 9.0 | 60 |
| 57.7 | 68.1 |
| 2.8 | 70 |
| 5.5 | 67.5 |
| 3.8 | 73.3 |
| 79.4 | 69.9 |
| 2.6 | 62.1 |
| 3.9 | 65.9 |
| 11.0 | 67.6 |
| 24.6 | 69.6 |
| 52.4 | 66.8 |
| 7.9 | 48.7 |
| 2.7 | 69.7 |
| 4.9 | 70.5 |
| 3.2 | 71.6 |
| 1.9 | 72.3 |
| 78.5 | 65.7 |
| 53.3 | 70.1 |
| 54.6 | 62.3 |
| 3.1 | 72.3 |
| 2.9 | 74.5 |
| 3.6 | 72.3 |
| 2.7 | 63.2 |
| 3.3 | 69.7 |
| 41.2 | 66.5 |
| 4.0 | 69.8 |
| 4.2 | 72.6 |
| 2.9 | 74.2 |
| 57.3 | 65.5 |
| 2.0 | 69.3 |
| 3.2 | 62.7 |
| 3.8 | 68.3 |
| 3.9 | 73.3 |
| 52.2 | 68.7 |
| 3.3 | 73.5 |
| 4.1 | 74.2 |
| 4.3 | 75.7 |
| 3.7 | 63.5 |
| 4.4 | 69.4 |
| 2.4 | 61.3 |
| 1.8 | 59.3 |
| 4.1 | 68.6 |
| 5.0 | 71.3 |
| 3.7 | 70.4 |
| 3.8 | 45.7 |
| 3.1 | 64.2 |
| 17.3 | 65.5 |
| 4.8 | 70.5 |
| 56.1 | 65 |
| 3.2 | 67.7 |
| 49.7 | 67.4 |
| 6.2 | 61.2 |
| 3.9 | 68.9 |
| 2.4 | 72.6 |
| 12.8 | 68.4 |
| 3.2 | 62.6 |
| 3.0 | 57.4 |
| 21.8 | 70.1 |
| 4.2 | 70.8 |
| 4.0 | 74.2 |
| 3.0 | 69.2 |
| 3.8 | 68.8 |
| 1.9 | 64.3 |
| 6.0 | 67.3 |
| 3.4 | 66.9 |
| 3.7 | 66.7 |
| 3.6 | 71.6 |
| 3.4 | 67.8 |
| 18.1 | 70 |
| 6.5 | 70.9 |
| 3.8 | 70.2 |
| 4.8 | 57.1 |
| 2.2 | 55.5 |
| 3.0 | 66.8 |
| 25.3 | 70.4 |
| 65.7 | 67 |
| 2.8 | 73.7 |
| 6.1 | 73.7 |
| 2.7 | 66.5 |
| 3.0 | 67.3 |
| 55.4 | 66.6 |
| 4.8 | 69.2 |
| 4.9 | 74.2 |
| 4.8 | 73.1 |
| 8.6 | 62.5 |
| 5.0 | 71.2 |
| 4.5 | 70.8 |
| 52.2 | 66.4 |
| 9.3 | 68.1 |
| 3.9 | 69.5 |
| 2.9 | 70.9 |
| 3.6 | 71.5 |
| 3.6 | 73.7 |
| 3.1 | 70.5 |
| 23.0 | 73.1 |
| 9.8 | 67.6 |
| 3.8 | 65 |
| 2.6 | 66.2 |
| 3.3 | 72.8 |
| 8.5 | 65.1 |
| 52.7 | 72.3 |
| 20.2 | 67.7 |
| 45.0 | 69.6 |
| 67.3 | 66.9 |
| 64.5 | 63.8 |
| 17.5 | 68.9 |
| 3.1 | 71.6 |
| 2.9 | 70.8 |
| 3.5 | 70.3 |
| 36.4 | 73.3 |
| 10.1 | 73.9 |
| 49.1 | 68.7 |
| 5.8 | 57.2 |
| 5.3 | 63.8 |
| 3.1 | 68.9 |
| 3.5 | 71 |
| 4.6 | 71.7 |
| 3.5 | 55.1 |
| 81.6 | 67.9 |
| 2.5 | 65.2 |
| 3.7 | 51.7 |
| 4.3 | 73.6 |
| 3.6 | 74.6 |
| 4.0 | 58.4 |
| 4.1 | 72.6 |
| 4.6 | 74.9 |
| 4.2 | 70.3 |
| 22.5 | 72.1 |
| 54.1 | 68.2 |
| 20.3 | 71.5 |
| 4.3 | 68.2 |
| 693.7 | 66.4 |
| 25.8 | 52.4 |
| 3.3 | 59.6 |
| 3.8 | 59.7 |
| 2.9 | 67.2 |
| 2.7 | 69.4 |
| 3.2 | 54.4 |
| 3.6 | 67.6 |
| 5.7 | 71.9 |
| 3.2 | 66.3 |
| 6.3 | 67.6 |
| 44.6 | 69.3 |
| 6.6 | 69 |
| 3.3 | 62.2 |
| 4.6 | 72.1 |
| 3.4 | 74.3 |
| 79.7 | 68.6 |
| 3.6 | 53.9 |
| 4.3 | 69.4 |
| 3.9 | 74.6 |
| 69.9 | 68 |
| 2.7 | 74.2 |
| 76.7 | 62.7 |
| 4.1 | 70.1 |
| 10.4 | 72.5 |
| 4.9 | 73.9 |
| 1.8 | 64.4 |
| 6.5 | 72.7 |
| 14.5 | 69.8 |
| 16.2 | 67.5 |
| 3.0 | 69.9 |
| 3.4 | 68.2 |
| 2.8 | 73.9 |
| 48.0 | 58.9 |
| 5.7 | 61.2 |
| 2.9 | 71.8 |
| 6.9 | 68.9 |
| 9.2 | 59.3 |
| 4.4 | 56 |
| 2.8 | 60 |
| 2.8 | 66.9 |
| 2.2 | 67.7 |
| 2.6 | 58.1 |
| 2.7 | 70.4 |
| 5.2 | 69 |
| 51.8 | 65.4 |
| 4.3 | 66.2 |
| 3.9 | 61.4 |
| 5.5 | 66.3 |
| 4.0 | 67.1 |
| 4.5 | 67.4 |
| 2.4 | 37.9 |
| 73.9 | 67.8 |
| 54.4 | 66.8 |
| 3.0 | 68.2 |
| 3.3 | 40.6 |
| 4.9 | 63.6 |
| 2.0 | 72.8 |
| 35.6 | 72.7 |
| 60.5 | 66.3 |
| 12.0 | 67.4 |
| 21.4 | 68.5 |
| 43.7 | 72.4 |
| 3.5 | 70.5 |
| 4.5 | 72.9 |
| 1.8 | 68.5 |
| 54.5 | 71.1 |
| 35.7 | 66.7 |
| 3.7 | 67.1 |
| 3.3 | 69.9 |
| 2.8 | 71 |
| 58.2 | 71 |
| 3.3 | 69 |
| 4.5 | 73.3 |
| 3.1 | 68.5 |
| 3.8 | 69.9 |
| 3.2 | 72.9 |
| 43.2 | 59.8 |
| 3.2 | 68.9 |
| 3.0 | 72.4 |
| 2.8 | 64.6 |
| 3.4 | 66.5 |
| 3.7 | 68.7 |
| 2.3 | 67.8 |
| 11.8 | 66.4 |
| 9.7 | 66.5 |
| 22.0 | 64.7 |
| 4.3 | 71.9 |
| 3.4 | 68.9 |
| 2.6 | 69.1 |
| 92.9 | 69.9 |
| 33.0 | 66 |
| 40.0 | 70.7 |
| 12.4 | 70.6 |
| 4.5 | 70.3 |
| 5.7 | 66.8 |
| 4.0 | 70.7 |
| 3.1 | 63.3 |
| 50.8 | 68.7 |
| 4.5 | 69.2 |
| 3.5 | 75 |
| 49.8 | 65.8 |
| 6.9 | 64.2 |
| 2.3 | 67.8 |
| 3.1 | 70 |
| 3.3 | 62.2 |
| 3.3 | 70.6 |
| 31.5 | 72.9 |
| 58.7 | 64.8 |
| 2.3 | 65.6 |
| 4.8 | 68.5 |
| 1.7 | 72.1 |
| 2.8 | 64.1 |
| 53.3 | 67.8 |
| 8.5 | 63.8 |
| 2.6 | 63.8 |
| 9.0 | 66 |
| 5.8 | 62.8 |
| 5.4 | 70.6 |
| 3.1 | 69.7 |
| 4.3 | 69 |
| 49.8 | 66.7 |
| 9.0 | 64.1 |
| 2.6 | 73 |
| 58.7 | 69.4 |
| 4.3 | 72.8 |
| 48.2 | 65.8 |
| 5.4 | 63.7 |
| 22.0 | 67 |
| 2.9 | 71 |
| 34.2 | 65.6 |
| 17.9 | 68.6 |
| 23.2 | 70.4 |
| 4.3 | 73.6 |
| 4.9 | 73.2 |
| 50.9 | 64.6 |
| 17.6 | 69.4 |
| 2.3 | 63.9 |
| 2.2 | 69 |
| 1.7 | 63.8 |
| 4.9 | 72.6 |
| 4.3 | 72.3 |
| 12.9 | 69.9 |
| 47.5 | 66.5 |
| 2.2 | 71.4 |
| 2.8 | 65.4 |
| 49.7 | 65.6 |
| 4.9 | 67.9 |
| 3.0 | 64.5 |
| 4.1 | 62.8 |
| 2.5 | 64.3 |
| 26.2 | 67.1 |
| 15.6 | 69.8 |
| 49.2 | 60.8 |
| 49.2 | 64.6 |
| 19.1 | 66.8 |
| 3.5 | 59.2 |
| 3.3 | 67.9 |
| 2.5 | 56.9 |
| 3.0 | 74.2 |
| 2.4 | 70.4 |
| 41.4 | 64.7 |
| 22.4 | 74.6 |
| 5.3 | 61.5 |
| 4.2 | 58.3 |
| 4.3 | 67.8 |
| 3.7 | 71.9 |
| 2.8 | 62.1 |
| 2.8 | 60.5 |
| 3.0 | 58.7 |
| 19.3 | 70.5 |
| 2.8 | 58.9 |
| 63.0 | 68.1 |
| 3.6 | 68.9 |
| 12.0 | 71.9 |
| 3.8 | 61.4 |
| 3.2 | 72.1 |
| 9.7 | 58.5 |
| 3.4 | 67.7 |
| 64.8 | 64.2 |
| 3.6 | 73.5 |
| 14.9 | 67.5 |
| 1.7 | 66.2 |
| 2.8 | 74.6 |
| 37.0 | 66.3 |
| 54.2 | 72.6 |
| 25.3 | 70.9 |
| 65.6 | 57.7 |
| 4.2 | 61.6 |
| 4.0 | 66 |
| 6.7 | 65.8 |
| 30.3 | 68.5 |
| 18.8 | 68.2 |
| 7.3 | 74 |
| 4.9 | 64.4 |
| 4.2 | 66.8 |
| 3.2 | 60.7 |
| 3.7 | 69.4 |
| 2.9 | 69 |
| 4.2 | 72.7 |
| 4.2 | 71.5 |
| 1.9 | 46.6 |
| 56.5 | 65.9 |
| 3.3 | 62.5 |
| 4.6 | 70.7 |
| 70.3 | 69.2 |
| 47.5 | 67.2 |
| 3.5 | 68.3 |
| 5.8 | 74.6 |
| 4.4 | 74.2 |
| 8.0 | 67.2 |
| 31.6 | 68 |
| 33.2 | 67.5 |
| 5.1 | 64.8 |
| 10.0 | 66.5 |
| 5.7 | 66.8 |
| 27.4 | 72.4 |
| 27.8 | 64.5 |
| 57.3 | 67.9 |
| 9.5 | 64.7 |
| 3.3 | 70.5 |
| 2.7 | 71.5 |
| 3.8 | 75 |
| 36.0 | 66.7 |
| 30.6 | 67.5 |
| 3.9 | 60.5 |
| 3.6 | 68.8 |
| 2.7 | 62.8 |
| 3.3 | 57.6 |
| 76.9 | 64.7 |
| 39.5 | 56.7 |
| 55.8 | 66.4 |
| 15.9 | 74.4 |
| 7.0 | 67.1 |
| 3.5 | 66.5 |
| 2.9 | 59 |
| 2.4 | 68 |
| 3.2 | 74.6 |
| 8.3 | 64.7 |
| 29.8 | 67.4 |
| 11.8 | 69.2 |
| 55.0 | 68.1 |
| 54.7 | 68.8 |
| 3.3 | 74.2 |
| 41.8 | 73.1 |
| 3.7 | 57.6 |
| 2.7 | 63 |
| 2.8 | 70.3 |
| 4.9 | 70.3 |
| 5.5 | 74.8 |
| 39.6 | 67.8 |
| 4.5 | 65.7 |
| 51.5 | 67.3 |
| 4.5 | 63.5 |
| 19.3 | 68.7 |
| 5.7 | 63.6 |
| 3.2 | 70.5 |
| 11.0 | 67.3 |
| 3.4 | 73.2 |
| 42.6 | 66.2 |
| 46.6 | 68 |
| 45.1 | 65.5 |
| 3.0 | 72.9 |
| 30.0 | 74.8 |
| 1.3 | 70 |
| 38.8 | 67.4 |
| 2.3 | 64.1 |
| 4.3 | 43.2 |
| 2.5 | 67.5 |
| 15.8 | 74.1 |
| 5.0 | 57.2 |
| 5.1 | 71.4 |
| 2.6 | 64.7 |
| 53.3 | 66.7 |
| 3.7 | 65.9 |
| 3.9 | 58.9 |
| 4.9 | 65.1 |
| 3.7 | 73.9 |
| 2.4 | 64.4 |
| 3.7 | 64 |
| 4.1 | 69.3 |
| 3.8 | 55.6 |
| 5.8 | 73.4 |
| 4.7 | 67.8 |
| 2.4 | 71.6 |
| 8.0 | 64.9 |
| 70.8 | 66.3 |
| 3.3 | 73.8 |
| 22.9 | 71.2 |
| 4.2 | 65.9 |
| 4.9 | 69.3 |
| 5.6 | 75.3 |
| 6.6 | 71.8 |
| 2.8 | 71.9 |
| 10.4 | 68.6 |
| 1.9 | 56.3 |
| 4.9 | 74 |
| 3.0 | 71.9 |
| 40.5 | 71.2 |
| 3.0 | 62.6 |
| 2.2 | 66.1 |
| 61.3 | 64 |
| 9.2 | 64.4 |
| 6.7 | 66.6 |
| 49.6 | 69.1 |
| 54.0 | 63.8 |
| 3.6 | 67.8 |
| 3.3 | 75.3 |
| 21.9 | 68.1 |
| 17.3 | 72.1 |
| 2.9 | 70.3 |
| 2.2 | 72.9 |
| 2.7 | 71.4 |
| 2.5 | 52.5 |
| 3.6 | 66.2 |
| 4.4 | 72.6 |
| 4.1 | 70.3 |
| 3.9 | 68.7 |
| 3.6 | 72 |
| 3.1 | 68.3 |
| 13.8 | 70.4 |
| 47.5 | 63.7 |
| 3.8 | 66.7 |
| 2.0 | 59.5 |
| 2.3 | 57.7 |
| 2.2 | 58.6 |
| 13.4 | 66.7 |
| 3.5 | 71.6 |
| 6.2 | 65.6 |
| 5.0 | 57.4 |
| 3.9 | 62.1 |
| 4.0 | 66.8 |
| 5.3 | 71.9 |
| 2.4 | 62.6 |
| 2.7 | 71.5 |
| 4.1 | 71.2 |
| 3.2 | 75 |
| 5.5 | 64.9 |
| 3.7 | 64.3 |
| 2.6 | 74.1 |
| 35.1 | 66.9 |
| 3.0 | 70.5 |
| 4.6 | 69.7 |
| 117.3 | 50 |
| 3.5 | 69 |
| 8.4 | 68.5 |
| 3.7 | 54.1 |
| 3.0 | 73.1 |
| 4.7 | 59.2 |
| 19.1 | 74 |
| 31.5 | 70.1 |
| 3.8 | 61 |
| 6.7 | 66.1 |
| 4.6 | 67.3 |
| 2.3 | 66.6 |
| 2.0 | 73.4 |
| 4.4 | 66.7 |
| 35.5 | 65.8 |
| 47.9 | 71.4 |
| 46.3 | 63.9 |
| 32.7 | 69.2 |
| 5.9 | 65.1 |
| 2.8 | 60.7 |
| 3.1 | 69.3 |
| 3.1 | 68.4 |
| 3.6 | 63.1 |
| 3.8 | 70.5 |
| 2.7 | 64.1 |
| 3.9 | 72.8 |
| 2.6 | 73.3 |
| 60.2 | 68.8 |
| 10.1 | 59.5 |
| 1.8 | 67.3 |
| 4.2 | 77.1 |
| 2.9 | 61.1 |
| 37.8 | 69.5 |
| 2.1 | 67.7 |
| 2.2 | 68 |
| 3.6 | 70.8 |
| 2.7 | 71.9 |
| 4.2 | 71.2 |
| 3.5 | 70.5 |
| 7.3 | 55.6 |
| 3.6 | 68.9 |
| 3.3 | 73.8 |
| 2.5 | 74.1 |
| 3.2 | 62.6 |
| 5.0 | 67.7 |
| 38.4 | 74.2 |
| 18.0 | 68.6 |
| 3.6 | 72.6 |
| 24.5 | 66.1 |
| 3.8 | 70.8 |
| 42.0 | 67.7 |
| 3.5 | 63 |
| 3.2 | 61.1 |
| 4.5 | 62.1 |
| 4.6 | 52.6 |
| 3.7 | 63.3 |
| 2.9 | 51.6 |
| 4.8 | 73.3 |
| 52.5 | 67.6 |
| 3.3 | 71.5 |
| 50.7 | 68.8 |
| 3.0 | 70.4 |
| 3.8 | 71.2 |
| 5.3 | 66.6 |
| 4.5 | 66.1 |
| 7.6 | 66.2 |
| 6.8 | 66.3 |
| 2.6 | 66 |
| 2.6 | 64.7 |
| 3.8 | 61 |
| 2.3 | 70.4 |
| 3.5 | 71.3 |
| 2.7 | 70.3 |
| 3.7 | 62.1 |
| 4.0 | 72.5 |
| 3.8 | 71.4 |
| 3.3 | 68.2 |
| 4.1 | 67 |
| 35.5 | 67.7 |
| 3.9 | 70.9 |
| 4.3 | 70.4 |
| 3.0 | 69.4 |
| 2.9 | 72.7 |
| 4.1 | 70.4 |
| 12.3 | 69.6 |
| 9.0 | 66.7 |
| 3.2 | 69.5 |
| 33.1 | 68.9 |
| 4.3 | 72 |
| 2.3 | 71.3 |
| 4.6 | 67.9 |
| 5.2 | 63.8 |
| 4.5 | 71.4 |
| 3.3 | 72.1 |
| 3.4 | 60.2 |
| 44.5 | 67.7 |
| 3.4 | 70.2 |
| 10.5 | 69.1 |
| 9.7 | 71.7 |
| 4.4 | 48.3 |
| 22.9 | 72.1 |
| 4.0 | 71.5 |
| 51.5 | 66.3 |
| 2.2 | 61.3 |
| 3.0 | 70.8 |
| 13.3 | 71 |
| 3.3 | 71.1 |
| 5.2 | 65.6 |
| 3.3 | 67.9 |
| 57.7 | 66.3 |
| 43.9 | 62.2 |
| 3.3 | 68.4 |
| 3.5 | 72.4 |
| 3.8 | 73.4 |
| 2.2 | 70.8 |
| 2.6 | 74 |
| 2.7 | 71.5 |
| 63.8 | 59.4 |
| 24.6 | 70.1 |
| 15.1 | 67.9 |
| 3.2 | 68.2 |
| 3.3 | 75 |
| 2.6 | 74.2 |
| 44.6 | 65.3 |
| 7.7 | 68.8 |
| 2.9 | 70.6 |
| 33.5 | 70.3 |
| 1.7 | 65.6 |
| 13.4 | 69 |
| 12.1 | 63.1 |
| 2.2 | 64.3 |
| 3.4 | 67 |
| 2.6 | 61.1 |
| 127.2 | 64.1 |
| 3.9 | 69.3 |
| 2.6 | 71.3 |
| 4.4 | 70.9 |
| 2.8 | 66.3 |
| 46.3 | 62.2 |
| 62.3 | 67.6 |
| 82.0 | 67.3 |
| 54.0 | 65.9 |
| 3.3 | 72.1 |
| 3.2 | 73.7 |
| 4.0 | 65.5 |
| 3.2 | 75.5 |
| 4.4 | 72.3 |
| 49.3 | 64.9 |
| 22.9 | 67.3 |
| 10.1 | 67.7 |
| 52.8 | 65.1 |
| 6.0 | 65.7 |
| 209.8 | 64.4 |
| 41.2 | 67.8 |
| 3.5 | 65.3 |
| 5.2 | 51.4 |
| 13.6 | 62.8 |
| 7.4 | 66.1 |
| 55.8 | 67.3 |
| 2.2 | 61.7 |
| 2.6 | 67.2 |
| 2.8 | 69.9 |
| 4.2 | 74.9 |
| 3.0 | 67.8 |
| 51.2 | 66.4 |
| 3.1 | 56.1 |
| 3.3 | 70.6 |
| 3.4 | 71.2 |
| 5.4 | 73.7 |
| 4.6 | 71.9 |
| 2.8 | 71.3 |
| 62.8 | 62.5 |
| 4.7 | 68.3 |
| 5.0 | 70.1 |
| 1.2 | 63.1 |
| 46.2 | 64.9 |
| 4.8 | 68.4 |
| 68.1 | 63.9 |
| 2.1 | 59.8 |
| 2.2 | 72.6 |
| 2.3 | 72.1 |
| 3.4 | 65.6 |
| 3.2 | 60 |
| 4.1 | 64.8 |
| 2.7 | 68 |
| 45.4 | 66.4 |
| 52.0 | 66.6 |
| 2.6 | 72.4 |
| 3.0 | 65.9 |
| 2.5 | 52.7 |
| 3.7 | 71.7 |
| 3.9 | 71.3 |
| 3.4 | 67.7 |
| 3.1 | 70.6 |
| 3.7 | 69.2 |
| 2.6 | 64.5 |
| 40.5 | 67 |
| 15.5 | 68.7 |
| 2.9 | 59.1 |
| 48.7 | 66.4 |
| 4.5 | 65.6 |
| 22.6 | 70.1 |
| 27.9 | 64.2 |
| 28.2 | 63.6 |
| 2.7 | 71.4 |
| 24.2 | 67 |
| 3.5 | 72 |
| 38.8 | 67.2 |
| 1.9 | 54.9 |
| 50.6 | 64.8 |
| 21.8 | 67.6 |
| 3.4 | 58.9 |
| 37.1 | 66.5 |
| 3.5 | 67.2 |
| 4.5 | 70.3 |
| 82.2 | 65.6 |
| 4.0 | 48.4 |
| 4.8 | 73.4 |
| 1.5 | 66.7 |
| 3.3 | 71.5 |
| 52.6 | 64.9 |
| 53.4 | 65.6 |
| 3.0 | 70.1 |
| 5.1 | 75.6 |
| 3.7 | 62.2 |
| 1.9 | 69.1 |
| 2.5 | 72.6 |
| 3.3 | 72.6 |
| 1.9 | 70 |
| 4.2 | 72.2 |
| 3.7 | 69.5 |
| 3.1 | 71.3 |
| 2.5 | 74.2 |
| 37.7 | 69.4 |
| 60.2 | 72.8 |
| 3.4 | 64.8 |
| 1.8 | 62.6 |
| 3.1 | 72.6 |
| 4.1 | 73.9 |
| 41.7 | 66.3 |
| 3.0 | 73.3 |
| 2.6 | 65 |
| 10.3 | 66.8 |
| 46.7 | 68.3 |
| 14.2 | 71.5 |
| 2.8 | 59.1 |
| 3.8 | 65.4 |
| 25.9 | 72.5 |
| 2.4 | 67 |
| 2.6 | 65.7 |
| 2.5 | 69.6 |
| 242.2 | 63.5 |
| 2.6 | 60.9 |
| 4.4 | 69 |
| 3.2 | 70.9 |
| 5.7 | 71 |
| 2.6 | 61 |
| 2.9 | 67.1 |
| 3.4 | 65.9 |
| 4.2 | 70.3 |
| 4.0 | 63.4 |
| 3.0 | 68.8 |
| 57.8 | 65.6 |
| 51.0 | 68.5 |
| 15.2 | 70.3 |
| 3.9 | 71.4 |
| 43.0 | 70.1 |
| 36.2 | 71.2 |
| 3.1 | 61 |
| 2.5 | 65.1 |
| 3.1 | 68.9 |
| 56.5 | 71.1 |
| 3.8 | 52.3 |
| 2.4 | 71.5 |
| 4.0 | 59.3 |
| 47.3 | 65.5 |
| 23.8 | 63.6 |
| 3.6 | 73.5 |
| 3.3 | 60.5 |
| 2.9 | 70.3 |
| 27.9 | 69.6 |
| 3.7 | 69.5 |
| 52.3 | 63.7 |
| 54.6 | 70.8 |
| 4.3 | 63.6 |
| 4.5 | 70.4 |
| 5.1 | 72.7 |
| 16.0 | 72.5 |
| 2.7 | 71.5 |
| 32.0 | 73 |
| 4.3 | 55.8 |
| 8.5 | 60.2 |
| 22.1 | 70.4 |
| 3.7 | 72.2 |
| 49.3 | 70.7 |
| 3.0 | 67.3 |
| 40.3 | 68.5 |
| 3.7 | 65.1 |
| 38.9 | 63.8 |
| 57.9 | 66.2 |
| 4.5 | 65.7 |
| 3.2 | 68.1 |
| 4.1 | 66.2 |
| 3.4 | 73.7 |
| 3.2 | 66.1 |
| 3.3 | 75.6 |
| 6.9 | 67.4 |
| 37.3 | 72.6 |
| 13.2 | 67.4 |
| 4.1 | 72.6 |
| 6.8 | 71.2 |
| 52.8 | 69.2 |
| 9.5 | 72.6 |
| 5.2 | 71 |
| 5.1 | 69.1 |
| 3.5 | 67.3 |
| 32.1 | 69.6 |
| 13.6 | 61.1 |
| 3.4 | 70.2 |
| 48.6 | 62.7 |
| 56.0 | 68.6 |
| 42.7 | 69.7 |
| 4.6 | 72.9 |
| 21.5 | 71.5 |
| 10.0 | 63.6 |
| 56.9 | 69.1 |
| 3.2 | 64.9 |
| 3.1 | 68.7 |
| 4.4 | 65.5 |
| 2.4 | 70.9 |
| 3.9 | 63.9 |
| 52.0 | 71.1 |
| 53.9 | 65.6 |
| 50.6 | 69.4 |
| 41.6 | 65.6 |
| 44.4 | 63.1 |
| 48.5 | 67.4 |
| 6.4 | 69.6 |
| 3.0 | 66.3 |
| 15.8 | 71.2 |
| 2.4 | 62.9 |
| 3.9 | 66.8 |
| 3.1 | 69.9 |
| 5.5 | 71.6 |
| 10.4 | 67.4 |
| 3.3 | 70.2 |
| 4.3 | 63.8 |
| 40.5 | 72.8 |
| 4.1 | 56.5 |
| 3.6 | 73 |
| 3.8 | 70.1 |
| 2.6 | 73 |
| 7.0 | 57 |
| 1.8 | 56.8 |
| 3.3 | 71.6 |
| 3.0 | 72 |
| 51.3 | 73.9 |
| 4.7 | 71.2 |
| 4.7 | 69 |
| 2.4 | 63.7 |
| 3.7 | 72.1 |
| 2.4 | 59.6 |
| 1.7 | 61.7 |
| 4.5 | 68 |
| 14.9 | 68.3 |
| 5.0 | 64.3 |
| 4.7 | 55.3 |
| 1.3 | 62.4 |
| 2.9 | 70 |
| 5.7 | 69.2 |
| 3.1 | 54.5 |
| 2.4 | 73.2 |
| 22.3 | 67.2 |
| 35.4 | 66.6 |
| 3.0 | 70.3 |
| 2.7 | 70.3 |
| 3.8 | 74.6 |
| 52.4 | 66.7 |
| 40.1 | 63.1 |
| 3.4 | 65.8 |
| 28.2 | 66.3 |
| 3.7 | 71.2 |
| 2.9 | 71.9 |
| 33.6 | 73.6 |
| 2.9 | 62.9 |
| 2.9 | 65.1 |
| 3.9 | 69.6 |
| 47.5 | 69.7 |
| 2.0 | 65.7 |
| 49.0 | 66 |
| 3.3 | 52.5 |
| 2.4 | 74 |
| 52.7 | 68.6 |
| 2.1 | 68.3 |
| 5.2 | 72.6 |
| 44.8 | 67.5 |
| 3.7 | 74.6 |
| 44.6 | 61.8 |
| 3.3 | 58.6 |
| 2.8 | 62.4 |
| 2.8 | 72 |
| 3.0 | 65 |
| 38.3 | 71.1 |
| 10.0 | 66.7 |
| 72.9 | 66.5 |
| 2.3 | 59.8 |
| 2.2 | 71.5 |
| 4.0 | 70 |
| 6.1 | 70.4 |
| 3.7 | 73 |
| 2.9 | 57.7 |
| 2.7 | 62.1 |
| 20.4 | 63 |
| 44.2 | 61 |
| 3.5 | 70.2 |
| 4.5 | 72.7 |
| 34.7 | 66.8 |
| 3.2 | 72.4 |
| 34.7 | 67.9 |
| 27.1 | 65.7 |
| 2.9 | 61.4 |
| 3.2 | 69.5 |
| 4.3 | 73.9 |
| 2.2 | 72.7 |
| 14.3 | 73.8 |
| 2.8 | 69.8 |
| 3.1 | 68.4 |
| 20.4 | 65.2 |
| 2.3 | 63.5 |
| 51.4 | 63.5 |
| 15.9 | 68.5 |
| 7.7 | 62.3 |
| 3.7 | 58.8 |
| 4.5 | 70.4 |
| 53.0 | 67.4 |
| 4.0 | 63.8 |
| 2.9 | 66.1 |
| 3.5 | 67.6 |
| 6.0 | 63.7 |
| 3.4 | 70.3 |
| 3.0 | 61.2 |
| 6.3 | 67.5 |
| 4.7 | 70.4 |
| 41.9 | 68.4 |
| 3.8 | 56.6 |
| 53.6 | 66.9 |
| 3.2 | 69.4 |
| 14.9 | 68.6 |
| 4.0 | 68.8 |
| 20.1 | 74.9 |
| 65.4 | 63.2 |
| 13.2 | 67.6 |
| 6.7 | 60.8 |
| 4.0 | 67.3 |
| 3.9 | 74.1 |
| 7.4 | 60.7 |
| 3.3 | 61.6 |
| 2.8 | 63.1 |
| 3.4 | 69.7 |
| 7.6 | 65.1 |
| 57.8 | 66 |
| 41.9 | 69.5 |
| 42.8 | 65.9 |
| 49.3 | 69.9 |
| 3.0 | 67.1 |
| 4.6 | 69.5 |
| 72.7 | 67.7 |
| 3.3 | 72.4 |
| 14.3 | 67.4 |
| 3.5 | 57.4 |
| 1.4 | 67.4 |
| 3.4 | 65.9 |
| 2.8 | 67.7 |
| 2.9 | 68.8 |
| 3.4 | 66.5 |
| 23.0 | 68.8 |
| 7.6 | 68.5 |
| 22.4 | 69.2 |
| 3.2 | 74.4 |
| 2.4 | 72.2 |
| 7.7 | 63.7 |
| 3.5 | 45.3 |
| 3.9 | 70.7 |
| 2.9 | 75.7 |
| 33.8 | 61.9 |
| 49.2 | 67.7 |
| 3.7 | 57.3 |
| 6.3 | 53.5 |
| 4.8 | 74.2 |
| 1.1 | 59 |
| 6.8 | 68 |
| 2.8 | 70 |
| 1.2 | 54.2 |
| 8.8 | 65.7 |
| 37.5 | 62.2 |
| 41.5 | 68.4 |
| 287.8 | 55.1 |
| 3.0 | 70.7 |
| 4.0 | 57.7 |
| 437.3 | 54.3 |
| 4.2 | 69.4 |
| 3.0 | 72.5 |
| 3.5 | 66.6 |
| 3.1 | 67.6 |
| 5.2 | 74.1 |
| 61.4 | 68.2 |
| 2.7 | 68.2 |
| 3.7 | 70.5 |
| 4.8 | 73.4 |
| 53.7 | 66 |
| 14.8 | 69 |
| 3.8 | 72.5 |
| 3.3 | 71.4 |
| 2.6 | 69.9 |
| 4.0 | 73.8 |
| 15.4 | 68.9 |
| 36.8 | 56.6 |
| 4.3 | 65.4 |
| 38.1 | 60 |
| 11.4 | 66.8 |
| 5.7 | 52.7 |
| 2.3 | 66.9 |
| 6.0 | 72.8 |
| 3.3 | 68.1 |
| 2.6 | 69.8 |
| 35.8 | 65.6 |
| 51.7 | 70.1 |
| 2.4 | 71.1 |
| 10.2 | 63.8 |
| 30.1 | 67.5 |
| 2.1 | 60.9 |
| 35.1 | 74.8 |
| 42.4 | 60.4 |
| 5.6 | 67.9 |
| 4.7 | 67.8 |
| 3.9 | 68.4 |
| 11.9 | 73.3 |
| 2.5 | 72.8 |
| 4.4 | 73.7 |
| 21.7 | 65.7 |
| 2.2 | 69.6 |
| 4.0 | 74.6 |
| 8.6 | 73.1 |
| 3.3 | 68.4 |
| 44.4 | 64.8 |
| 2.9 | 73.5 |
| 2.8 | 72.3 |
| 2.4 | 71.5 |
| 4.4 | 70.5 |
| 2.9 | 71.3 |
| 4.6 | 71.1 |
| 47.0 | 66.8 |
| 3.7 | 69.9 |
| 2.5 | 66.8 |
| 7.4 | 63.8 |
| 2.9 | 71.1 |
| 2.6 | 73.3 |
| 3.8 | 72.2 |
| 10.8 | 68.1 |
| 3.5 | 68 |
| 49.9 | 64.6 |
| 7.0 | 67.8 |
| 3.7 | 62.2 |
| 3.2 | 71.3 |
| 2.4 | 56.2 |
| 2.7 | 62.8 |
| 4.7 | 64.9 |
| 4.4 | 58.3 |
| 3.9 | 69.5 |
| 30.8 | 67.7 |
| 7.7 | 71.3 |
| 4.1 | 69.9 |
| 4.8 | 69.9 |
| 4.2 | 70.3 |
| 2.6 | 65.5 |
| 3.8 | 71.3 |
| 22.4 | 70.3 |
| 1.7 | 58.9 |
| 4.4 | 71.5 |
| 3.1 | 71.9 |
| 3.1 | 73.6 |
| 5.2 | 73 |
| 39.1 | 63.9 |
| 4.6 | 71.4 |
| 4.0 | 62.7 |
| 42.1 | 68.9 |
| 8.2 | 73.1 |
| 4.7 | 56.7 |
| 2.3 | 68.2 |
| 4.2 | 57.1 |
| 3.1 | 74.2 |
| 60.4 | 66.6 |
| 5.9 | 62.8 |
| 5.4 | 71.6 |
| 67.4 | 68.3 |
| 3.3 | 48.7 |
| 50.1 | 66.1 |
| 2.5 | 73.2 |
| 2.8 | 65.7 |
| 2.9 | 64.6 |
| 2.9 | 67.1 |
| 3.4 | 69.2 |
| 3.2 | 70.6 |
| 5.1 | 74.2 |
| 4.8 | 67.2 |
| 2.5 | 68.6 |
| 67.2 | 66.3 |
| 31.8 | 68.4 |
| 1.8 | 64 |
| 4.0 | 69.9 |
| 2.4 | 65 |
| 2.8 | 68.5 |
| 3.4 | 76.2 |
| 2.8 | 59.2 |
| 3.2 | 60.7 |
| 5.6 | 58.4 |
| 63.2 | 66.2 |
| 4.9 | 62 |
| 2.5 | 65.4 |
| 24.7 | 69 |
| 21.6 | 53.7 |
| 1.6 | 50.3 |
| 4.1 | 63.3 |
| 4.3 | 61 |
| 6.3 | 67.8 |
| 3.0 | 69 |
| 3.4 | 71.8 |
| 2.2 | 61.7 |
| 47.0 | 66.3 |
| 17.2 | 68.5 |
| 2.3 | 68.5 |
| 3.3 | 71.5 |
| 3.1 | 70.7 |
| 5.1 | 68.6 |
| 6.6 | 67.9 |
| 12.1 | 72.1 |
| 7.5 | 59.8 |
| 18.2 | 75.9 |
| 3.5 | 63.8 |
| 3.1 | 62.4 |
| 2.9 | 61.1 |
| 4.5 | 65.1 |
| 2.7 | 58.5 |
| 3.4 | 71.5 |
| 2.9 | 60.6 |
| 2.4 | 62.6 |
| 52.4 | 67.7 |
| 4.2 | 68.9 |
| 4.1 | 63.3 |
| 26.1 | 70.1 |
| 4.7 | 72.1 |
| 2.2 | 63.7 |
| 25.0 | 70.2 |
| 5.7 | 68.2 |
| 4.8 | 55.7 |
| 4.4 | 63.1 |
| 2.4 | 50.7 |
| 3.4 | 47.6 |
| 48.7 | 68.4 |
| 3.4 | 71.9 |
| 9.0 | 67 |
| 59.2 | 67.2 |
| 5.9 | 57 |
| 2.3 | 66.7 |
| 54.8 | 58.9 |
| 5.7 | 70.7 |
| 3.0 | 65.6 |
| 2.0 | 62.3 |
| 2.5 | 56.1 |
| 74.3 | 63 |
| 3.0 | 72.9 |
| 54.2 | 62 |
| 13.5 | 68.9 |
| 52.5 | 68.7 |
| 2.4 | 60.2 |
| 5.5 | 67.4 |
| 8.2 | 67.7 |
| 3.3 | 63.2 |
| 2.7 | 70.6 |
| 5.2 | 63.3 |
| 50.8 | 68.8 |
| 8.2 | 54.2 |
| 48.6 | 68.3 |
| 7.9 | 66.6 |
| 82.7 | 67.7 |
| 6.2 | 73.2 |
| 4.5 | 76.7 |
| 64.9 | 57 |
| 37.0 | 65 |
| 22.4 | 64.9 |
| 3.1 | 61.2 |
| 3.6 | 70.3 |
| 2.8 | 71 |
| 1.9 | 70.2 |
| 3.1 | 65.3 |
| 44.0 | 67.5 |
| 3.7 | 58 |
| 38.3 | 74.1 |
| 45.7 | 68.2 |
| 16.4 | 73.4 |
| 4.0 | 72.3 |
| 46.9 | 61.3 |
| 4.2 | 59.9 |
| 2.3 | 63.8 |
| 4.0 | 75.6 |
| 42.8 | 67.8 |
| 12.9 | 70.9 |
| 41.3 | 64.9 |
| 64.5 | 59.6 |
| 4.1 | 70 |
| 3.3 | 60.4 |
| 3.3 | 71 |
| 3.4 | 65.6 |
| 4.1 | 69.3 |
| 2.4 | 66.7 |
| 2.3 | 63.6 |
| 21.6 | 66.9 |
| 22.3 | 73.1 |
| 50.6 | 68.3 |
| 2.9 | 60.3 |
| 8.7 | 62.6 |
| 3.3 | 65.3 |
| 2.6 | 66.3 |
| 56.3 | 65.1 |
| 26.9 | 71.9 |
| 3.4 | 70.6 |
| 7.0 | 69.6 |
| 3.1 | 68.7 |
| 3.6 | 63.2 |
| 13.5 | 67.7 |
| 4.0 | 59.9 |
| 3.0 | 67.4 |
| 5.1 | 71.9 |
| 3.8 | 52.9 |
| 45.6 | 69.5 |
| 39.4 | 63.2 |
| 5.3 | 65.8 |
| 3.0 | 72.1 |
| 4.2 | 74.6 |
| 43.9 | 65.5 |
| 17.8 | 68.8 |
| 55.1 | 67.5 |
| 2.8 | 64.9 |
| 4.6 | 69 |
| 6.3 | 67.7 |
| 26.3 | 68.6 |
| 2.8 | 73.2 |
| 5.7 | 72.8 |
| 37.1 | 64.4 |
| 4.8 | 72.1 |
| 4.1 | 60.9 |
| 7.8 | 67.8 |
| 2.9 | 74.8 |
| 2.3 | 67.3 |
| 2.3 | 68.2 |
| 4.3 | 64.9 |
| 2.1 | 66.4 |
| 3.5 | 60.7 |
| 2.7 | 70.1 |
| 3.8 | 65.6 |
| 3.2 | 62.4 |
| 4.1 | 75.2 |
| 20.3 | 72.9 |
| 2.8 | 64.6 |
| 3.1 | 72.1 |
| 3.5 | 72.9 |
| 3.1 | 70 |
| 59.6 | 71 |
| 33.6 | 69.4 |
| 32.5 | 68.7 |
| 2.2 | 61.1 |
| 2.2 | 64.9 |
| 2.5 | 66.3 |
| 2.6 | 66.4 |
| 3.0 | 71 |
| 5.3 | 65 |
| 5.0 | 72.4 |
| 2.3 | 60.8 |
| 4.3 | 60.5 |
| 51.0 | 59.6 |
| 1.1 | 58.9 |
| 3.5 | 65.5 |
| 2.8 | 68.1 |
| 9.0 | 67.8 |
| 3.9 | 60.6 |
| 2.4 | 68 |
| 3.8 | 69.3 |
| 3.8 | 63.4 |
| 3.7 | 59.7 |
| 3.3 | 72.3 |
| 51.7 | 58.1 |
| 45.1 | 64.2 |
| 3.0 | 73.1 |
| 3.3 | 71.7 |
| 3.2 | 73.1 |
| 3.9 | 65.7 |
| 3.5 | 51.3 |
| 15.4 | 60.9 |
| 7.3 | 63.4 |
| 84.1 | 67 |
| 2.3 | 69.7 |
| 3.5 | 72.5 |
| 43.5 | 72 |
| 1.4 | 65 |
| 4.8 | 72.2 |
| 5.3 | 68.5 |
| 3.3 | 66.8 |
| 4.7 | 73.7 |
| 8.5 | 65.1 |
| 2.9 | 72.5 |
| 6.5 | 63.6 |
| 2.8 | 75.2 |
| 11.9 | 71.5 |
| 4.1 | 70 |
| 26.3 | 62.7 |
| 3.0 | 62.3 |
| 2.0 | 59 |
| 34.1 | 67.1 |
| 66.8 | 66.9 |
| 2.9 | 62.5 |
| 4.0 | 64.8 |
| 4.0 | 58.6 |
| 3.2 | 58.1 |
| 25.2 | 68 |
| 2.7 | 58.2 |
| 5.4 | 68.4 |
| 4.3 | 64.5 |
| 53.9 | 65.8 |
| 51.1 | 65 |
| 50.0 | 67.1 |
| 3.4 | 69 |
| 2.1 | 72.2 |
| 3.3 | 70.4 |
| 9.5 | 62 |
| 36.4 | 71.2 |
| 2.4 | 60.8 |
| 50.6 | 63.3 |
| 3.5 | 49.1 |
| 20.8 | 65 |
| 3.4 | 60.3 |
| 2.1 | 69.6 |
| 36.5 | 65.8 |
| 8.1 | 63.9 |
| 3.1 | 71.9 |
| 48.6 | 65.9 |
| 4.0 | 70.5 |
| 3.9 | 58 |
| 6.9 | 66.7 |
| 3.4 | 67.2 |
| 4.5 | 63.9 |
| 2.8 | 48.5 |
| 2.1 | 70.4 |
| 22.7 | 58.4 |
| 47.1 | 65.7 |
| 3.3 | 54.2 |
| 3.6 | 59.2 |
| 39.1 | 66 |
| 3.1 | 72.6 |
| 10.2 | 65.7 |
| 43.2 | 65.1 |
| 3.6 | 72.4 |
| 1.8 | 64.2 |
| 54.3 | 64.6 |
| 4.4 | 58.3 |
| 4.3 | 71.6 |
| 3.3 | 73.8 |
| 3.1 | 75.1 |
| 2.7 | 65.1 |
| 68.4 | 66.3 |
| 5.2 | 73.3 |
| 9.0 | 65.1 |
| 5.7 | 69.9 |
| 38.0 | 65 |
| 1.6 | 60.6 |
| 5.1 | 60.2 |
| 3.4 | 69.1 |
| 3.0 | 70.1 |
| 2.7 | 65.6 |
| 33.0 | 69.3 |
| 22.8 | 69.9 |
| 1.8 | 65.4 |
| 2.5 | 71.6 |
| 3.2 | 56.7 |
| 4.2 | 63.1 |
| 4.1 | 60.6 |
| 5.1 | 64.5 |
| 45.9 | 68.6 |
| 49.9 | 63.1 |
| 4.6 | 68.8 |
| 3.2 | 65.2 |
| 2.8 | 69.4 |
| 2.5 | 62.5 |
| 1.1 | 56.2 |
| 3.3 | 63.4 |
| 2.7 | 68.7 |
| 2.4 | 72.5 |
| 3.3 | 68.2 |
| 7.9 | 58.8 |
| 3.8 | 72.2 |
| 50.4 | 63.7 |
| 1.9 | 65.2 |
| 2.5 | 73.5 |
| 3.4 | 67.9 |
| 4.2 | 70.7 |
| 3.9 | 70.7 |
| 4.2 | 71.9 |
| 21.2 | 69.8 |
| 3.5 | 70.7 |
| 3.1 | 66.8 |
| 8.5 | 68.9 |
| 2.9 | 61.3 |
| 4.1 | 51.7 |
| 4.6 | 72.9 |
| 2.1 | 58.7 |
| 2.5 | 69.7 |
| 5.2 | 68.3 |
| 2.5 | 72.4 |
| 5.4 | 54.2 |
| 4.0 | 72.5 |
| 16.4 | 68.2 |
| 2.2 | 60.6 |
| 3.3 | 68.7 |
| 8.7 | 59.9 |
| 8.8 | 66.8 |
| 2.5 | 41.8 |
| 4.3 | 68 |
| 2.5 | 73.9 |
| 4.6 | 65.1 |
| 2.9 | 64.6 |
| 4.0 | 69.1 |
| 5.6 | 64.8 |
| 4.6 | 69.1 |
| 3.3 | 72.8 |
| 9.2 | 64.9 |
| 2.7 | 72.4 |
| 21.0 | 71.8 |
| 80.0 | 68.8 |
| 58.2 | 66.1 |
| 6.5 | 70.5 |
| 3.3 | 70.6 |
| 3.4 | 66.9 |
| 4.2 | 73.7 |
| 3.8 | 69.2 |
| 3.6 | 72.9 |
| 4.2 | 69.1 |
| 4.8 | 67.7 |
| 3.3 | 70.8 |
| 12.5 | 64.3 |
| 5.3 | 57.6 |
| 65.3 | 71.2 |
| 18.5 | 68.8 |
| 40.2 | 68.6 |
| 16.7 | 62.8 |
| 2.3 | 59 |
| 3.2 | 67.1 |
| 1.9 | 48.4 |
| 6.3 | 72.9 |
| 2.6 | 72 |
| 1.8 | 58.5 |
| 3.1 | 70.3 |
| 5.2 | 68.6 |
| 4.1 | 59.2 |
| 4.3 | 72.3 |
| 2.9 | 71.7 |
| 3.4 | 63.2 |
| 3.4 | 71 |
| 2.4 | 59.1 |
| 7.8 | 68.8 |
| 27.7 | 68.6 |
| 2.9 | 60 |
| 2.4 | 70.2 |
| 3.0 | 70.7 |
| 3.0 | 69.5 |
| 40.7 | 64.4 |
| 3.8 | 72.3 |
| 7.6 | 58.2 |
| 2.8 | 62.3 |
| 3.6 | 65 |
| 4.4 | 69.8 |
| 36.9 | 69.6 |
| 57.1 | 65 |
| 2.7 | 74.1 |
| 2.9 | 70.7 |
| 3.1 | 73.2 |
| 4.6 | 68.1 |
| 5.6 | 73.1 |
| 2.7 | 68 |
| 36.6 | 64.6 |
| 2.4 | 64.4 |
| 3.3 | 71.8 |
| 3.5 | 69.9 |
| 2.6 | 57.6 |
| 87.1 | 54.7 |
| 2.6 | 66.7 |
| 64.9 | 69 |
| 4.5 | 47.6 |
| 13.2 | 68 |
| 2.5 | 70.8 |
| 3.7 | 71.6 |
| 5.6 | 72.8 |
| 2.9 | 73.3 |
| 4.4 | 67.1 |
| 3.2 | 68.5 |
| 21.8 | 68.8 |
| 9.0 | 67.5 |
| 3.7 | 69.6 |
| 3.0 | 61.2 |
| 3.7 | 69.7 |
| 3.0 | 75.9 |
| 13.7 | 52.1 |
| 35.6 | 73.4 |
| 58.9 | 63.3 |
| 7.9 | 65.6 |
| 2.9 | 68.6 |
| 3.7 | 75.5 |
| 3.5 | 76.3 |
| 3.2 | 71.8 |
| 2.9 | 65.8 |
| 49.4 | 66.4 |
| 18.1 | 72.1 |
| 8.9 | 67.5 |
| 2.9 | 70.7 |
| 3.9 | 72.5 |
| 2.2 | 71.4 |
| 2.1 | 50 |
| 3.1 | 65.9 |
| 2.6 | 68.1 |
| 3.5 | 73 |
| 4.4 | 59.1 |
| 3.0 | 57.2 |
| 2.6 | 72.4 |
| 4.3 | 71.6 |
| 53.9 | 68.5 |
| 7.2 | 65 |
| 3.3 | 66.9 |
| 5.5 | 74.8 |
| 1.4 | 44.7 |
| 72.7 | 66.8 |
| 33.2 | 68.7 |
| 3.3 | 63.5 |
| 11.8 | 62.6 |
| 2.0 | 69.7 |
| 6.1 | 70.2 |
| 3.0 | 64.2 |
| 3.7 | 67.9 |
| 2.9 | 60.4 |
| 5.6 | 75.8 |
| 4.1 | 75.2 |
| 4.0 | 72 |
| 3.1 | 78 |
| 49.1 | 65.9 |
| 14.4 | 68.9 |
| 5.0 | 46.3 |
| 52.0 | 66.9 |
| 3.4 | 68.6 |
| 5.4 | 53.6 |
| 2.7 | 66 |
| 3.7 | 69.2 |
| 7.7 | 73.9 |
| 3.8 | 68.7 |
| 3.9 | 67.5 |
| 3.2 | 73.3 |
| 2.8 | 62.8 |
| 4.8 | 69.2 |
| 2.2 | 69.4 |
| 5.7 | 71.9 |
| 4.1 | 75.4 |
| 3.5 | 65.9 |
| 19.5 | 65.9 |
| 167.4 | 66.4 |
| 1.4 | 61.8 |
| 4.4 | 64.2 |
| 3.8 | 75.6 |
| 3.5 | 70.7 |
| 5.2 | 69.6 |
| 18.6 | 68.4 |
| 5.2 | 65.9 |
| 3.5 | 60.8 |
| 2.0 | 70.3 |
| 3.8 | 58.2 |
| 2.7 | 71.6 |
| 3.1 | 68.7 |
| 3.4 | 72.6 |
| 54.3 | 62.4 |
| 4.1 | 66 |
| 5.0 | 72.7 |
| 5.1 | 73.4 |
| 2.2 | 67.6 |
| 3.8 | 69.7 |
| 2.8 | 70.4 |
| 37.5 | 63.3 |
| 46.9 | 64.3 |
| 3.4 | 68.7 |
| 4.1 | 73.2 |
| 2.3 | 49.9 |
| 4.8 | 72 |
| 4.0 | 67.5 |
| 14.3 | 68.3 |
| 59.4 | 62.5 |
| 17.8 | 60.6 |
| 5.3 | 51 |
| 3.5 | 62.9 |
| 3.3 | 69.8 |
| 2.9 | 56 |
| 7.8 | 68.3 |
| 2.9 | 68.8 |
| 2.9 | 67.6 |
| 67.8 | 67.2 |
| 136.6 | 67.7 |
| 2.7 | 55.1 |
| 2.6 | 59.2 |
| 2.0 | 67.1 |
| 4.9 | 71 |
| 3.5 | 61.3 |
| 3.4 | 69.8 |
| 2.5 | 59.2 |
| 3.8 | 63.9 |
| 33.5 | 68 |
| 3.4 | 68.2 |
| 3.1 | 60.9 |
| 3.9 | 60.2 |
| 3.9 | 63 |
| 7.5 | 70.4 |
| 14.0 | 71.8 |
| 38.3 | 68.9 |
| 3.5 | 51.5 |
| 4.2 | 72.1 |
| 2.7 | 72.3 |
| 43.7 | 64.6 |
| 1.8 | 60.4 |
| 3.3 | 72.6 |
| 2.6 | 55 |
| 4.8 | 34.2 |
| 3.2 | 73.3 |
| 4.6 | 68 |
| 4.1 | 70.7 |
| 3.0 | 64.6 |
| 3.5 | 61.6 |
| 2.3 | 70.2 |
| 2.9 | 61.7 |
| 2.6 | 65 |
| 3.5 | 68.4 |
| 2.8 | 59.5 |
| 1.8 | 63.8 |
| 3.0 | 70.3 |
| 3.0 | 67.5 |
| 2.5 | 71.8 |
| 3.3 | 72.1 |
| 2.5 | 55.3 |
| 3.1 | 70 |
| 1.8 | 70.3 |
| 3.2 | 74.1 |
| 3.1 | 70.6 |
| 47.5 | 67.4 |
| 2.0 | 66.1 |
| 4.3 | 59.7 |
| 2.7 | 54.2 |
| 3.6 | 61 |
| 5.9 | 72.4 |
| 4.0 | 59.4 |
| 181.1 | 63.5 |
| 2.3 | 68.5 |
| 3.0 | 71.5 |
| 7.2 | 67.8 |
| 19.1 | 67 |
| 42.2 | 70 |
| 5.9 | 71.1 |
| 3.7 | 73.4 |
| 2.6 | 63.2 |
| 3.1 | 57 |
| 3.9 | 75.3 |
| 2.5 | 64.1 |
| 3.6 | 75.6 |
| 2.7 | 64.9 |
| 4.0 | 59.4 |
| 3.6 | 72.1 |
| 3.3 | 68.6 |
| 13.6 | 75 |
| 3.5 | 70.1 |
| 3.0 | 70.4 |
| 46.8 | 65.8 |
| 1.9 | 61.3 |
| 2.4 | 66.2 |
| 3.3 | 75.2 |
| 45.6 | 68.1 |
| 2.9 | 65.7 |
| 43.4 | 62.3 |
| 2.8 | 70 |
| 2.4 | 69.1 |
| 3.4 | 71.9 |
| 2.4 | 44.8 |
| 3.9 | 67.3 |
| 10.3 | 67.1 |
| 5.3 | 65.2 |
| 1.6 | 68.3 |
| 2.0 | 72.2 |
| 4.3 | 57.6 |
| 4.4 | 69 |
| 5.2 | 73.3 |
| 3.1 | 75.8 |
| 39.7 | 67.6 |
| 2.6 | 58.9 |
| 2.9 | 62.1 |
| 3.0 | 75.1 |
| 8.8 | 52.1 |
| 3.3 | 48.2 |
| 51.0 | 62.8 |
| 1.8 | 68.4 |
| 2.8 | 58.1 |
| 2.7 | 74.3 |
| 5.2 | 71.6 |
| 4.9 | 71.1 |
| 4.0 | 62.6 |
| 2.4 | 60.3 |
| 2.3 | 62.4 |
| 44.7 | 70.7 |
| 4.1 | 69.9 |
| 58.7 | 67.6 |
| 10.4 | 54.5 |
| 11.3 | 72 |
| 3.3 | 64.1 |
| 2.4 | 67.8 |
| 3.0 | 64.4 |
| 26.4 | 69.6 |
| 4.5 | 71.1 |
| 56.9 | 66.2 |
| 3.0 | 69.3 |
| 3.1 | 61.4 |
| 2.8 | 73.5 |
| 2.7 | 54.6 |
| 2.8 | 61.6 |
| 2.7 | 73 |
| 3.3 | 62.9 |
| 3.5 | 68.6 |
| 3.1 | 74 |
| 6.1 | 74.2 |
| 2.6 | 71.5 |
| 4.4 | 72.7 |
| 3.6 | 49.8 |
| 9.8 | 70.6 |
| 8.3 | 70.8 |
| 3.1 | 71.3 |
| 4.8 | 68 |
| 4.3 | 76.2 |
| 36.0 | 66.5 |
| 15.9 | 72 |
| 3.4 | 64 |
| 3.2 | 73.4 |
| 7.7 | 52 |
| 2.6 | 70 |
| 4.5 | 68.1 |
| 2.7 | 61.4 |
| 2.2 | 61.8 |
| 3.1 | 74.6 |
| 37.2 | 71.4 |
| 4.1 | 74.2 |
| 2.6 | 65.3 |
| 51.9 | 66.2 |
| 2.7 | 65 |
| 2.2 | 62.5 |
| 3.9 | 58.6 |
| 2.7 | 74.5 |
| 3.2 | 66.2 |
| 44.4 | 67.3 |
| 1.8 | 70.5 |
| 2.7 | 62.9 |
| 3.5 | 70.8 |
| 46.6 | 69.8 |
| 53.7 | 70 |
| 42.1 | 64.6 |
| 4.2 | 55.4 |
| 4.0 | 68.6 |
| 2.4 | 62.7 |
| 4.1 | 56.8 |
| 3.4 | 62.5 |
| 3.3 | 72.9 |
| 14.8 | 66.4 |
| 38.1 | 70.2 |
| 30.9 | 68.2 |
| 7.8 | 64.8 |
| 3.9 | 61.9 |
| 2.7 | 69.7 |
| 59.7 | 69.6 |
| 41.4 | 64.7 |
| 4.9 | 69.2 |
| 3.3 | 69.1 |
| 31.6 | 70.2 |
| 12.7 | 66.2 |
| 50.8 | 68.6 |
| 2.6 | 68.6 |
| 3.9 | 68.7 |
| 2.7 | 66.5 |
| 2.7 | 61.9 |
| 19.7 | 73.2 |
| 18.2 | 68.1 |
| 1.4 | 65.5 |
| 4.5 | 68.2 |
| 2.5 | 72.5 |
| 2.9 | 62 |
| 3.6 | 64.3 |
| 67.7 | 63 |
| 4.6 | 59.1 |
| 2.9 | 70.8 |
| 4.1 | 75.5 |
| 3.0 | 73.8 |
| 26.3 | 73 |
| 79.9 | 65.9 |
| 3.1 | 65 |
| 3.5 | 74.2 |
| 2.4 | 70.8 |
| 3.9 | 71.7 |
| 45.7 | 67.2 |
| 3.6 | 69.1 |
| 17.2 | 66.2 |
| 3.2 | 61.8 |
| 2.7 | 60.3 |
| 3.3 | 70.6 |
| 2.8 | 71.2 |
| 4.6 | 68.7 |
| 2.8 | 51.2 |
| 3.8 | 72.5 |
| 3.4 | 65.9 |
| 4.2 | 68.7 |
| 2.4 | 63 |
| 2.4 | 74.1 |
| 4.9 | 75.9 |
| 42.9 | 64.8 |
| 3.0 | 71.4 |
| 2.0 | 73.1 |
| 2.7 | 68.4 |
| 5.0 | 74 |
| 2.6 | 74.3 |
| 3.0 | 69.1 |
| 2.9 | 69.1 |
| 6.8 | 68.5 |
| 3.2 | 62.7 |
| 22.5 | 68.7 |
| 2.6 | 66.6 |
| 4.1 | 67.3 |
| 2.8 | 69.6 |
| 3.1 | 63.5 |
| 4.7 | 71.9 |
| 3.0 | 63.5 |
| 2.0 | 71.6 |
| 16.8 | 68.4 |
| 29.0 | 71.1 |
| 2.6 | 61.4 |
| 11.3 | 71.5 |
| 52.7 | 61.4 |
| 294.6 | 62.5 |
| 1.2 | 68.6 |
| 2.6 | 64.2 |
| 1.8 | 72 |
| 1.4 | 70.9 |
| 3.6 | 62.9 |
| 3.0 | 51.8 |
| 4.2 | 62.2 |
| 45.8 | 66.1 |
| 3.1 | 50 |
| 2.9 | 66.2 |
| 3.1 | 66.2 |
| 25.5 | 69.4 |
| 4.5 | 74.1 |
| 47.0 | 67.6 |
| 3.1 | 66.1 |
| 2.9 | 63.1 |
| 5.1 | 64.4 |
| 3.5 | 74.5 |
| 46.6 | 64 |
| 20.8 | 48.7 |
| 4.1 | 68.4 |
| 3.0 | 66.6 |
| 2.7 | 61.8 |
| 38.7 | 67.9 |
| 52.8 | 61.3 |
| 55.8 | 68.9 |
| 52.8 | 65.4 |
| 19.9 | 68.6 |
| 3.5 | 65.1 |
| 2.6 | 62.7 |
| 2.0 | 67.7 |
| 4.3 | 52.2 |
| 3.7 | 58.9 |
| 34.6 | 68.6 |
| 59.8 | 67 |
| 8.0 | 67.8 |
| 2.5 | 58.6 |
| 72.5 | 65.2 |
| 4.9 | 66.8 |
| 3.1 | 70.5 |
| 2.8 | 71.9 |
| 2.6 | 70.5 |
| 3.2 | 73.3 |
| 3.2 | 72.6 |
| 7.6 | 68.9 |
| 3.2 | 71.4 |
| 3.4 | 70.9 |
| 11.9 | 29.4 |
| 3.2 | 39.9 |
| 42.1 | 67.7 |
| 2.1 | 61 |
| 10.0 | 67.6 |
| 4.1 | 65 |
| 2.6 | 72.8 |
| 4.0 | 55.4 |
| 16.9 | 73.4 |
| 32.2 | 69.4 |
| 3.2 | 70.2 |
| 2.2 | 71.8 |
| 5.2 | 74.8 |
| 6.6 | 74.5 |
| 4.9 | 67.5 |
| 8.2 | 64.1 |
| 64.6 | 68.4 |
| 3.3 | 60.4 |
| 3.3 | 58.3 |
| 2.4 | 69.8 |
| 3.6 | 74 |
| 2.9 | 55.9 |
| 3.8 | 73.2 |
| 2.1 | 47.3 |
| 15.7 | 58.2 |
| 38.1 | 66 |
| 1.7 | 71.7 |
| 3.1 | 71 |
| 3.3 | 66.8 |
| 4.3 | 65.4 |
| 4.0 | 71.1 |
| 3.2 | 62.1 |
| 55.7 | 67.3 |
| 4.4 | 64.2 |
| 2.8 | 73.1 |
| 3.7 | 67.4 |
| 1.0 | 45.7 |
| 7.0 | 70.4 |
| 3.1 | 73.2 |
| 2.1 | 62.5 |
| 3.8 | 65.9 |
| 52.3 | 70.2 |
| 2.2 | 60.1 |
| 2.9 | 72.1 |
| 3.6 | 70.4 |
| 2.6 | 64.7 |
| 4.1 | 65.9 |
| 6.9 | 50 |
| 10.8 | 68.9 |
| 3.7 | 66.5 |
| 2.3 | 64.9 |
| 2.7 | 65.9 |
| 3.7 | 69.8 |
| 2.6 | 66.5 |
| 43.0 | 63.8 |
| 3.6 | 75.2 |
| 3.8 | 75.7 |
| 3.6 | 59.9 |
| 2.9 | 63.1 |
| 2.2 | 72.8 |
| 27.9 | 72.5 |
| 11.3 | 70.2 |
| 3.4 | 61 |
| 25.8 | 65 |
| 27.3 | 63.1 |
| 26.8 | 63.4 |
| 25.8 | 65.4 |
| 26.9 | 63.1 |
| 26.9 | 61.8 |
| 25.4 | 64.7 |
| 25.6 | 62.8 |
| 25.8 | 63.2 |
| 25.9 | 63.5 |
| 25.7 | 65 |
| 26.1 | 62.5 |
| 25.6 | 63 |
| 27.6 | 60.3 |
| 26.3 | 63.4 |
| 25.5 | 62.3 |
| 25.5 | 64.4 |
| 26.9 | 60.9 |
| 25.8 | 63.1 |
| 27.6 | 62.6 |
| 25.6 | 62.7 |
| 24.9 | 63.9 |
| 26.8 | 62 |
| 25.6 | 61.8 |
| 26.0 | 59.9 |
| 26.0 | 64.1 |
| 26.6 | 60.8 |
| 26.4 | 61.5 |
| 25.6 | 63.2 |
| 25.3 | 64.3 |
| 24.6 | 65.6 |
| 26.3 | 61.5 |
| 26.2 | 64.5 |
| 25.6 | 65.6 |
| 23.4 | 64.2 |
| 25.3 | 63.1 |
| 27.6 | 59 |
| 23.5 | 58.3 |
| 24.0 | 64.4 |
| 24.3 | 59.4 |
| 24.7 | 63.8 |
| 26.0 | 58 |
| 25.0 | 60.5 |
| 23.5 | 58.5 |
| 20.8 | 54.6 |
| 27.2 | 53.8 |
| 21.3 | 54.4 |
| 20.2 | 61.6 |
| 68.4 | 60.7 |
| 73.4 | 63.4 |
| 84.6 | 63.7 |
| 79.6 | 66.7 |
| 70.0 | 63.3 |
| 81.2 | 65.1 |
| 77.7 | 62.9 |
| 76.7 | 64.2 |
| 76.2 | 65.7 |
| 82.7 | 66.1 |
| 101.6 | 65.5 |
| 79.0 | 64.8 |
| 71.1 | 63.6 |
| 71.8 | 65.6 |
| 87.4 | 64.3 |
| 69.7 | 64.9 |
| 90.4 | 60.2 |
| 91.3 | 65.1 |
| 77.5 | 67.7 |
| 70.4 | 63.1 |
| 71.2 | 65.8 |
| 91.9 | 63.5 |
| 82.8 | 63.4 |
| 81.6 | 64.7 |
| 73.9 | 62 |
| 74.1 | 63 |
| 93.9 | 63.1 |
| 66.0 | 64.6 |
| 71.8 | 61.5 |
| 75.7 | 65.5 |
| 90.2 | 66.9 |
| 73.8 | 63.2 |
| 79.7 | 64.6 |
| 79.0 | 64.2 |
| 69.0 | 63 |
| 80.0 | 66.1 |
| 70.4 | 65.2 |
| 82.0 | 66.4 |
| 79.8 | 67.3 |
| 71.5 | 61.6 |
| 78.0 | 65.9 |
| 78.3 | 64.1 |
| 73.4 | 64.7 |
| 72.5 | 61.7 |
| 81.5 | 64.7 |
| 75.4 | 66.8 |
| 67.3 | 65.2 |
| 76.2 | 66 |
| 65.1 | 66 |
| 87.7 | 62.6 |
| 72.5 | 66.8 |
| 76.7 | 64.7 |
| 88.8 | 66.5 |
| 84.6 | 62.7 |
| 76.9 | 66.1 |
| 76.2 | 65.7 |
| 72.3 | 64 |
| 72.0 | 66.4 |
| 70.0 | 63.4 |
| 74.7 | 66.2 |
| 78.5 | 66.1 |
| 64.3 | 64.4 |
| 82.6 | 65.8 |
| 89.0 | 65.6 |
| 67.7 | 64.4 |
| 73.2 | 66.6 |
| 76.9 | 66.1 |
| 75.4 | 65.8 |
| 74.2 | 63.2 |
| 73.8 | 65 |
| 75.0 | 64 |
| 85.0 | 67.3 |
| 75.4 | 63.7 |
| 65.7 | 63.5 |
| 74.9 | 66.4 |
| 87.6 | 63.8 |
| 68.0 | 64.7 |
| 75.8 | 62.3 |
| 62.9 | 66.6 |
| 68.3 | 65.8 |
| 79.4 | 68 |
| 79.6 | 65.1 |
| 75.7 | 65 |
| 66.7 | 64.7 |
| 79.8 | 64.8 |
| 75.8 | 65.1 |
| 64.2 | 64.4 |
| 63.5 | 63.6 |
| 66.6 | 64.9 |
| 74.6 | 66.6 |
| 71.5 | 64.4 |
| 78.9 | 69.1 |
| 76.5 | 64.4 |
| 82.1 | 65.1 |
| 75.5 | 66 |
| 74.5 | 62.8 |
| 70.6 | 65.8 |
| 79.4 | 65.8 |
| 82.9 | 64.3 |
| 61.5 | 65.7 |
| 65.0 | 64.7 |
| 69.7 | 64.1 |
| 69.0 | 64.6 |
| 58.5 | 65.9 |
| 67.1 | 64.9 |
| 62.0 | 63.7 |
| 60.1 | 64.3 |
| 74.6 | 66.1 |
| 71.9 | 63.1 |
| 77.6 | 67.3 |
| 90.3 | 67.6 |
| 53.2 | 63 |
| 69.3 | 65.7 |
| 73.5 | 65.6 |
| 84.9 | 67 |
| 70.4 | 65.9 |
| 69.8 | 65.1 |
| 73.2 | 65.6 |
| 81.8 | 67 |
| 78.9 | 67.6 |
| 68.9 | 67.2 |
| 74.0 | 65.4 |
| 60.5 | 62.3 |
| 70.3 | 66.3 |
| 77.3 | 66.2 |
| 86.6 | 63.1 |
| 66.6 | 63.3 |
| 76.9 | 63.9 |
| 77.0 | 65.5 |
| 64.6 | 66.2 |
| 66.0 | 67.4 |
| 69.0 | 66.3 |
| 83.6 | 64.5 |
| 78.7 | 66.2 |
| 83.9 | 66.2 |
| 68.8 | 65.1 |
| 80.9 | 64.7 |
| 73.9 | 63.4 |
| 80.3 | 67.7 |
| 66.5 | 65.7 |
| 81.4 | 67.1 |
| 71.8 | 64.1 |
| 80.0 | 63 |
| 64.2 | 67 |
| 79.6 | 64.5 |
| 81.1 | 64.9 |
| 72.2 | 66.7 |
| 69.4 | 67.2 |
| 76.2 | 66.2 |
| 81.9 | 64.3 |
| 57.1 | 64.8 |
| 73.4 | 65.6 |
| 70.0 | 65.9 |
| 55.2 | 62.1 |
| 73.7 | 64.9 |
| 65.9 | 66.2 |
| 59.9 | 65.4 |
| 68.9 | 64.1 |
| 68.2 | 65.4 |
| 76.5 | 64.9 |
| 70.8 | 66.5 |
| 84.6 | 63 |
| 78.2 | 65.5 |
| 69.0 | 65.8 |
| 70.2 | 62.8 |
| 88.5 | 65.7 |
| 74.2 | 63.2 |
| 68.5 | 66.7 |
| 71.7 | 66.2 |
| 85.4 | 66.1 |
| 75.1 | 63.7 |
| 75.1 | 62.3 |
| 82.4 | 66.7 |
| 65.4 | 66.9 |
| 82.6 | 66.8 |
| 61.7 | 62.5 |
| 70.8 | 64.5 |
| 75.3 | 64.8 |
| 74.9 | 62.9 |
| 68.5 | 69.3 |
| 74.2 | 61.9 |
| 66.7 | 64 |
| 63.7 | 64.3 |
| 78.9 | 60.5 |
| 77.9 | 64.5 |
| 79.9 | 64.9 |
| 60.7 | 65.3 |
| 76.5 | 63.4 |
| 86.2 | 65 |
| 83.1 | 65.5 |
| 61.5 | 64.6 |
| 53.9 | 63 |
| 89.0 | 65.6 |
| 59.0 | 66 |
| 82.8 | 66 |
| 63.4 | 64.9 |
| 65.0 | 63.2 |
| 74.0 | 66.6 |
| 60.4 | 64.1 |
| 72.9 | 65.7 |
| 78.3 | 65.3 |
| 89.4 | 63.3 |
| 68.2 | 64.8 |
| 90.7 | 64.2 |
| 68.1 | 65.6 |
| 65.9 | 63.9 |
| 84.6 | 61.6 |
| 69.5 | 65.9 |
| 69.5 | 64.7 |
| 74.6 | 65.6 |
| 89.9 | 67.1 |
| 72.6 | 66.5 |
| 74.1 | 66.7 |
| 81.4 | 65.3 |
| 69.6 | 64.2 |
| 79.2 | 62.1 |
| 60.4 | 62.3 |
| 72.8 | 63.9 |
| 70.7 | 64.8 |
| 82.2 | 63.9 |
| 68.0 | 66.8 |
| 74.5 | 64.4 |
| 69.8 | 65.8 |
| 66.4 | 65.5 |
| 55.0 | 65.4 |
| 69.2 | 63.9 |
| 75.7 | 65.2 |
| 74.6 | 67.1 |
| 77.8 | 65.5 |
| 67.0 | 65.7 |
| 71.1 | 66.1 |
| 80.1 | 59.8 |
| 68.8 | 67.3 |
| 79.6 | 66.4 |
| 75.3 | 66.4 |
| 72.3 | 64.6 |
| 65.6 | 62.9 |
| 80.9 | 66.4 |
| 72.3 | 66.3 |
| 28.0 | 64.6 |
| 60.7 | 64.2 |
| 70.6 | 62.5 |
| 71.6 | 66.2 |
| 79.9 | 63.8 |
| 77.3 | 67.1 |
| 73.1 | 66.6 |
| 83.3 | 67.3 |
| 68.9 | 64.3 |
| 79.2 | 65.3 |
| 75.9 | 62.2 |
| 81.9 | 64.5 |
| 71.2 | 60.7 |
| 53.0 | 63.4 |
| 71.5 | 64.7 |
| 56.6 | 65.3 |
| 75.9 | 67.2 |
| 69.3 | 64.4 |
| 66.2 | 61.5 |
| 71.6 | 62.8 |
| 75.1 | 65.8 |
| 82.7 | 64.9 |
| 73.4 | 64 |
| 70.2 | 64.2 |
| 67.3 | 65.2 |
| 72.2 | 65.5 |
| 69.9 | 64.5 |
| 66.4 | 66.9 |
| 78.6 | 62.7 |
| 74.1 | 66.7 |
| 80.0 | 66.8 |
| 86.2 | 64.5 |
| 69.9 | 63.6 |
| 76.5 | 64.8 |
| 69.3 | 64.2 |
| 88.0 | 67.5 |
| 67.2 | 66.1 |
| 62.1 | 63.4 |
| 57.8 | 62.9 |
| 88.0 | 66.7 |
| 68.3 | 65.3 |
| 62.1 | 65 |
| 83.5 | 67.6 |
| 82.0 | 66.2 |
| 73.5 | 65.8 |
| 71.1 | 65 |
| 88.7 | 66.5 |
| 73.3 | 64.3 |
| 77.6 | 65 |
| 72.7 | 65.3 |
| 63.3 | 64.4 |
| 76.5 | 64.2 |
| 87.9 | 64.6 |
| 84.8 | 62.8 |
| 70.7 | 63.3 |
| 74.9 | 65.2 |
| 71.1 | 66.2 |
| 79.6 | 64.6 |
| 90.9 | 63.5 |
| 70.6 | 62.3 |
| 72.4 | 59.5 |
| 79.3 | 66.5 |
| 77.1 | 64.8 |
| 64.4 | 64 |
| 86.0 | 65.3 |
| 73.7 | 65.5 |
| 62.4 | 63.6 |
| 68.6 | 61.9 |
| 60.4 | 65.7 |
| 80.7 | 61.8 |
| 70.0 | 64.4 |
| 86.1 | 64.4 |
| 86.4 | 64.4 |
| 58.6 | 64.3 |
| 62.6 | 65.2 |
| 64.0 | 61.8 |
| 66.9 | 62.3 |
| 57.6 | 63.3 |
| 59.6 | 66.4 |
| 64.3 | 64.5 |
| 48.2 | 62.8 |
| 70.0 | 64.2 |
| 66.3 | 65.1 |
| 55.0 | 64.8 |
| 68.5 | 64.3 |
| 71.4 | 67.3 |
| 75.6 | 65.7 |
| 67.2 | 64.6 |
| 76.2 | 65.7 |
| 66.3 | 65.6 |
| 79.7 | 64.7 |
| 84.1 | 64.1 |
| 80.2 | 65 |
| 59.4 | 66.2 |
| 71.7 | 66.7 |
| 81.9 | 62.1 |
| 65.7 | 64.8 |
| 70.8 | 66.5 |
| 56.1 | 63.6 |
| 71.5 | 65 |
| 73.1 | 66.5 |
| 72.6 | 63.9 |
| 53.1 | 60.1 |
| 57.5 | 66.6 |
| 63.3 | 62.5 |
| 86.9 | 66.2 |
| 64.2 | 63.9 |
| 70.4 | 63.5 |
| 83.0 | 63.9 |
| 65.1 | 64.9 |
| 81.7 | 66.1 |
| 61.1 | 64.9 |
| 69.8 | 58.7 |
| 62.8 | 63.7 |
| 72.0 | 67.7 |
| 73.4 | 66 |
| 66.6 | 66.9 |
| 71.4 | 66.4 |
| 50.6 | 66 |
| 74.1 | 62 |
| 69.0 | 62.7 |
| 67.3 | 65.3 |
| 77.8 | 62.5 |
| 79.2 | 64.1 |
| 58.8 | 64.4 |
| 79.9 | 64.7 |
| 64.9 | 65.1 |
| 55.7 | 67.5 |
| 136.6 | 62.9 |
| 57.3 | 64.6 |
| 69.5 | 61.6 |
| 80.8 | 64.8 |
| 71.9 | 64.8 |
| 69.1 | 61 |
| 61.3 | 63.6 |
| 63.6 | 63.8 |
| 69.0 | 61.1 |
| 72.6 | 64.1 |
| 67.3 | 66.8 |
| 72.3 | 65.6 |
| 69.9 | 62.8 |
| 60.0 | 63.6 |
| 76.0 | 64.3 |
| 72.6 | 65.3 |
| 69.0 | 65.2 |
| 85.0 | 65.7 |
| 67.2 | 66.5 |
| 62.6 | 62.5 |
| 64.6 | 60.4 |
| 64.9 | 65.9 |
| 74.8 | 65 |
| 58.8 | 68.2 |
| 73.8 | 68.5 |
| 67.6 | 65.4 |
| 59.1 | 64.2 |
| 60.7 | 63.1 |
| 70.1 | 65.7 |
| 72.2 | 62.4 |
| 70.2 | 66.1 |
| 64.5 | 69.4 |
| 56.5 | 65.2 |
| 56.2 | 65.4 |
| 55.4 | 65.8 |
| 72.4 | 67.8 |
| 70.6 | 61.4 |
| 65.1 | 61.9 |
| 69.9 | 61.9 |
| 61.3 | 63.6 |
| 60.7 | 66.8 |
| 50.4 | 65.5 |
| 68.8 | 59.8 |
| 70.0 | 64.1 |
| 60.0 | 65.3 |
| 69.6 | 63.2 |
| 62.6 | 67 |
| 70.5 | 66.3 |
| 65.7 | 65 |
| 80.6 | 61.2 |
| 65.1 | 65.8 |
| 72.9 | 65.7 |
| 61.1 | 65.2 |
| 61.3 | 63.7 |
| 64.9 | 67.8 |
| 72.5 | 66.8 |
| 75.9 | 61 |
| 62.1 | 67.3 |
| 65.7 | 61.9 |
| 61.5 | 66.9 |
| 64.2 | 65.6 |
| 73.4 | 65.2 |
| 73.7 | 63.8 |
| 70.4 | 64.1 |
| 76.9 | 60.5 |
| 68.1 | 66.7 |
| 59.1 | 66.9 |
| 70.8 | 60.5 |
| 60.7 | 66 |
| 77.6 | 62.3 |
| 60.6 | 65.7 |
| 67.8 | 58.5 |
| 71.2 | 64.5 |
| 72.8 | 65 |
| 68.5 | 65.8 |
| 58.9 | 64.3 |
| 52.2 | 65.4 |
| 59.1 | 64.5 |
| 66.7 | 62.8 |
| 66.3 | 62.3 |
| 61.1 | 63.7 |
| 73.5 | 61.9 |
| 52.8 | 65 |
| 57.3 | 64.8 |
| 72.6 | 65 |
| 77.3 | 59.8 |
| 80.1 | 66.6 |
| 63.7 | 61.9 |
| 55.7 | 64 |
| 66.8 | 65.2 |
| 59.3 | 65.9 |
| 62.7 | 64.1 |
| 64.2 | 67.5 |
| 72.1 | 66.7 |
| 56.5 | 64.6 |
| 72.8 | 68.5 |
| 52.0 | 58.4 |
| 59.3 | 64.9 |
| 73.0 | 61.9 |
| 66.6 | 63.9 |
| 79.1 | 64.5 |
| 59.2 | 65.9 |
| 66.0 | 64.2 |
| 69.2 | 65.8 |
| 64.9 | 64.2 |
| 57.5 | 65.9 |
| 70.5 | 64.5 |
| 58.6 | 63.1 |
| 67.3 | 66.4 |
| 57.0 | 64 |
| 57.4 | 65 |
| 63.8 | 61.9 |
| 60.0 | 62.9 |
| 63.8 | 64.6 |
| 64.6 | 65.8 |
| 70.2 | 64.3 |
| 74.0 | 65.7 |
| 70.8 | 67.2 |
| 74.9 | 60 |
| 62.7 | 64.8 |
| 66.5 | 63.4 |
| 72.2 | 62.9 |
| 55.6 | 64.5 |
| 73.3 | 63 |
| 38.3 | 63.4 |
| 56.7 | 65 |
| 63.2 | 66.9 |
| 60.9 | 65.2 |
| 71.6 | 66.4 |
| 56.5 | 64.2 |
| 69.4 | 62.7 |
| 49.4 | 65.7 |
| 76.7 | 62.3 |
| 75.9 | 65.4 |
| 58.3 | 67.6 |
| 82.3 | 66.7 |
| 58.7 | 66.3 |
| 66.5 | 61.7 |
| 67.3 | 69.6 |
| 65.5 | 67.1 |
| 59.2 | 63.2 |
| 73.9 | 63.3 |
| 72.2 | 61.7 |
| 56.9 | 64.6 |
| 78.4 | 62.4 |
| 62.4 | 63.4 |
| 68.6 | 64.5 |
| 63.3 | 66 |
| 58.7 | 64.4 |
| 72.9 | 65.7 |
| 63.9 | 65.4 |
| 63.4 | 64.6 |
| 70.9 | 65.9 |
| 70.2 | 62.5 |
| 57.3 | 63 |
| 63.5 | 61.9 |
| 72.8 | 61 |
| 57.8 | 63 |
| 28.4 | 59.8 |
| 59.6 | 63.3 |
| 56.3 | 61.5 |
| 52.0 | 63.2 |
| 55.8 | 60.2 |
| 115.6 | 63.1 |
| 65.2 | 65.9 |
| 59.9 | 64.8 |
| 67.4 | 67.3 |
| 66.6 | 62.2 |
| 71.0 | 65.5 |
| 80.9 | 62.2 |
| 51.8 | 67.9 |
| 68.3 | 65.5 |
| 68.8 | 64.6 |
| 42.4 | 66.8 |
| 56.7 | 63 |
| 65.5 | 65.6 |
| 69.3 | 65.7 |
| 79.3 | 65.1 |
| 92.0 | 59.4 |
| 62.9 | 66.6 |
| 60.9 | 68.4 |
| 67.8 | 64.9 |
| 64.5 | 64.3 |
| 58.4 | 63.4 |
| 59.7 | 64.1 |
| 90.4 | 60.8 |
| 60.5 | 66.2 |
| 48.9 | 66.9 |
| 69.4 | 68 |
| 65.8 | 62.4 |
| 66.1 | 66.2 |
| 53.9 | 66.6 |
| 59.0 | 65.9 |
| 39.6 | 63.4 |
| 55.6 | 60.5 |
| 53.3 | 63.6 |
| 72.6 | 65.6 |
| 83.8 | 63.3 |
| 82.0 | 65.4 |
| 54.5 | 65.6 |
| 66.5 | 61.3 |
| 67.6 | 65 |
| 60.4 | 65.1 |
| 52.2 | 65.4 |
| 150.9 | 62.2 |
| 58.1 | 65.3 |
| 59.3 | 65.9 |
| 52.7 | 61.9 |
| 45.7 | 63.1 |
| 57.4 | 65.3 |
| 70.9 | 63.4 |
| 59.7 | 64.5 |
| 76.2 | 63.9 |
| 75.4 | 63.9 |
| 56.2 | 67.5 |
| 48.7 | 65.1 |
| 67.0 | 59.8 |
| 24.3 | 63.1 |
| 56.8 | 62.3 |
| 58.9 | 63.6 |
| 58.2 | 63.9 |
| 73.0 | 60.4 |
| 51.2 | 64.2 |
| 53.6 | 63.1 |
| 51.7 | 65.3 |
| 64.9 | 62.2 |
| 66.8 | 61.6 |
| 61.8 | 60.5 |
| 48.4 | 63 |
| 76.8 | 68.3 |
| 62.6 | 64.3 |
| 58.5 | 63.6 |
| 47.7 | 64.8 |
| 59.9 | 61.4 |
| 59.7 | 63 |
| 71.6 | 65.1 |
| 73.5 | 61.8 |
| 51.0 | 66.7 |
| 62.9 | 57.2 |
| 52.8 | 61.1 |
| 74.9 | 63.8 |
| 62.6 | 62.9 |
| 58.7 | 60.8 |
| 58.8 | 64.5 |
| 52.2 | 65.1 |
| 44.1 | 65.2 |
| 27.9 | 65.3 |
| 65.3 | 65.3 |
| 66.2 | 67.9 |
| 59.8 | 58 |
| 63.8 | 62.6 |
| 41.0 | 66.2 |
| 64.0 | 65.1 |
| 62.3 | 62.1 |
| 74.4 | 64.1 |
| 53.5 | 61.4 |
| 70.8 | 66.3 |
| 38.0 | 65.1 |
| 61.0 | 58.5 |
| 68.9 | 61.3 |
| 52.6 | 59.2 |
| 58.6 | 62 |
| 43.1 | 64.1 |
| 73.9 | 61.9 |
| 66.9 | 63.9 |
| 40.8 | 65.1 |
| 54.2 | 65.8 |
| 66.5 | 63.3 |
| 40.3 | 64.2 |
| 58.6 | 61.4 |
| 55.4 | 64.5 |
| 34.4 | 61.8 |
| 52.1 | 63.2 |
| 142.3 | 61.8 |
| 42.5 | 64.9 |
| 60.9 | 66.3 |
| 56.3 | 62.9 |
| 63.7 | 60.9 |
| 56.8 | 64.8 |
| 65.6 | 62.9 |
| 53.1 | 65.2 |
| 44.1 | 66.2 |
| 40.2 | 57.3 |
| 57.9 | 64.9 |
| 71.7 | 67.7 |
| 44.3 | 58.9 |
| 70.1 | 62.9 |
| 72.2 | 64.7 |
| 58.3 | 64.1 |
| 66.3 | 64.9 |
| 55.4 | 64.4 |
| 52.2 | 63.6 |
| 84.8 | 64 |
| 51.3 | 62.4 |
| 49.2 | 63.9 |
| 53.9 | 62 |
| 71.4 | 62.9 |
| 57.6 | 63.9 |
| 53.7 | 62.6 |
| 52.7 | 60.8 |
| 64.3 | 60.1 |
| 56.5 | 65 |
| 59.4 | 60.6 |
| 39.6 | 65 |
| 64.9 | 61.9 |
| 53.4 | 63.6 |
| 36.9 | 63.3 |
| 55.6 | 67.5 |
| 50.9 | 63.3 |
| 42.9 | 60 |
| 39.9 | 57.2 |
| 48.5 | 59.1 |
| 63.5 | 63.1 |
| 55.7 | 60.6 |
| 54.7 | 65.5 |
| 51.8 | 61.3 |
| 50.7 | 64.5 |
| 50.8 | 63.1 |
| 65.2 | 65.2 |
| 61.4 | 60.6 |
| 63.4 | 61.6 |
| 56.4 | 61.5 |
| 52.7 | 62 |
| 56.6 | 64.8 |
| 49.9 | 59.4 |
| 61.5 | 65.9 |
| 79.9 | 62 |
| 46.2 | 64.1 |
| 43.7 | 64 |
| 54.9 | 67.2 |
| 59.8 | 61.7 |
| 25.7 | 59.3 |
| 55.9 | 61.7 |
| 34.0 | 59.8 |
| 62.9 | 63.6 |
| 26.1 | 63.9 |
| 25.0 | 64.8 |
| 53.9 | 60.7 |
| 55.2 | 64.9 |
| 49.6 | 65.5 |
| 49.5 | 63.3 |
| 71.6 | 60.5 |
| 48.6 | 61.4 |
| 122.3 | 58.2 |
| 32.5 | 53.9 |
| 54.2 | 63 |
| 54.4 | 61.8 |
| 40.2 | 62.6 |
| 51.3 | 61.4 |
| 22.0 | 64.4 |
| 54.4 | 59.8 |
| 51.6 | 64.1 |
| 66.7 | 59.8 |
| 39.5 | 61.3 |
| 31.7 | 59.6 |
| 45.1 | 61 |
| 61.5 | 61.3 |
| 48.7 | 66.1 |
| 47.7 | 65.9 |
| 46.9 | 63.5 |
| 39.0 | 60.9 |
| 42.0 | 57.8 |
| 36.3 | 65.2 |
| 31.3 | 63.5 |
| 43.1 | 60 |
| 10.4 | 63.2 |
| 11.9 | 63.6 |
| 11.1 | 66 |
| 10.0 | 65.1 |
| 11.9 | 64.5 |
| 10.8 | 66 |
| 11.1 | 65.2 |
| 11.7 | 66.7 |
| 11.2 | 65.4 |
| 10.8 | 65 |
| 11.5 | 63.5 |
| 11.3 | 65.3 |
| 12.1 | 63.7 |
| 9.7 | 64.1 |
| 11.6 | 64.2 |
| 10.0 | 62.5 |
| 12.6 | 61.5 |
| 11.5 | 63.5 |
| 11.5 | 66.7 |
| 8.6 | 64.6 |
| 10.3 | 63.9 |
| 10.8 | 64.4 |
| 11.3 | 63.1 |
| 8.8 | 63.2 |
| 10.8 | 63.8 |
| 12.2 | 66 |
| 10.9 | 63.6 |
| 11.3 | 64.3 |
| 11.1 | 64.3 |
| 12.4 | 66.6 |
| 12.2 | 65.4 |
| 11.4 | 66 |
| 9.9 | 65 |
| 9.0 | 65 |
| 13.4 | 62.5 |
| 9.1 | 66.1 |
| 10.1 | 65.4 |
| 10.9 | 64.7 |
| 10.4 | 63 |
| 10.6 | 61.9 |
| 10.5 | 65.7 |
| 8.8 | 63.3 |
| 10.2 | 65.7 |
| 9.7 | 64.8 |
| 10.1 | 64.8 |
| 10.8 | 64.6 |
| 9.8 | 66 |
| 11.3 | 65.8 |
| 10.9 | 64.4 |
| 9.5 | 65.6 |
| 8.8 | 65.9 |
| 9.6 | 63.9 |
| 9.7 | 65.8 |
| 9.6 | 65.8 |
| 9.4 | 60.3 |
| 10.1 | 65.3 |
| 8.8 | 65 |
| 11.4 | 66.3 |
| 9.9 | 63.5 |
| 10.5 | 65 |
| 8.5 | 67.4 |
| 11.1 | 65.9 |
| 9.9 | 68.5 |
| 10.4 | 64.5 |
| 10.2 | 66.8 |
| 11.9 | 63.4 |
| 10.3 | 66 |
| 8.7 | 65 |
| 12.6 | 64 |
| 9.0 | 64.2 |
| 10.5 | 64.9 |
| 8.8 | 64.9 |
| 10.4 | 66.2 |
| 11.0 | 65 |
| 11.5 | 63.6 |
| 11.7 | 65.4 |
| 10.9 | 62.6 |
| 10.1 | 64.3 |
| 9.6 | 67.2 |
| 10.7 | 66.5 |
| 8.1 | 64.8 |
| 9.5 | 65.4 |
| 9.0 | 65.2 |
| 10.2 | 65.8 |
| 10.2 | 64.2 |
| 9.9 | 65.5 |
| 11.5 | 61.7 |
| 9.0 | 65 |
| 10.2 | 64.1 |
| 9.6 | 65 |
| 12.3 | 66.4 |
| 10.4 | 62.2 |
| 9.5 | 67.8 |
| 10.8 | 64.3 |
| 12.7 | 63.5 |
| 10.2 | 62.7 |
| 13.2 | 67 |
| 10.4 | 66 |
| 10.5 | 63.6 |
| 10.7 | 66.7 |
| 12.1 | 65.6 |
| 8.6 | 65.4 |
| 7.9 | 65.3 |
| 8.8 | 65.7 |
| 9.0 | 65 |
| 9.5 | 65.9 |
| 10.6 | 65.5 |
| 8.8 | 65.5 |
| 9.1 | 64.4 |
| 10.4 | 66.7 |
| 9.9 | 65.9 |
| 11.3 | 64.7 |
| 8.8 | 63.7 |
| 9.5 | 66.7 |
| 10.2 | 62.8 |
| 9.0 | 64.4 |
| 10.4 | 66.6 |
| 9.1 | 66.5 |
| 11.0 | 64.2 |
| 9.1 | 65.2 |
| 9.2 | 64.6 |
| 9.1 | 64.9 |
| 8.8 | 62.2 |
| 9.9 | 63.6 |
| 10.4 | 67.6 |
| 8.7 | 64.3 |
| 9.9 | 62.8 |
| 9.4 | 65.4 |
| 9.7 | 64.8 |
| 12.0 | 59.8 |
| 6.3 | 62.1 |
| 8.3 | 65.9 |
| 9.3 | 65.6 |
| 8.5 | 64.5 |
| 10.9 | 65.3 |
| 11.1 | 66.4 |
| 10.3 | 63.5 |
| 13.0 | 64.2 |
| 11.7 | 65.3 |
| 11.1 | 62.4 |
| 10.6 | 65.9 |
| 10.9 | 64.4 |
| 10.2 | 61.9 |
| 10.3 | 63.8 |
| 11.1 | 62.8 |
| 7.8 | 64.7 |
| 10.2 | 66.1 |
| 11.2 | 64.4 |
| 7.5 | 64.9 |
| 9.5 | 66.7 |
| 10.9 | 64.8 |
| 9.7 | 65.2 |
| 12.8 | 63.3 |
| 9.5 | 67.3 |
| 9.8 | 65.7 |
| 9.2 | 62.2 |
| 7.1 | 65.5 |
| 9.4 | 65.7 |
| 10.3 | 63.6 |
| 11.7 | 66.3 |
| 11.0 | 67.2 |
| 11.3 | 64.5 |
| 10.2 | 59.1 |
| 8.4 | 64.4 |
| 7.8 | 65.6 |
| 9.7 | 64.9 |
| 9.9 | 66 |
| 9.7 | 66.6 |
| 8.8 | 62.4 |
| 9.1 | 65.3 |
| 8.2 | 66.5 |
| 8.6 | 64.8 |
| 8.9 | 65.1 |
| 7.1 | 63.5 |
| 10.3 | 64.7 |
| 13.6 | 64.8 |
| 9.2 | 67.8 |
| 10.5 | 64 |
| 10.1 | 64.9 |
| 8.8 | 64.5 |
| 8.3 | 66.5 |
| 10.6 | 63.3 |
| 9.5 | 66.1 |
| 8.7 | 66 |
| 9.9 | 64.4 |
| 10.4 | 64.4 |
| 9.4 | 65.1 |
| 9.0 | 63.5 |
| 13.0 | 62 |
| 8.9 | 63.3 |
| 9.2 | 63.4 |
| 9.0 | 66.3 |
| 12.4 | 59.5 |
| 11.4 | 64.5 |
| 8.3 | 65.8 |
| 9.6 | 66.7 |
| 9.4 | 67 |
| 9.3 | 65.2 |
| 10.5 | 62.9 |
| 11.3 | 65.3 |
| 7.3 | 61.9 |
| 8.0 | 63 |
| 7.9 | 64.4 |
| 11.3 | 66.1 |
| 8.7 | 63.5 |
| 10.9 | 62.8 |
| 7.8 | 64.3 |
| 10.0 | 67.5 |
| 8.1 | 67.1 |
| 11.5 | 66.2 |
| 10.8 | 64.7 |
| 9.9 | 64.2 |
| 11.5 | 65.9 |
| 10.2 | 65.9 |
| 9.9 | 63.9 |
| 8.9 | 63.9 |
| 8.1 | 66.5 |
| 10.0 | 65.4 |
| 7.1 | 66.9 |
| 10.6 | 64.6 |
| 9.0 | 64.9 |
| 8.8 | 62.1 |
| 10.7 | 60.7 |
| 10.1 | 63.8 |
| 9.3 | 66.2 |
| 9.2 | 65.1 |
| 11.1 | 63.4 |
| 9.7 | 68.3 |
| 10.0 | 66.6 |
| 10.2 | 61.1 |
| 12.4 | 66 |
| 9.7 | 67.3 |
| 9.1 | 69.8 |
| 8.9 | 61.4 |
| 11.1 | 61.2 |
| 7.6 | 63 |
| 7.9 | 64.4 |
| 8.7 | 62.8 |
| 9.2 | 65.7 |
| 11.0 | 60.6 |
| 10.6 | 67.7 |
| 8.5 | 63.3 |
| 8.5 | 61.2 |
| 8.7 | 62.8 |
| 8.0 | 65.1 |
| 8.6 | 65.3 |
| 10.2 | 64.3 |
| 14.5 | 63.3 |
| 8.1 | 61 |
| 7.4 | 65.3 |
| 10.0 | 68.1 |
| 9.6 | 61.6 |
| 9.3 | 65.5 |
| 9.5 | 65.1 |
| 12.1 | 63.4 |
| 10.4 | 66.4 |
| 9.0 | 62.4 |
| 12.6 | 65.5 |
| 8.8 | 65.1 |
| 11.6 | 63.9 |
| 9.2 | 65.4 |
| 11.9 | 65.6 |
| 6.4 | 60.1 |
| 10.5 | 65.9 |
| 6.4 | 65.3 |
| 9.4 | 60.4 |
| 8.6 | 62.8 |
| 8.8 | 63.3 |
| 8.4 | 62.9 |
| 8.7 | 65.2 |
| 7.8 | 62.4 |
| 9.3 | 66.8 |
| 8.5 | 65.5 |
| 8.7 | 61.5 |
| 7.1 | 68 |
| 7.7 | 64.6 |
| 9.8 | 65.2 |
| 10.3 | 65.5 |
| 11.0 | 65.8 |
| 11.1 | 65.9 |
| 8.1 | 62.8 |
| 7.3 | 63.5 |
| 11.3 | 64.1 |
| 9.6 | 65.5 |
| 13.6 | 61.7 |
| 11.2 | 63.4 |
| 9.0 | 65.7 |
| 8.4 | 66.5 |
| 12.2 | 63 |
| 8.6 | 67 |
| 8.2 | 66.4 |
| 11.0 | 64.9 |
| 7.0 | 64.8 |
| 10.5 | 64.9 |
| 9.7 | 63 |
| 8.4 | 65.8 |
| 9.3 | 62.9 |
| 7.8 | 66.1 |
| 8.4 | 66 |
| 8.4 | 63.7 |
| 10.4 | 61.8 |
| 9.9 | 65.1 |
| 6.6 | 63.9 |
| 10.1 | 62.3 |
| 10.2 | 64.9 |
| 11.6 | 65.1 |
| 8.4 | 64.5 |
| 10.4 | 64.1 |
| 8.0 | 66.9 |
| 9.2 | 64.6 |
| 9.5 | 62.8 |
| 6.1 | 64.2 |
| 6.5 | 59.9 |
| 8.6 | 62.8 |
| 8.7 | 67.2 |
| 13.0 | 65.9 |
| 10.4 | 63.9 |
| 8.0 | 64.2 |
| 10.3 | 62.5 |
| 10.7 | 62.8 |
| 10.5 | 59 |
| 19.0 | 62.1 |
| 8.7 | 65.2 |
| 6.1 | 61.3 |
| 7.2 | 66.7 |
| 7.8 | 62.8 |
| 9.7 | 62.2 |
| 10.0 | 66.2 |
| 9.5 | 62.5 |
| 9.6 | 66.7 |
| 8.2 | 66.4 |
| 9.9 | 66.6 |
| 9.5 | 63.8 |
| 10.3 | 61.6 |
| 10.0 | 66 |
| 10.2 | 66 |
| 8.3 | 64.9 |
| 7.9 | 63.5 |
| 6.5 | 67 |
| 10.4 | 62.1 |
| 8.3 | 63.9 |
| 10.4 | 65.3 |
| 8.2 | 65 |
| 8.9 | 65.3 |
| 6.0 | 60.5 |
| 6.0 | 67.4 |
| 14.1 | 58.6 |
| 9.5 | 64.5 |
| 10.5 | 65.8 |
| 9.1 | 63.5 |
| 11.2 | 63 |
| 6.4 | 58.9 |
| 7.6 | 66.6 |
| 6.7 | 64.7 |
| 9.0 | 62.3 |
| 8.3 | 57.2 |
| 8.9 | 66 |
| 7.2 | 63.9 |
| 10.9 | 63.1 |
| 8.9 | 63.9 |
| 10.4 | 60.5 |
| 9.4 | 66.1 |
| 9.0 | 61 |
| 7.8 | 63.9 |
| 12.4 | 61.7 |
| 6.9 | 63.4 |
| 9.5 | 60.6 |
| 6.1 | 64.6 |
| 6.7 | 63.8 |
| 6.0 | 58.8 |
| 9.9 | 65.8 |
| 10.1 | 64.1 |
| 9.9 | 61.5 |
| 7.0 | 62.8 |
| 12.4 | 60.3 |
| 6.2 | 61.2 |
| 7.0 | 59 |
| 8.5 | 64 |
| 11.3 | 63.1 |
| 8.8 | 63.7 |
| 9.7 | 63.6 |
| 7.2 | 63.5 |
| 12.8 | 59.5 |
| 7.5 | 63.2 |
| 13.8 | 59.5 |
| 14.0 | 62.9 |
| 8.8 | 60.8 |
| 9.6 | 58.3 |
| 9.6 | 58.7 |
| 9.2 | 64.4 |
| 8.6 | 61.1 |
| 8.3 | 64 |
| 7.7 | 64.9 |
| 7.8 | 63.4 |
| 7.1 | 64.7 |
| 7.9 | 64.6 |
| 7.0 | 66.2 |
| 7.0 | 67.3 |
| 6.7 | 68.2 |
| 7.9 | 64 |
| 7.1 | 66.6 |
| 6.5 | 69.2 |
| 7.0 | 63.3 |
| 6.5 | 67.1 |
| 7.7 | 67.8 |
| 6.4 | 66.8 |
| 6.7 | 68.1 |
| 7.1 | 66.7 |
| 7.1 | 67.1 |
| 7.5 | 66.1 |
| 7.1 | 67 |
| 6.4 | 68.2 |
| 7.4 | 64.3 |
| 6.9 | 65.7 |
| 6.4 | 68.8 |
| 5.9 | 67.5 |
| 6.7 | 66.3 |
| 7.5 | 68.4 |
| 7.7 | 63.9 |
| 6.7 | 68.5 |
| 7.6 | 65.3 |
| 6.2 | 63.8 |
| 6.0 | 68 |
| 6.4 | 67 |
| 6.4 | 67.2 |
| 6.5 | 66.4 |
| 6.5 | 67.9 |
| 7.5 | 67 |
| 7.1 | 61.5 |
| 6.3 | 65.9 |
| 6.8 | 69 |
| 6.8 | 65.6 |
| 6.6 | 69.4 |
| 7.3 | 66.2 |
| 7.1 | 67.1 |
| 6.5 | 66.3 |
| 6.2 | 66.6 |
| 6.0 | 68.2 |
| 7.6 | 63.8 |
| 7.0 | 68.3 |
| 6.8 | 68.4 |
| 7.1 | 67.4 |
| 6.9 | 67.5 |
| 6.8 | 63.2 |
| 6.5 | 68.4 |
| 7.8 | 66.2 |
| 7.5 | 67.3 |
| 7.2 | 67.8 |
| 6.7 | 68.1 |
| 6.0 | 68.3 |
| 6.9 | 66.9 |
| 7.1 | 68.5 |
| 6.7 | 67.7 |
| 6.7 | 65 |
| 6.7 | 68.7 |
| 6.2 | 68.3 |
| 6.4 | 69.8 |
| 6.9 | 69.4 |
| 6.6 | 67.3 |
| 7.7 | 67.2 |
| 6.5 | 66 |
| 5.7 | 68.6 |
| 7.0 | 68.4 |
| 6.7 | 67.8 |
| 6.6 | 68.7 |
| 6.5 | 70.1 |
| 7.0 | 68.2 |
| 6.5 | 69.6 |
| 6.3 | 69.5 |
| 5.9 | 68.8 |
| 5.7 | 69.9 |
| 6.4 | 67.6 |
| 4.0 | 65.8 |
| 6.8 | 67.7 |
| 6.4 | 68.3 |
| 6.9 | 66.8 |
| 6.7 | 65.7 |
| 7.0 | 68.5 |
| 6.8 | 68.2 |
| 7.1 | 66.7 |
| 5.1 | 70.9 |
| 6.9 | 67.5 |
| 5.6 | 70 |
| 6.2 | 68.8 |
| 6.1 | 68.7 |
| 6.2 | 67.7 |
| 7.4 | 70.5 |
| 6.2 | 66.6 |
| 6.3 | 68.9 |
| 6.5 | 67.7 |
| 5.3 | 68.5 |
| 4.7 | 64.1 |
| 5.9 | 70.7 |
| 7.4 | 66.4 |
| 7.4 | 68.4 |
| 6.6 | 66.1 |
| 6.5 | 69.1 |
| 6.8 | 68.1 |
| 5.5 | 69.8 |
| 6.4 | 68.5 |
| 6.4 | 68.1 |
| 5.8 | 69.3 |
| 6.5 | 65.6 |
| 7.0 | 67.5 |
| 6.3 | 68.5 |
| 6.8 | 62 |
| 6.6 | 68.2 |
| 7.0 | 69.6 |
| 6.0 | 68.1 |
| 5.0 | 63.3 |
| 6.8 | 66.6 |
| 6.1 | 64.3 |
| 6.5 | 70 |
| 6.0 | 68.5 |
| 7.3 | 61.4 |
| 6.8 | 68.9 |
| 6.1 | 68.8 |
| 8.4 | 65.8 |
| 3.5 | 63.3 |
| 7.5 | 66.8 |
| 6.1 | 66.6 |
| 6.5 | 66.7 |
| 5.9 | 68.5 |
| 5.0 | 65.5 |
| 5.2 | 68.6 |
| 5.8 | 67.7 |
| 6.1 | 68 |
| 6.9 | 68.2 |
| 6.6 | 65.9 |
| 6.8 | 69.8 |
| 7.5 | 63.8 |
| 6.6 | 69.3 |
| 4.0 | 68.6 |
| 6.9 | 67.7 |
| 5.5 | 69.7 |
| 6.4 | 69.1 |
| 6.1 | 67.1 |
| 5.2 | 68.4 |
| 7.6 | 66.3 |
| 6.7 | 59.9 |
| 6.8 | 68.4 |
| 6.5 | 69 |
| 6.3 | 69.4 |
| 5.3 | 68.4 |
| 6.4 | 63.4 |
| 6.7 | 66.4 |
| 5.6 | 68.5 |
| 5.9 | 68.6 |
| 7.3 | 66.3 |
| 5.3 | 69.4 |
| 6.1 | 69.2 |
| 5.8 | 66.4 |
| 6.9 | 67 |
| 6.3 | 68 |
| 6.2 | 68.1 |
| 6.5 | 69.7 |
| 6.5 | 63 |
| 6.6 | 68 |
| 6.8 | 66.9 |
| 7.0 | 68.6 |
| 5.7 | 65.5 |
| 6.2 | 69.4 |
| 6.8 | 69 |
| 7.8 | 66.6 |
| 5.6 | 67.7 |
| 7.1 | 67.2 |
| 6.3 | 67.6 |
| 5.7 | 69.2 |
| 3.4 | 57.8 |
| 5.7 | 69 |
| 5.6 | 67.9 |
| 6.1 | 68 |
| 6.5 | 68 |
| 5.6 | 67.9 |
| 7.3 | 68.1 |
| 7.6 | 64.1 |
| 7.0 | 68 |
| 5.3 | 69.8 |
| 5.1 | 67.7 |
| 6.7 | 68 |
| 6.6 | 68.1 |
| 6.5 | 68.5 |
| 6.8 | 67.1 |
| 5.6 | 68.9 |
| 6.3 | 69.1 |
| 4.7 | 66.8 |
| 7.7 | 68.2 |
| 6.4 | 66.6 |
| 7.2 | 64.7 |
| 6.9 | 68.8 |
| 7.9 | 66.6 |
| 6.8 | 69.2 |
| 7.8 | 66.2 |
| 6.0 | 69.8 |
| 6.2 | 66 |
| 6.1 | 66.7 |
| 7.3 | 67.1 |
| 5.7 | 69.5 |
| 5.6 | 67.9 |
| 8.0 | 68.4 |
| 7.1 | 67.4 |
| 6.1 | 69 |
| 10.0 | 71.1 |
| 5.3 | 68.4 |
| 3.8 | 66.5 |
| 6.1 | 65 |
| 6.8 | 66.5 |
| 5.9 | 67.4 |
| 7.0 | 68.2 |
| 5.5 | 66.7 |
| 6.4 | 68.6 |
| 6.6 | 62.5 |
| 6.1 | 66.1 |
| 6.9 | 69.1 |
| 5.2 | 67.8 |
| 5.1 | 66.7 |
| 4.4 | 67.9 |
| 6.8 | 66.4 |
| 6.7 | 62.2 |
| 7.2 | 67.4 |
| 5.9 | 69.5 |
| 6.3 | 69.4 |
| 7.7 | 62.9 |
| 6.0 | 67.4 |
| 5.9 | 68.2 |
| 6.3 | 68.5 |
| 6.3 | 67.7 |
| 6.8 | 67.8 |
| 5.4 | 67.9 |
| 6.0 | 68.1 |
| 6.3 | 67.4 |
| 7.6 | 65.8 |
| 5.2 | 68.5 |
| 6.4 | 66.6 |
| 4.8 | 68.2 |
| 6.8 | 62.6 |
| 6.6 | 68.4 |
| 5.3 | 65.4 |
| 6.2 | 67.4 |
| 5.7 | 68.7 |
| 5.9 | 63 |
| 4.4 | 69.8 |
| 3.9 | 70.2 |
| 6.9 | 67.9 |
| 4.7 | 64.3 |
| 6.0 | 68.1 |
| 8.3 | 67.7 |
| 6.4 | 62.7 |
| 6.1 | 67.6 |
| 6.1 | 67.8 |
| 5.5 | 69.4 |
| 5.4 | 66.9 |
| 6.0 | 68.3 |
| 6.2 | 67.8 |
| 6.0 | 65.3 |
| 6.2 | 67.8 |
| 6.6 | 67.9 |
| 6.8 | 69 |
| 5.3 | 62.2 |
| 5.8 | 68.5 |
| 6.9 | 68 |
| 6.1 | 68.4 |
| 6.2 | 68.3 |
| 6.6 | 68.6 |
| 6.6 | 70.5 |
| 6.0 | 68.7 |
| 6.2 | 69.6 |
| 7.0 | 68.9 |
| 7.1 | 66.3 |
| 7.7 | 65.8 |
| 6.6 | 66.9 |
| 7.1 | 69 |
| 7.2 | 67.6 |
| 6.0 | 67.8 |
| 5.5 | 69 |
| 6.6 | 69.5 |
| 5.5 | 66.5 |
| 6.1 | 69.6 |
| 6.0 | 68.4 |
| 6.0 | 68.5 |
| 5.3 | 68.7 |
| 4.2 | 68.9 |
| 5.7 | 67.2 |
| 4.7 | 67.3 |
| 5.4 | 64.6 |
| 5.4 | 69.8 |
| 5.4 | 68.2 |
| 4.9 | 58.9 |
| 6.1 | 68 |
| 6.0 | 66.9 |
| 6.2 | 65.9 |
| 5.4 | 69.9 |
| 5.5 | 69 |
| 6.8 | 66.3 |
| 5.9 | 69.6 |
| 6.5 | 67.3 |
| 5.5 | 66 |
| 6.3 | 66.5 |
| 6.6 | 68.1 |
| 5.5 | 69.6 |
| 6.1 | 69.1 |
| 3.4 | 63.9 |
| 5.3 | 69.4 |
| 5.0 | 70.7 |
| 6.2 | 68.2 |
| 6.7 | 68.9 |
| 6.1 | 68.8 |
| 5.5 | 68.5 |
| 4.1 | 63.9 |
| 6.5 | 64.9 |
| 5.6 | 67 |
| 5.5 | 67.4 |
| 5.1 | 67.9 |
| 7.3 | 67.6 |
| 5.7 | 67.1 |
| 5.4 | 66.1 |
| 4.3 | 70 |
| 6.2 | 68.2 |
| 5.3 | 69.7 |
| 4.8 | 62.5 |
| 5.5 | 62.3 |
| 6.8 | 71.2 |
| 6.6 | 68.7 |
| 6.4 | 64.9 |
| 5.1 | 67.8 |
| 6.2 | 65.3 |
| 3.9 | 69.9 |
| 5.5 | 68 |
| 6.0 | 67.9 |
| 6.8 | 58.1 |
| 6.0 | 68.6 |
| 6.2 | 67.7 |
| 5.0 | 70.1 |
| 6.5 | 68.3 |
| 6.9 | 68.1 |
| 4.5 | 66 |
| 6.2 | 68.7 |
| 6.2 | 67.4 |
| 5.4 | 67.3 |
| 5.3 | 68.1 |
| 4.7 | 65.6 |
| 5.5 | 67.2 |
| 5.5 | 68.5 |
| 6.2 | 66.7 |
| 6.6 | 68.5 |
| 6.1 | 67 |
| 4.7 | 64.9 |
| 5.9 | 68.5 |
| 5.3 | 62.2 |
| 4.3 | 68.5 |
| 5.0 | 67.9 |
| 5.2 | 68.5 |
| 4.9 | 62.2 |
| 5.6 | 70.6 |
| 5.1 | 69.3 |
| 5.7 | 67.3 |
| 6.1 | 66.4 |
| 6.1 | 69.8 |
| 7.3 | 64.5 |
| 7.1 | 64.3 |
| 6.2 | 67.3 |
| 5.7 | 67.5 |
| 4.3 | 65.4 |
| 5.0 | 67.4 |
| 6.5 | 67.4 |
| 5.2 | 68.8 |
| 6.9 | 69.4 |
| 8.3 | 66.1 |
| 5.4 | 69.3 |
| 4.7 | 67.2 |
| 7.4 | 64.6 |
| 7.3 | 65.4 |
| 4.5 | 66.8 |
| 4.9 | 68.7 |
| 6.2 | 69 |
| 5.8 | 62.8 |
| 6.3 | 60.8 |
| 5.1 | 64.1 |
| 7.1 | 66.7 |
| 7.0 | 68 |
| 7.6 | 69.3 |
| 6.2 | 67.2 |
| 6.1 | 68 |
| 6.5 | 69.2 |
| 7.9 | 69.1 |
| 7.0 | 67.4 |
| 4.9 | 66.4 |
| 7.0 | 66 |
| 5.1 | 68.3 |
| 6.9 | 69.1 |
| 7.2 | 68.6 |
| 4.2 | 65.8 |
| 6.4 | 69.5 |
| 6.4 | 66.9 |
| 3.8 | 67.9 |
| 4.6 | 66.7 |
| 6.0 | 65.4 |
| 7.0 | 57.6 |
| 6.3 | 65.5 |
| 6.4 | 63.1 |
| 5.2 | 68.8 |
| 6.4 | 68.1 |
| 6.3 | 68.9 |
| 6.9 | 69.4 |
| 7.8 | 66.7 |
| 6.2 | 67.3 |
| 5.0 | 66.9 |
| 4.9 | 70.1 |
| 5.5 | 68.5 |
| 8.0 | 61.7 |
| 3.8 | 70.9 |
| 6.3 | 64.3 |
| 6.8 | 63 |
| 7.1 | 68.3 |
| 6.1 | 70.1 |
| 5.6 | 64.2 |
| 5.4 | 68.7 |
| 4.8 | 68.6 |
| 5.3 | 67.3 |
| 5.9 | 67.8 |
| 5.3 | 67.3 |
| 5.1 | 69 |
| 3.8 | 64.6 |
| 4.8 | 69.3 |
| 6.5 | 67.6 |
| 5.4 | 69.2 |
| 5.9 | 69 |
| 4.6 | 64.6 |
| 4.2 | 69.6 |
| 4.0 | 69.8 |
| 3.7 | 65.8 |
| 4.7 | 63.5 |
| 7.0 | 68.5 |
| 5.3 | 69.6 |
| 5.7 | 64 |
| 5.9 | 67.7 |
| 7.6 | 65.8 |
| 5.6 | 68.8 |
| 7.0 | 62.1 |
| 9.9 | 67.7 |
| 5.4 | 69 |
| 8.6 | 60.5 |
| 5.1 | 61.2 |
| 7.5 | 67.5 |
| 6.3 | 62.7 |
| 6.5 | 70 |
| 5.5 | 69.7 |
| 4.5 | 67.2 |
| 5.3 | 69.4 |
| 7.7 | 68.9 |
| 6.5 | 68.2 |
| 5.9 | 69.1 |
| 6.6 | 69 |
| 7.0 | 62.6 |
| 5.1 | 63.1 |
| 4.1 | 70.7 |
| 6.6 | 69.1 |
| 4.8 | 62.9 |
| 4.3 | 66.7 |
| 4.8 | 70.3 |
| 6.6 | 67.8 |
| 5.2 | 64.5 |
| 5.3 | 69.4 |
| 6.2 | 67.5 |
| 8.9 | 66.3 |
| 6.2 | 60.4 |
| 5.5 | 68.8 |
| 6.1 | 66.1 |
| 4.8 | 66.9 |
| 7.5 | 68.3 |
| 4.1 | 64.8 |
| 10.4 | 66.5 |
| 2.4 | 66.7 |
| 6.1 | 70.3 |
| 6.3 | 66.8 |
| 4.9 | 67.5 |
| 8.2 | 68.8 |
| 5.1 | 66.1 |
| 3.5 | 68.1 |
| 6.2 | 69.9 |
| 7.2 | 66.6 |
| 6.2 | 68.1 |
| 6.3 | 68.6 |
| 4.5 | 62.1 |
| 2.7 | 61.6 |
| 6.5 | 70 |
| 6.3 | 67.7 |
| 3.2 | 69.5 |
| 4.3 | 66.6 |
| 4.2 | 69.3 |
| 7.1 | 69.7 |
| 6.3 | 62 |
| 4.4 | 69.8 |
| 6.6 | 64.3 |
| 6.2 | 69.3 |
| 5.5 | 65.8 |
| 4.7 | 63.7 |
| 6.0 | 68.1 |
| 4.3 | 68.9 |
| 6.9 | 67.2 |
| 4.8 | 68.2 |
| 3.8 | 71.9 |
| 6.5 | 67.4 |
| 2.5 | 63.3 |
| 5.1 | 69.2 |
| 5.7 | 68.4 |
| 6.4 | 65.5 |
| 7.2 | 61.9 |
| 4.3 | 68.9 |
| 7.1 | 65.5 |
| 6.0 | 68.5 |
| 5.1 | 67.9 |
| 5.4 | 67.1 |
| 4.9 | 69 |
| 6.7 | 65.8 |
| 5.0 | 69.2 |
| 5.4 | 68.7 |
| 2.3 | 67.3 |
| 3.9 | 60.8 |
| 4.8 | 68.7 |
| 2.3 | 59.8 |
| 5.6 | 63.7 |
| 5.6 | 68.6 |
| 5.1 | 68.2 |
| 5.1 | 70.7 |
| 3.5 | 68.7 |
| 3.1 | 68 |
| 5.3 | 67.3 |
| 5.7 | 67.4 |
| 6.7 | 64.8 |
| 2.6 | 62.1 |
| 4.1 | 64.6 |
| 5.8 | 66 |
| 4.9 | 60 |
| 5.9 | 68 |
| 4.3 | 67.7 |
| 4.8 | 66.3 |
| 5.1 | 69.2 |
| 3.7 | 66.7 |
| 5.2 | 68 |
| 4.5 | 69.7 |
| 7.2 | 67.4 |
| 4.4 | 60.9 |
| 4.0 | 63.9 |
| 2.6 | 66.8 |
| 6.2 | 66.6 |
| 3.3 | 68.6 |
| 9.3 | 65.9 |
| 9.9 | 64.3 |
| 5.1 | 66.7 |
| 4.0 | 59.8 |
| 4.3 | 67 |
| 3.3 | 69.7 |
| 4.0 | 70.1 |
| 4.9 | 62.6 |
| 4.4 | 66.5 |
| 4.2 | 63.5 |
| 5.3 | 71.7 |
| 3.3 | 66.8 |
| 3.3 | 70.6 |
| 5.3 | 66.7 |
| 4.3 | 62.8 |
| 5.9 | 68.3 |
| 2.8 | 67.1 |
| 5.7 | 66.7 |
| 10.3 | 59 |
| 4.4 | 67.8 |
| 4.5 | 69.1 |
| 6.7 | 68.5 |
| 6.1 | 69.3 |
| 2.8 | 61.4 |
| 5.6 | 68.1 |
| 6.7 | 63.5 |
| 2.8 | 69.5 |
| 5.9 | 68.1 |
| 5.4 | 68.2 |
| 4.2 | 67.6 |
| 5.9 | 66.4 |
| 6.9 | 69.8 |
| 7.7 | 63.2 |
| 2.5 | 64.2 |
| 4.4 | 68.4 |
| 3.4 | 67.9 |
| 5.0 | 66.6 |
| 4.1 | 69.2 |
| 7.7 | 63.8 |
| 6.9 | 66.1 |
| 5.6 | 64.7 |
| 2.8 | 63.9 |
| 3.7 | 62.6 |
| 4.6 | 66.6 |
| 7.6 | 61.3 |
| 4.3 | 67.3 |
| 4.3 | 68.1 |
| 3.0 | 67.6 |
| 6.6 | 65.2 |
| 5.2 | 63.8 |
| 6.7 | 61.1 |
| 8.6 | 60.9 |
| 5.1 | 62.9 |
| 4.6 | 68.7 |
| 6.9 | 63 |
| 6.1 | 64.1 |
| 5.3 | 62.1 |
| 5.3 | 67.9 |
| 1.1 | 65.1 |
| 5.7 | 66.6 |
| 4.8 | 59.1 |
| 4.6 | 60.3 |
| 7.5 | 61.1 |
| 4.8 | 69.2 |
| 2.4 | 62.1 |
| 3.7 | 67.7 |
| 3.6 | 62.8 |
| 9.8 | 62.8 |
| 3.3 | 69.4 |
| 1.4 | 61.8 |
| 4.8 | 67.2 |
| 3.5 | 63.6 |
| 4.6 | 59.1 |
| 2.8 | 68.2 |
| 2.4 | 60.5 |
| 4.7 | 69.1 |
| 2.4 | 62.2 |
| 5.5 | 64.2 |
| 4.1 | 61.5 |
| 2.9 | 60.1 |
| 4.2 | 64.3 |
| 4.2 | 67 |
| 4.3 | 61.7 |
| 4.9 | 63.3 |
| 3.2 | 65.4 |
| 7.1 | 65.8 |
| 3.0 | 65.5 |
| 3.4 | 65 |
| 3.5 | 58.8 |
| 7.4 | 62.9 |
| 8.0 | 68.4 |
| 3.8 | 61.8 |
| 2.3 | 61.7 |
| 12.6 | 69.8 |
| 11.6 | 68.6 |
| 11.7 | 69.2 |
| 11.6 | 69 |
| 12.2 | 68.9 |
| 10.9 | 70.2 |
| 12.1 | 69.6 |
| 11.3 | 70 |
| 13.2 | 70.5 |
| 12.4 | 69.5 |
| 12.3 | 70.3 |
| 11.7 | 68.2 |
| 12.3 | 70.3 |
| 11.9 | 69.2 |
| 11.2 | 70.5 |
| 9.2 | 46.6 |
| 8.8 | 46.8 |
| 9.0 | 48.2 |
| 9.0 | 47.6 |
| 8.9 | 47 |
| 9.1 | 45.6 |
| 8.5 | 51.7 |
| 8.5 | 46.8 |
| 9.0 | 45.3 |
| 8.7 | 46.7 |
| 8.9 | 50.3 |
| 8.9 | 47.3 |
| 9.2 | 46.3 |
| 8.8 | 50.4 |
| 7.9 | 44.5 |
| 8.6 | 49.5 |
| 8.5 | 45.9 |
| 8.3 | 50.1 |
| 9.3 | 45.9 |
| 8.9 | 46.6 |
| 8.2 | 47.7 |
| 8.5 | 44.9 |
| 8.8 | 52.6 |
| 9.2 | 46 |
| 8.6 | 46.1 |
| 5.7 | 55.6 |
| 8.6 | 48 |
| 9.2 | 48.9 |
| 8.5 | 46.6 |
| 6.6 | 41.7 |
| 8.0 | 46.5 |
| 8.6 | 47.1 |
| 8.6 | 43 |
| 7.4 | 57.4 |
| 11.4 | 52.6 |
| 8.2 | 46.7 |
| 8.9 | 47.9 |
| 8.2 | 46.1 |
| 7.7 | 53 |
| 7.3 | 54.2 |
| 11.6 | 52.5 |
| 8.5 | 48.8 |
| 11.5 | 50.4 |
| 8.0 | 55.4 |
| 9.3 | 46.1 |
| 8.9 | 52 |
| 8.4 | 45.2 |
| 6.6 | 53.1 |
| 8.0 | 53.8 |
| 8.8 | 53.4 |
| 7.8 | 47.2 |
| 8.0 | 52.4 |
| 8.1 | 53.7 |
| 8.7 | 49.2 |
| 6.0 | 58.2 |
| 9.0 | 47.1 |
| 6.4 | 52.5 |
| 9.7 | 49.1 |
| 11.4 | 47.5 |
| 8.9 | 46.2 |
| 5.4 | 52 |
| 8.4 | 53.3 |
| 5.4 | 53.3 |
| 8.2 | 54.3 |
| 9.3 | 46.4 |
| 7.6 | 54.5 |
| 7.4 | 47.9 |
| 10.7 | 53.2 |
| 5.8 | 51.9 |
| 6.3 | 49.3 |
| 10.6 | 54.6 |
| 7.6 | 62.5 |
| 7.2 | 63.6 |
| 7.0 | 63.7 |
| 7.1 | 63.9 |
| 7.0 | 64.1 |
| 7.0 | 65.5 |
| 6.8 | 66.2 |
| 7.4 | 64.5 |
| 7.4 | 64.5 |
| 6.6 | 62.2 |
| 6.8 | 63.8 |
| 6.9 | 63.7 |
| 7.0 | 65.6 |
| 6.6 | 63.6 |
| 6.6 | 61.9 |
| 6.5 | 65.5 |
| 6.6 | 64.9 |
| 7.6 | 66.1 |
| 6.9 | 65.6 |
| 7.4 | 65 |
| 7.1 | 65.4 |
| 6.6 | 63.9 |
| 6.8 | 63.4 |
| 6.1 | 62.5 |
| 5.7 | 67.1 |
| 6.6 | 63.1 |
| 6.9 | 66.1 |
| 6.4 | 64.2 |
| 7.2 | 66.2 |
| 6.4 | 66.1 |
| 6.4 | 65.5 |
| 6.8 | 64.7 |
| 5.9 | 64.6 |
| 6.4 | 63.2 |
| 7.4 | 64.6 |
| 7.3 | 62.1 |
| 7.9 | 63.8 |
| 6.5 | 64.8 |
| 6.7 | 65.5 |
| 6.7 | 66.4 |
| 5.6 | 64.8 |
| 5.7 | 63.7 |
| 6.5 | 61.9 |
| 7.3 | 64.5 |
| 5.2 | 67.6 |
| 5.9 | 64.2 |
| 5.3 | 65.9 |
| 6.0 | 65.8 |
| 7.2 | 65.1 |
| 5.4 | 66.2 |
| 6.6 | 65.3 |
| 7.2 | 61.8 |
| 6.1 | 65.5 |
| 5.8 | 64 |
| 6.9 | 62.6 |
| 6.4 | 66 |
| 6.3 | 66.8 |
| 6.3 | 65.8 |
| 7.2 | 66.2 |
| 6.1 | 63.9 |
| 6.7 | 61.9 |
| 7.0 | 65.1 |
| 7.2 | 65.5 |
| 7.0 | 66.9 |
| 6.4 | 64.8 |
| 6.1 | 63.9 |
| 5.4 | 65.5 |
| 5.9 | 65.9 |
| 7.6 | 65.2 |
| 5.1 | 64.8 |
| 6.9 | 65.9 |
| 5.8 | 63.8 |
| 6.5 | 64.3 |
| 6.2 | 65.6 |
| 6.9 | 65.5 |
| 6.3 | 66.6 |
| 6.9 | 64.7 |
| 5.5 | 64.1 |
| 6.4 | 65.2 |
| 5.5 | 65.2 |
| 5.3 | 66.2 |
| 7.1 | 64.2 |
| 5.8 | 66.9 |
| 6.6 | 66.4 |
| 7.4 | 65 |
| 6.5 | 64.9 |
| 5.5 | 65.6 |
| 7.2 | 64.1 |
| 7.2 | 63.1 |
| 6.1 | 64.4 |
| 5.9 | 65.4 |
| 5.8 | 66.5 |
| 5.9 | 64.9 |
| 6.6 | 65.5 |
| 6.9 | 65.1 |
| 7.0 | 64.6 |
| 6.1 | 66.3 |
| 5.6 | 65.5 |
| 7.0 | 66 |
| 5.4 | 66.2 |
| 6.8 | 66 |
| 7.2 | 62.2 |
| 6.8 | 64.7 |
| 5.2 | 67.3 |
| 7.1 | 67.3 |
| 6.2 | 63.3 |
| 7.7 | 65.4 |
| 6.7 | 66.8 |
| 6.2 | 66.3 |
| 6.1 | 64.6 |
| 4.4 | 66.4 |
| 6.8 | 65.4 |
| 6.8 | 65.7 |
| 6.1 | 61.2 |
| 4.1 | 66.2 |
| 6.1 | 65.3 |
| 5.8 | 66.4 |
| 7.2 | 65.7 |
| 5.5 | 67.7 |
| 5.8 | 68.2 |
| 5.5 | 67.6 |
| 5.7 | 66.7 |
| 6.0 | 62.4 |
| 6.8 | 66.5 |
| 4.8 | 65.9 |
| 5.5 | 68 |
| 5.8 | 66.3 |
| 7.1 | 63.4 |
| 6.2 | 66.4 |
| 5.8 | 61.1 |
| 5.7 | 63.6 |
| 5.9 | 65 |
| 5.7 | 66.1 |
| 6.7 | 66.6 |
| 6.9 | 64.9 |
| 5.8 | 66.5 |
| 7.2 | 62.7 |
| 6.8 | 66.3 |
| 6.2 | 64.2 |
| 5.9 | 66.1 |
| 4.3 | 65.7 |
| 6.8 | 63.3 |
| 6.5 | 63.9 |
| 7.8 | 64.8 |
| 6.2 | 66.2 |
| 5.1 | 67.7 |
| 5.0 | 66.3 |
| 4.6 | 66.3 |
| 5.5 | 65.6 |
| 7.0 | 61.6 |
| 5.0 | 65.8 |
| 5.6 | 67.2 |
| 7.1 | 63.8 |
| 4.5 | 65.9 |
| 7.1 | 66.2 |
| 6.8 | 66.4 |
| 5.4 | 66.3 |
| 6.3 | 65.1 |
| 6.3 | 63.7 |
| 6.1 | 65.4 |
| 4.0 | 64.2 |
| 4.8 | 63.9 |
| 4.8 | 64.1 |
| 7.1 | 63.6 |
| 6.0 | 68.5 |
| 6.8 | 63.5 |
| 4.1 | 64.1 |
| 6.2 | 63.7 |
| 5.3 | 66.3 |
| 8.3 | 63.2 |
| 6.2 | 66.9 |
| 5.9 | 66.5 |
| 6.2 | 66.5 |
| 5.0 | 65.7 |
| 5.7 | 63.8 |
| 6.0 | 66.4 |
| 6.0 | 66.8 |
| 5.9 | 63.7 |
| 4.3 | 65.3 |
| 6.8 | 67.7 |
| 5.4 | 62.8 |
| 5.7 | 64.9 |
| 5.3 | 64.2 |
| 4.6 | 63.7 |
| 4.0 | 63.4 |
| 6.5 | 61.6 |
| 8.3 | 67.8 |
| 5.9 | 63.8 |
| 4.8 | 63.9 |
| 3.8 | 62.3 |
| 5.9 | 64.4 |
| 5.9 | 66.6 |
| 4.1 | 66 |
| 5.8 | 64.9 |
| 6.7 | 65.3 |
| 4.3 | 64.5 |
| 5.8 | 68 |
| 8.1 | 61.2 |
| 5.8 | 66.2 |
| 7.8 | 61.9 |
| 5.4 | 64.8 |
| 4.1 | 66.9 |
| 5.8 | 63.3 |
| 6.3 | 63.1 |
| 6.1 | 66.4 |
| 4.6 | 65.8 |
| 4.6 | 65.7 |
| 6.9 | 66.3 |
| 6.0 | 66.4 |
| 4.1 | 64.1 |
| 7.0 | 65 |
| 7.8 | 64.4 |
| 4.4 | 66.9 |
| 5.1 | 66.5 |
| 4.3 | 63.8 |
| 5.6 | 67.3 |
| 4.5 | 67.1 |
| 5.3 | 66.4 |
| 4.3 | 66 |
| 5.0 | 63.8 |
| 3.5 | 62.6 |
| 4.3 | 66.4 |
| 5.5 | 68.7 |
| 5.9 | 65.6 |
| 4.6 | 63.9 |
| 6.3 | 64.6 |
| 4.2 | 66.3 |
| 5.2 | 63.4 |
| 6.5 | 63.4 |
| 6.7 | 64 |
| 4.6 | 65.6 |
| 6.4 | 66 |
| 4.2 | 63.8 |
| 7.5 | 66.3 |
| 7.5 | 63 |
| 4.5 | 62.7 |
| 5.3 | 63.5 |
| 4.2 | 66.3 |
| 6.1 | 64.8 |
| 4.9 | 66 |
| 4.6 | 66.8 |
| 5.2 | 64.4 |
| 5.7 | 63.6 |
| 3.7 | 65.6 |
| 5.4 | 64 |
| 5.5 | 63.1 |
| 5.9 | 67.3 |
| 5.2 | 65.2 |
| 7.3 | 64.6 |
| 3.9 | 66.5 |
| 5.6 | 67.1 |
| 5.0 | 64.3 |
| 5.8 | 65.5 |
| 6.2 | 62.6 |
| 5.2 | 62.1 |
| 6.4 | 66.4 |
| 4.7 | 64.2 |
| 3.7 | 62.7 |
| 3.6 | 66 |
| 5.9 | 65.4 |
| 8.2 | 63.7 |
| 4.5 | 67.9 |
| 5.0 | 65.4 |
| 5.8 | 62.6 |
| 5.3 | 65.8 |
| 5.6 | 65.5 |
| 3.9 | 65.9 |
| 6.4 | 66.9 |
| 6.3 | 64.4 |
| 5.6 | 62.6 |
| 6.0 | 62.5 |
| 3.5 | 64.4 |
| 4.8 | 67 |
| 6.4 | 64.3 |
| 7.8 | 64.9 |
| 5.3 | 66.7 |
| 3.4 | 65.2 |
| 3.4 | 65.9 |
| 4.0 | 65.5 |
| 4.5 | 60.1 |
| 4.5 | 66.7 |
| 4.0 | 66.2 |
| 4.0 | 65.9 |
| 4.2 | 64.7 |
| 5.9 | 63.4 |
| 5.7 | 65.2 |
| 6.8 | 68.7 |
| 6.2 | 64.5 |
| 4.6 | 64.7 |
| 5.3 | 66.4 |
| 3.9 | 65.7 |
| 7.8 | 63.2 |
| 3.0 | 62.2 |
| 4.1 | 62.7 |
| 4.4 | 62.3 |
| 4.1 | 66.8 |
| 5.7 | 64.3 |
| 4.8 | 65.5 |
| 3.2 | 66.5 |
| 3.8 | 57.7 |
| 4.2 | 65.1 |
| 4.4 | 64.3 |
| 6.5 | 64.3 |
| 6.1 | 61.4 |
| 4.8 | 64.5 |
| 6.2 | 62.7 |
| 5.1 | 66.4 |
| 4.0 | 61 |
| 7.2 | 64.2 |
| 5.5 | 68.4 |
| 5.8 | 67.5 |
| 3.2 | 65.4 |
| 7.9 | 63.5 |
| 4.2 | 61.4 |
| 6.3 | 61.3 |
| 3.8 | 62.1 |
| 3.6 | 64.6 |
| 4.9 | 61.3 |
| 5.3 | 64.5 |
| 5.5 | 64.8 |
| 4.6 | 65.8 |
| 4.5 | 64.5 |
| 5.3 | 65.7 |
| 6.6 | 63.9 |
| 3.8 | 61.4 |
| 7.3 | 64.6 |
| 5.9 | 66 |
| 4.0 | 62 |
| 3.5 | 63.1 |
| 4.6 | 64.3 |
| 3.7 | 66.1 |
| 3.7 | 58.6 |
| 3.8 | 68.6 |
| 5.7 | 62.2 |
| 8.1 | 63.5 |
| 4.4 | 57.5 |
| 6.1 | 63.8 |
| 4.9 | 67.3 |
| 6.6 | 66.9 |
| 5.4 | 64.2 |
| 5.4 | 62.6 |
| 8.1 | 63.6 |
| 3.6 | 64.8 |
| 3.0 | 64.4 |
| 6.7 | 66.3 |
| 7.1 | 63.7 |
| 2.5 | 64.2 |
| 3.2 | 64.6 |
| 3.2 | 62.7 |
| 5.2 | 64.7 |
| 4.9 | 61.8 |
| 5.4 | 66.3 |
| 3.5 | 62 |
| 7.3 | 60 |
| 4.1 | 61.9 |
| 3.9 | 66.8 |
| 3.8 | 63.9 |
| 3.1 | 65.2 |
| 5.3 | 62.7 |
| 5.3 | 63.4 |
| 4.2 | 61.3 |
| 3.9 | 55.1 |
| 3.1 | 61.6 |
| 3.7 | 61.1 |
| 3.2 | 60.6 |
| 3.7 | 63.5 |
| 3.7 | 64.5 |
| 2.3 | 62 |
| 3.2 | 70 |
| 4.6 | 64.1 |
| 4.8 | 64.2 |
| 4.3 | 67.6 |
| 5.3 | 62.3 |
| 2.9 | 63.4 |
| 4.3 | 60.7 |
| 2.8 | 64.1 |
| 2.7 | 59.9 |
| 6.0 | 66.8 |
| 2.7 | 63.5 |
| 3.7 | 61.9 |
| 3.2 | 54.7 |
| 2.9 | 61.6 |
| 3.4 | 63.2 |
| 2.6 | 61.9 |
| 3.5 | 62.6 |
| 6.7 | 60.6 |
| 3.6 | 57.1 |
| 4.6 | 63.1 |
| 2.4 | 60.5 |
| 1.2 | 62 |
| 3.8 | 59.8 |
| 3.3 | 62.6 |
| 3.1 | 63.5 |
| 2.5 | 62.1 |
| 2.1 | 56.1 |
| 8.1 | 65 |
| 2.6 | 61.1 |
| 122.6 | 72 |
| 76.0 | 66.4 |
| 69.7 | 70.5 |
| 100.8 | 69 |
| 95.0 | 70.5 |
| 89.6 | 71.3 |
| 36.9 | 68.1 |
| 43.8 | 67.7 |
| 55.9 | 70.5 |
| 62.2 | 69.8 |
| 14.5 | 67.1 |
| 125.3 | 69.3 |
| 110.2 | 69.3 |
| 101.2 | 69.6 |
| 110.1 | 69.2 |
| 90.1 | 70.5 |
| 51.8 | 69 |
| 104.3 | 68.5 |
| 108.2 | 67.3 |
| 94.0 | 71.2 |
| 98.5 | 69.9 |
| 29.2 | 63.4 |
| 127.0 | 69.8 |
| 61.4 | 65.4 |
| 97.8 | 69.3 |
| 111.0 | 70 |
| 106.4 | 68.7 |
| 101.2 | 70 |
| 98.3 | 68.4 |
| 123.3 | 66.6 |
| 90.6 | 68.4 |
| 98.0 | 68.1 |
| 55.7 | 67.2 |
| 16.8 | 72.5 |
| 128.4 | 66.5 |
| 90.6 | 71.7 |
| 56.6 | 67 |
| 108.8 | 67.6 |
| 11.9 | 66 |
| 84.6 | 71.7 |
| 35.5 | 67.9 |
| 86.5 | 71.2 |
| 85.9 | 70.3 |
| 85.8 | 69.4 |
| 29.1 | 69.9 |
| 76.7 | 71 |
| 126.4 | 67 |
| 34.8 | 68.1 |
| 24.8 | 68.2 |
| 102.9 | 68.2 |
| 19.8 | 67 |
| 92.5 | 70 |
| 40.9 | 72.2 |
| 89.6 | 71.1 |
| 15.1 | 66.7 |
| 83.4 | 70.3 |
| 79.8 | 70.7 |
| 66.9 | 68.5 |
| 107.1 | 69.2 |
| 14.7 | 63.2 |
| 104.6 | 69.7 |
| 43.5 | 67.5 |
| 114.7 | 68.1 |
| 87.9 | 70 |
| 99.8 | 68.3 |
| 100.0 | 68.5 |
| 97.6 | 68.5 |
| 91.2 | 69.9 |
| 96.6 | 69.1 |
| 98.4 | 68.9 |
| 75.6 | 68.2 |
| 123.7 | 68.4 |
| 21.5 | 67.2 |
| 132.6 | 65.6 |
| 107.6 | 71.8 |
| 107.5 | 69.2 |
| 49.6 | 68.7 |
| 111.6 | 69 |
| 15.2 | 67.7 |
| 104.5 | 68.6 |
| 84.9 | 70 |
| 102.1 | 69.5 |
| 124.3 | 64.8 |
| 89.4 | 68.7 |
| 128.2 | 70.6 |
| 27.8 | 66.7 |
| 89.6 | 69.6 |
| 110.4 | 68.7 |
| 61.0 | 69.7 |
| 100.8 | 68.1 |
| 59.3 | 64.7 |
| 96.8 | 68.6 |
| 67.1 | 67.9 |
| 15.1 | 66.8 |
| 99.7 | 68.9 |
| 106.2 | 67.2 |
| 89.3 | 71 |
| 100.4 | 68.8 |
| 36.6 | 66.2 |
| 68.0 | 65.5 |
| 107.0 | 68.8 |
| 94.4 | 69.8 |
| 99.6 | 66.7 |
| 81.3 | 70.7 |
| 99.5 | 69.2 |
| 14.7 | 64.9 |
| 29.6 | 66.8 |
| 50.5 | 65.9 |
| 78.6 | 71.4 |
| 105.5 | 69 |
| 99.0 | 68.9 |
| 29.4 | 68.5 |
| 96.1 | 67.2 |
| 90.9 | 70.5 |
| 32.5 | 66.4 |
| 91.0 | 69 |
| 74.6 | 71.3 |
| 96.2 | 67.7 |
| 91.7 | 68.9 |
| 90.1 | 68.6 |
| 79.3 | 67.8 |
| 114.0 | 69.1 |
| 18.0 | 69.2 |
| 92.8 | 70.1 |
| 83.8 | 69.6 |
| 110.8 | 68.9 |
| 58.2 | 70.2 |
| 100.8 | 70.6 |
| 95.2 | 69 |
| 86.8 | 69.9 |
| 86.4 | 72.6 |
| 76.7 | 71.2 |
| 93.1 | 69.6 |
| 84.9 | 67.4 |
| 109.2 | 67.7 |
| 74.8 | 69.4 |
| 120.7 | 67 |
| 19.9 | 70 |
| 114.6 | 67.6 |
| 78.6 | 69.2 |
| 91.0 | 69.5 |
| 94.4 | 70.6 |
| 122.2 | 67.5 |
| 90.9 | 67.5 |
| 98.8 | 67.6 |
| 69.4 | 64.8 |
| 70.8 | 70 |
| 97.0 | 69.5 |
| 80.5 | 70.3 |
| 89.7 | 69.2 |
| 85.1 | 70.7 |
| 78.2 | 70.2 |
| 79.0 | 70.7 |
| 45.3 | 68.5 |
| 33.1 | 69.2 |
| 13.6 | 70.2 |
| 44.3 | 65.9 |
| 43.3 | 69.6 |
| 110.4 | 68 |
| 34.2 | 63 |
| 100.9 | 67.7 |
| 84.8 | 69.8 |
| 30.5 | 62.9 |
| 85.8 | 69.3 |
| 119.1 | 65.8 |
| 69.2 | 67.4 |
| 85.2 | 66.4 |
| 95.7 | 69.2 |
| 113.6 | 62.4 |
| 26.5 | 68.3 |
| 61.6 | 64.9 |
| 31.8 | 64.3 |
| 103.9 | 66.2 |
| 94.5 | 69.4 |
| 87.7 | 68.9 |
| 66.6 | 70.5 |
| 15.2 | 60.7 |
| 23.0 | 66.9 |
| 93.0 | 70.1 |
| 117.5 | 66.2 |
| 80.3 | 71.3 |
| 92.5 | 68.4 |
| 89.7 | 69.4 |
| 79.1 | 69.9 |
| 91.6 | 68.4 |
| 77.6 | 69.4 |
| 96.6 | 69.3 |
| 52.4 | 66.7 |
| 84.8 | 68.7 |
| 99.3 | 68.2 |
| 27.3 | 68.5 |
| 46.7 | 64.2 |
| 20.4 | 68.6 |
| 87.3 | 67.8 |
| 77.9 | 71.1 |
| 59.5 | 72.7 |
| 95.4 | 70 |
| 121.0 | 69.4 |
| 95.0 | 65.8 |
| 110.2 | 65 |
| 15.5 | 69.3 |
| 79.1 | 69.6 |
| 49.3 | 67.7 |
| 96.2 | 68.5 |
| 55.2 | 64.6 |
| 57.6 | 69.9 |
| 92.0 | 67.2 |
| 94.3 | 68.7 |
| 37.1 | 69.8 |
| 110.9 | 68.2 |
| 108.6 | 70.1 |
| 59.2 | 68.2 |
| 22.3 | 66.6 |
| 77.0 | 68 |
| 66.2 | 67.4 |
| 90.7 | 67.6 |
| 101.1 | 67.2 |
| 79.0 | 70.7 |
| 46.9 | 67.4 |
| 72.3 | 71.8 |
| 22.2 | 67.2 |
| 69.5 | 67.8 |
| 73.4 | 70.6 |
| 55.6 | 64.6 |
| 67.4 | 70.3 |
| 87.6 | 68.7 |
| 120.5 | 65.6 |
| 18.8 | 67.5 |
| 49.4 | 67.2 |
| 104.6 | 67.8 |
| 21.0 | 67.7 |
| 106.5 | 65.6 |
| 77.8 | 69.1 |
| 25.0 | 70.1 |
| 64.3 | 69.2 |
| 78.6 | 69 |
| 56.3 | 70.1 |
| 114.3 | 67.3 |
| 87.1 | 68.5 |
| 25.9 | 68.5 |
| 102.0 | 69.1 |
| 97.2 | 67.1 |
| 54.4 | 67.9 |
| 88.8 | 68.8 |
| 69.2 | 68 |
| 69.0 | 70 |
| 74.4 | 64.7 |
| 48.9 | 66.7 |
| 93.7 | 68 |
| 107.4 | 68.2 |
| 14.4 | 69.5 |
| 88.8 | 66.2 |
| 79.2 | 70.6 |
| 73.4 | 67.3 |
| 15.4 | 68.2 |
| 84.6 | 68.5 |
| 94.2 | 69.1 |
| 13.8 | 63.8 |
| 80.9 | 65.9 |
| 111.4 | 66.6 |
| 60.7 | 69.2 |
| 36.4 | 63.7 |
| 89.3 | 64.5 |
| 13.7 | 66.3 |
| 109.0 | 66.8 |
| 94.1 | 67.6 |
| 89.8 | 68.6 |
| 78.8 | 68.5 |
| 81.1 | 69.2 |
| 15.1 | 68.5 |
| 94.6 | 66.5 |
| 118.6 | 63.1 |
| 82.2 | 70 |
| 111.0 | 66.6 |
| 89.6 | 68.9 |
| 61.0 | 69 |
| 30.0 | 69 |
| 70.8 | 66.5 |
| 27.4 | 67.6 |
| 85.4 | 67.8 |
| 52.1 | 70.4 |
| 94.6 | 66.3 |
| 24.7 | 69.4 |
| 78.5 | 70.6 |
| 75.9 | 72.5 |
| 16.9 | 68.5 |
| 81.7 | 68.3 |
| 27.7 | 65.9 |
| 72.8 | 70.5 |
| 70.6 | 69.5 |
| 26.1 | 67.4 |
| 14.6 | 67.9 |
| 75.9 | 68.6 |
| 79.1 | 68.2 |
| 126.7 | 62.7 |
| 82.3 | 68.8 |
| 88.7 | 67.4 |
| 10.7 | 68.4 |
| 81.1 | 68.1 |
| 80.9 | 67.9 |
| 17.2 | 69.2 |
| 39.9 | 68.4 |
| 81.5 | 67.7 |
| 67.4 | 70.6 |
| 40.2 | 67.7 |
| 74.4 | 70.9 |
| 61.4 | 69.1 |
| 100.0 | 64.9 |
| 91.6 | 67.7 |
| 21.3 | 69.4 |
| 86.8 | 67.6 |
| 85.2 | 69.5 |
| 93.6 | 66.9 |
| 67.3 | 67 |
| 77.0 | 69.5 |
| 17.0 | 70.7 |
| 79.6 | 68 |
| 77.2 | 68.2 |
| 101.0 | 67.1 |
| 79.9 | 68.5 |
| 85.1 | 65.9 |
| 33.9 | 67.8 |
| 27.1 | 66.4 |
| 57.9 | 66 |
| 22.9 | 67.1 |
| 78.0 | 67.8 |
| 85.8 | 68.8 |
| 70.6 | 69.6 |
| 108.5 | 67.2 |
| 87.2 | 67.3 |
| 15.8 | 67.2 |
| 15.5 | 70 |
| 85.4 | 66.3 |
| 20.0 | 67.1 |
| 17.1 | 65.2 |
| 82.9 | 66.9 |
| 15.9 | 67.9 |
| 70.8 | 68 |
| 64.9 | 69.3 |
| 89.0 | 67.6 |
| 89.5 | 69.3 |
| 62.7 | 68.4 |
| 93.2 | 67.2 |
| 62.6 | 68.6 |
| 99.8 | 67.5 |
| 24.5 | 69.8 |
| 75.0 | 67.5 |
| 77.1 | 68.3 |
| 59.6 | 69.5 |
| 32.3 | 70 |
| 67.2 | 68.6 |
| 73.1 | 67.9 |
| 45.0 | 65.8 |
| 100.6 | 65.6 |
| 73.1 | 69.1 |
| 81.1 | 69.3 |
| 17.8 | 67.9 |
| 91.0 | 65.1 |
| 90.4 | 65.9 |
| 72.7 | 70.3 |
| 79.6 | 68.9 |
| 37.1 | 66.3 |
| 66.7 | 67.3 |
| 33.8 | 66.1 |
| 69.0 | 70.6 |
| 71.9 | 69.1 |
| 57.3 | 70.7 |
| 58.5 | 67.7 |
| 36.2 | 68 |
| 42.4 | 68.2 |
| 104.5 | 64.4 |
| 48.8 | 67.2 |
| 40.5 | 66.6 |
| 58.0 | 67.5 |
| 75.4 | 68.5 |
| 24.4 | 69.7 |
| 101.4 | 67.5 |
| 16.1 | 68.6 |
| 70.6 | 68.2 |
| 45.4 | 68.1 |
| 77.7 | 69.2 |
| 29.7 | 69.4 |
| 72.6 | 68 |
| 53.8 | 68.8 |
| 33.8 | 69.1 |
| 70.8 | 65.7 |
| 23.6 | 68.1 |
| 59.7 | 70.7 |
| 64.9 | 65.4 |
| 67.7 | 69.5 |
| 8.8 | 70 |
| 66.7 | 68.2 |
| 40.7 | 67.5 |
| 31.3 | 69 |
| 9.1 | 67.9 |
| 85.5 | 68.9 |
| 53.3 | 65.5 |
| 53.4 | 68.4 |
| 8.2 | 68.3 |
| 67.3 | 66.5 |
| 95.8 | 63.7 |
| 20.7 | 67.6 |
| 57.4 | 68.4 |
| 16.3 | 68.7 |
| 68.3 | 68.3 |
| 73.6 | 68.1 |
| 56.8 | 65.1 |
| 31.9 | 68.1 |
| 71.6 | 67.8 |
| 72.9 | 66.7 |
| 70.7 | 66.7 |
| 32.8 | 62.6 |
| 15.9 | 68.4 |
| 78.3 | 66.7 |
| 94.9 | 66.1 |
| 68.6 | 67.9 |
| 69.0 | 66.7 |
| 87.9 | 64 |
| 69.3 | 66.4 |
| 80.3 | 67.1 |
| 64.3 | 68.1 |
| 81.8 | 67.9 |
| 66.3 | 70.8 |
| 59.4 | 67.7 |
| 70.7 | 67.8 |
| 97.3 | 63.4 |
| 28.2 | 66.9 |
| 19.6 | 64.6 |
| 14.5 | 69.1 |
| 18.6 | 67 |
| 89.5 | 66.4 |
| 77.1 | 66 |
| 60.0 | 66.8 |
| 51.4 | 68.3 |
| 27.9 | 65.3 |
| 77.4 | 64.5 |
| 16.3 | 65.6 |
| 22.6 | 69.1 |
| 46.0 | 69.5 |
| 52.1 | 67.6 |
| 54.6 | 68 |
| 47.2 | 65.3 |
| 35.0 | 65.6 |
| 59.0 | 68 |
| 9.5 | 66.4 |
| 55.2 | 67.9 |
| 74.4 | 65.2 |
| 28.3 | 68.8 |
| 55.5 | 67 |
| 41.2 | 66.3 |
| 55.3 | 65.8 |
| 31.6 | 67.9 |
| 50.3 | 67.4 |
| 23.7 | 67.1 |
| 29.6 | 67.8 |
| 53.0 | 68.7 |
| 20.4 | 64.7 |
| 30.4 | 33 |
| 25.3 | 33.9 |
| 24.1 | 34 |
| 33.0 | 42.6 |
| 21.6 | 31.6 |
| 21.9 | 32.1 |
| 35.5 | 37.8 |
| 24.6 | 45.2 |